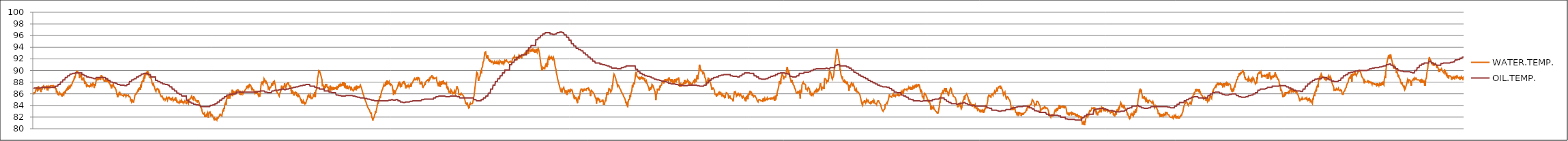
| Category | WATER.TEMP. | OIL.TEMP. |
|---|---|---|
| 2015-01-01_00:25:59 | 85.9 | 86.9 |
| 2015-01-01_00:26:00 | 85.8 | 86.9 |
| 2015-01-01_00:26:01 | 86.2 | 86.9 |
| 2015-01-01_00:26:02 | 86.3 | 87 |
| 2015-01-01_00:26:03 | 86.3 | 87 |
| 2015-01-01_00:26:03 | 86.2 | 87 |
| 2015-01-01_00:26:05 | 86.4 | 87 |
| 2015-01-01_00:26:06 | 86.5 | 87 |
| 2015-01-01_00:26:07 | 86.5 | 87 |
| 2015-01-01_00:26:08 | 86.9 | 87 |
| 2015-01-01_00:26:09 | 87.1 | 87 |
| 2015-01-01_00:26:10 | 86.9 | 87 |
| 2015-01-01_00:26:11 | 86.9 | 87 |
| 2015-01-01_00:26:12 | 86.4 | 87 |
| 2015-01-01_00:26:13 | 86.5 | 87 |
| 2015-01-01_00:26:14 | 87.1 | 87 |
| 2015-01-01_00:26:15 | 87.3 | 87 |
| 2015-01-01_00:26:16 | 86.8 | 87 |
| 2015-01-01_00:26:17 | 86.9 | 87 |
| 2015-01-01_00:26:18 | 87 | 87 |
| 2015-01-01_00:26:19 | 87.1 | 87 |
| 2015-01-01_00:26:20 | 87.1 | 87 |
| 2015-01-01_00:26:21 | 86.7 | 87 |
| 2015-01-01_00:26:22 | 86.7 | 87 |
| 2015-01-01_00:26:23 | 86.7 | 87 |
| 2015-01-01_00:26:24 | 86.3 | 87 |
| 2015-01-01_00:26:25 | 86.8 | 87 |
| 2015-01-01_00:26:26 | 86.9 | 87.1 |
| 2015-01-01_00:26:27 | 86.7 | 87.1 |
| 2015-01-01_00:26:28 | 86.8 | 87.1 |
| 2015-01-01_00:26:29 | 86.8 | 87.1 |
| 2015-01-01_00:26:30 | 87.2 | 87.1 |
| 2015-01-01_00:26:31 | 87.1 | 87.1 |
| 2015-01-01_00:26:32 | 87.2 | 87.1 |
| 2015-01-01_00:26:33 | 87.4 | 87.1 |
| 2015-01-01_00:26:34 | 87.5 | 87.1 |
| 2015-01-01_00:26:35 | 87.5 | 87.1 |
| 2015-01-01_00:26:36 | 87 | 87.1 |
| 2015-01-01_00:26:37 | 87.2 | 87.1 |
| 2015-01-01_00:26:38 | 87.3 | 87.1 |
| 2015-01-01_00:26:39 | 87.2 | 87.1 |
| 2015-01-01_00:26:40 | 87.2 | 87.1 |
| 2015-01-01_00:26:41 | 86.9 | 87.1 |
| 2015-01-01_00:26:42 | 87.2 | 87.1 |
| 2015-01-01_00:26:43 | 87.4 | 87.1 |
| 2015-01-01_00:26:44 | 87.2 | 87.1 |
| 2015-01-01_00:26:45 | 86.6 | 87.1 |
| 2015-01-01_00:26:46 | 87 | 87.1 |
| 2015-01-01_00:26:47 | 86.9 | 87.1 |
| 2015-01-01_00:26:48 | 86.8 | 87.1 |
| 2015-01-01_00:26:49 | 87.3 | 87.1 |
| 2015-01-01_00:26:50 | 86.9 | 87.1 |
| 2015-01-01_00:26:51 | 87.3 | 87.1 |
| 2015-01-01_00:26:52 | 87.4 | 87.1 |
| 2015-01-01_00:26:53 | 87.4 | 87.1 |
| 2015-01-01_00:26:54 | 87.1 | 87.1 |
| 2015-01-01_00:26:55 | 87 | 87.1 |
| 2015-01-01_00:26:56 | 87.4 | 87.1 |
| 2015-01-01_00:26:57 | 87.4 | 87.1 |
| 2015-01-01_00:26:58 | 87.5 | 87.1 |
| 2015-01-01_00:26:59 | 87.4 | 87.1 |
| 2015-01-01_00:27:00 | 87.4 | 87.1 |
| 2015-01-01_00:27:01 | 87.4 | 87.1 |
| 2015-01-01_00:27:02 | 87.4 | 87.1 |
| 2015-01-01_00:27:03 | 87.5 | 87.1 |
| 2015-01-01_00:27:04 | 87.5 | 87.1 |
| 2015-01-01_00:27:05 | 87.2 | 87.1 |
| 2015-01-01_00:27:06 | 87.4 | 87.1 |
| 2015-01-01_00:27:07 | 87.4 | 87.1 |
| 2015-01-01_00:27:08 | 87.4 | 87.1 |
| 2015-01-01_00:27:09 | 87.3 | 87.1 |
| 2015-01-01_00:27:10 | 87.3 | 87.1 |
| 2015-01-01_00:27:11 | 87.2 | 87.1 |
| 2015-01-01_00:27:12 | 87 | 87.1 |
| 2015-01-01_00:27:13 | 86.8 | 87.1 |
| 2015-01-01_00:27:14 | 87 | 87.3 |
| 2015-01-01_00:27:15 | 86.7 | 87.3 |
| 2015-01-01_00:27:16 | 86.2 | 87.3 |
| 2015-01-01_00:27:17 | 86.5 | 87.3 |
| 2015-01-01_00:27:18 | 86.4 | 87.3 |
| 2015-01-01_00:27:19 | 86.3 | 87.3 |
| 2015-01-01_00:27:20 | 86.2 | 87.3 |
| 2015-01-01_00:27:21 | 85.8 | 87.3 |
| 2015-01-01_00:27:22 | 86 | 87.6 |
| 2015-01-01_00:27:23 | 85.9 | 87.6 |
| 2015-01-01_00:27:24 | 85.8 | 87.6 |
| 2015-01-01_00:27:25 | 85.9 | 87.6 |
| 2015-01-01_00:27:26 | 86 | 87.6 |
| 2015-01-01_00:27:27 | 86.2 | 87.6 |
| 2015-01-01_00:27:28 | 86.2 | 87.6 |
| 2015-01-01_00:27:29 | 86 | 87.6 |
| 2015-01-01_00:27:30 | 86 | 88 |
| 2015-01-01_00:27:31 | 86.1 | 88 |
| 2015-01-01_00:27:32 | 85.8 | 88 |
| 2015-01-01_00:27:33 | 86 | 88 |
| 2015-01-01_00:27:34 | 85.8 | 88 |
| 2015-01-01_00:27:35 | 85.5 | 88 |
| 2015-01-01_00:27:36 | 86 | 88 |
| 2015-01-01_00:27:37 | 85.9 | 88 |
| 2015-01-01_00:27:38 | 85.7 | 88.4 |
| 2015-01-01_00:27:39 | 86.1 | 88.4 |
| 2015-01-01_00:27:40 | 86.1 | 88.4 |
| 2015-01-01_00:27:41 | 85.9 | 88.4 |
| 2015-01-01_00:27:42 | 86.2 | 88.4 |
| 2015-01-01_00:27:43 | 86.2 | 88.4 |
| 2015-01-01_00:27:44 | 86.3 | 88.4 |
| 2015-01-01_00:27:45 | 86.4 | 88.4 |
| 2015-01-01_00:27:46 | 86.1 | 88.8 |
| 2015-01-01_00:27:47 | 86.5 | 88.8 |
| 2015-01-01_00:27:48 | 86.5 | 88.8 |
| 2015-01-01_00:27:49 | 86.7 | 88.8 |
| 2015-01-01_00:27:50 | 86.5 | 88.8 |
| 2015-01-01_00:27:51 | 86.7 | 88.8 |
| 2015-01-01_00:27:52 | 86.8 | 88.8 |
| 2015-01-01_00:27:53 | 87 | 88.8 |
| 2015-01-01_00:27:54 | 87.1 | 89.1 |
| 2015-01-01_00:27:55 | 86.7 | 89.1 |
| 2015-01-01_00:27:56 | 87.2 | 89.1 |
| 2015-01-01_00:27:57 | 87.2 | 89.1 |
| 2015-01-01_00:27:58 | 86.8 | 89.1 |
| 2015-01-01_00:27:59 | 87.3 | 89.1 |
| 2015-01-01_00:28:00 | 87.2 | 89.1 |
| 2015-01-01_00:28:01 | 87.4 | 89.1 |
| 2015-01-01_00:28:02 | 87.1 | 89.4 |
| 2015-01-01_00:28:03 | 87.3 | 89.4 |
| 2015-01-01_00:28:04 | 87.3 | 89.4 |
| 2015-01-01_00:28:05 | 87.6 | 89.4 |
| 2015-01-01_00:28:06 | 87.3 | 89.4 |
| 2015-01-01_00:28:07 | 87.5 | 89.4 |
| 2015-01-01_00:28:08 | 87.4 | 89.4 |
| 2015-01-01_00:28:09 | 87.8 | 89.4 |
| 2015-01-01_00:28:10 | 87.9 | 89.5 |
| 2015-01-01_00:28:11 | 88.1 | 89.5 |
| 2015-01-01_00:28:12 | 88 | 89.5 |
| 2015-01-01_00:28:13 | 88.1 | 89.5 |
| 2015-01-01_00:28:14 | 88.3 | 89.5 |
| 2015-01-01_00:28:15 | 88.3 | 89.5 |
| 2015-01-01_00:28:16 | 88.3 | 89.5 |
| 2015-01-01_00:28:17 | 89 | 89.5 |
| 2015-01-01_00:28:18 | 88.8 | 89.6 |
| 2015-01-01_00:28:19 | 88.9 | 89.6 |
| 2015-01-01_00:28:20 | 89.1 | 89.6 |
| 2015-01-01_00:28:21 | 89.4 | 89.6 |
| 2015-01-01_00:28:22 | 89.4 | 89.6 |
| 2015-01-01_00:28:23 | 89.3 | 89.6 |
| 2015-01-01_00:28:24 | 89.9 | 89.6 |
| 2015-01-01_00:28:25 | 89.9 | 89.6 |
| 2015-01-01_00:28:26 | 89.9 | 89.6 |
| 2015-01-01_00:28:27 | 89.8 | 89.6 |
| 2015-01-01_00:28:28 | 89.8 | 89.6 |
| 2015-01-01_00:28:29 | 89.7 | 89.6 |
| 2015-01-01_00:28:30 | 89.7 | 89.6 |
| 2015-01-01_00:28:31 | 89.6 | 89.6 |
| 2015-01-01_00:28:32 | 89.4 | 89.6 |
| 2015-01-01_00:28:33 | 89.2 | 89.6 |
| 2015-01-01_00:28:34 | 88.7 | 89.6 |
| 2015-01-01_00:28:35 | 89.3 | 89.6 |
| 2015-01-01_00:28:36 | 89.2 | 89.6 |
| 2015-01-01_00:28:37 | 89.3 | 89.6 |
| 2015-01-01_00:28:38 | 88.9 | 89.6 |
| 2015-01-01_00:28:39 | 89.4 | 89.6 |
| 2015-01-01_00:28:40 | 89.1 | 89.6 |
| 2015-01-01_00:28:41 | 89 | 89.6 |
| 2015-01-01_00:28:42 | 88.3 | 89.3 |
| 2015-01-01_00:28:43 | 88.6 | 89.3 |
| 2015-01-01_00:28:44 | 88.7 | 89.3 |
| 2015-01-01_00:28:45 | 88.3 | 89.3 |
| 2015-01-01_00:28:46 | 88.6 | 89.3 |
| 2015-01-01_00:28:47 | 88.8 | 89.3 |
| 2015-01-01_00:28:48 | 88.6 | 89.3 |
| 2015-01-01_00:28:49 | 88.6 | 89.3 |
| 2015-01-01_00:28:50 | 88.1 | 89.1 |
| 2015-01-01_00:28:51 | 87.7 | 89.1 |
| 2015-01-01_00:28:52 | 88.1 | 89.1 |
| 2015-01-01_00:28:53 | 88 | 89.1 |
| 2015-01-01_00:28:54 | 88 | 89.1 |
| 2015-01-01_00:28:55 | 87.9 | 89.1 |
| 2015-01-01_00:28:56 | 87.7 | 89.1 |
| 2015-01-01_00:28:57 | 87.3 | 89.1 |
| 2015-01-01_00:28:58 | 87.2 | 88.9 |
| 2015-01-01_00:28:59 | 87.3 | 88.9 |
| 2015-01-01_00:29:00 | 87.5 | 88.9 |
| 2015-01-01_00:29:01 | 87.3 | 88.9 |
| 2015-01-01_00:29:02 | 87.2 | 88.9 |
| 2015-01-01_00:29:03 | 87.2 | 88.9 |
| 2015-01-01_00:29:04 | 87.3 | 88.9 |
| 2015-01-01_00:29:05 | 87.5 | 88.9 |
| 2015-01-01_00:29:06 | 87.2 | 88.8 |
| 2015-01-01_00:29:07 | 87.4 | 88.8 |
| 2015-01-01_00:29:08 | 87.2 | 88.8 |
| 2015-01-01_00:29:09 | 87.2 | 88.8 |
| 2015-01-01_00:29:10 | 87.3 | 88.8 |
| 2015-01-01_00:29:11 | 87.3 | 88.8 |
| 2015-01-01_00:29:12 | 87.7 | 88.8 |
| 2015-01-01_00:29:13 | 87.7 | 88.8 |
| 2015-01-01_00:29:14 | 87.6 | 88.7 |
| 2015-01-01_00:29:15 | 87.6 | 88.7 |
| 2015-01-01_00:29:16 | 87.4 | 88.7 |
| 2015-01-01_00:29:17 | 87.4 | 88.7 |
| 2015-01-01_00:29:18 | 87.7 | 88.7 |
| 2015-01-01_00:29:19 | 87.5 | 88.7 |
| 2015-01-01_00:29:20 | 87.7 | 88.7 |
| 2015-01-01_00:29:21 | 87.7 | 88.7 |
| 2015-01-01_00:29:22 | 87.4 | 88.6 |
| 2015-01-01_00:29:23 | 87 | 88.6 |
| 2015-01-01_00:29:24 | 87.3 | 88.6 |
| 2015-01-01_00:29:25 | 87.7 | 88.6 |
| 2015-01-01_00:29:26 | 87.6 | 88.6 |
| 2015-01-01_00:29:27 | 87.4 | 88.6 |
| 2015-01-01_00:29:28 | 87.8 | 88.6 |
| 2015-01-01_00:29:29 | 87.9 | 88.6 |
| 2015-01-01_00:29:30 | 88.4 | 88.8 |
| 2015-01-01_00:29:31 | 88.6 | 88.8 |
| 2015-01-01_00:29:32 | 88.4 | 88.8 |
| 2015-01-01_00:29:33 | 88.3 | 88.8 |
| 2015-01-01_00:29:34 | 88.4 | 88.8 |
| 2015-01-01_00:29:35 | 88.4 | 88.8 |
| 2015-01-01_00:29:36 | 88.8 | 88.8 |
| 2015-01-01_00:29:37 | 88.7 | 88.8 |
| 2015-01-01_00:29:38 | 88.5 | 88.8 |
| 2015-01-01_00:29:39 | 88.5 | 88.8 |
| 2015-01-01_00:29:40 | 88.4 | 88.8 |
| 2015-01-01_00:29:41 | 88.6 | 88.8 |
| 2015-01-01_00:29:42 | 88.7 | 88.8 |
| 2015-01-01_00:29:43 | 88.9 | 88.8 |
| 2015-01-01_00:29:44 | 88.4 | 88.8 |
| 2015-01-01_00:29:45 | 88.6 | 88.8 |
| 2015-01-01_00:29:46 | 88.8 | 88.8 |
| 2015-01-01_00:29:47 | 89.2 | 88.8 |
| 2015-01-01_00:29:48 | 88.9 | 88.8 |
| 2015-01-01_00:29:49 | 89.1 | 88.8 |
| 2015-01-01_00:29:50 | 88.9 | 88.8 |
| 2015-01-01_00:29:51 | 88.7 | 88.8 |
| 2015-01-01_00:29:52 | 88.9 | 88.8 |
| 2015-01-01_00:29:53 | 88.5 | 88.8 |
| 2015-01-01_00:29:54 | 88.4 | 88.8 |
| 2015-01-01_00:29:55 | 88.6 | 88.8 |
| 2015-01-01_00:29:56 | 88.3 | 88.8 |
| 2015-01-01_00:29:57 | 88.1 | 88.8 |
| 2015-01-01_00:29:58 | 88.4 | 88.8 |
| 2015-01-01_00:29:59 | 88.1 | 88.8 |
| 2015-01-01_00:30:00 | 88.3 | 88.8 |
| 2015-01-01_00:30:01 | 88.2 | 88.8 |
| 2015-01-01_00:30:02 | 88.5 | 88.6 |
| 2015-01-01_00:30:03 | 88.2 | 88.6 |
| 2015-01-01_00:30:04 | 88.4 | 88.6 |
| 2015-01-01_00:30:05 | 88.1 | 88.6 |
| 2015-01-01_00:30:06 | 88.5 | 88.6 |
| 2015-01-01_00:30:07 | 88 | 88.6 |
| 2015-01-01_00:30:08 | 88.3 | 88.6 |
| 2015-01-01_00:30:09 | 88.3 | 88.6 |
| 2015-01-01_00:30:10 | 88.1 | 88.3 |
| 2015-01-01_00:30:11 | 88.1 | 88.3 |
| 2015-01-01_00:30:12 | 88.4 | 88.3 |
| 2015-01-01_00:30:13 | 88.3 | 88.3 |
| 2015-01-01_00:30:14 | 87.8 | 88.3 |
| 2015-01-01_00:30:15 | 87.9 | 88.3 |
| 2015-01-01_00:30:16 | 87.8 | 88.3 |
| 2015-01-01_00:30:17 | 87.6 | 88.3 |
| 2015-01-01_00:30:18 | 87.3 | 88 |
| 2015-01-01_00:30:19 | 87.6 | 88 |
| 2015-01-01_00:30:20 | 87.3 | 88 |
| 2015-01-01_00:30:21 | 86.9 | 88 |
| 2015-01-01_00:30:22 | 87.3 | 88 |
| 2015-01-01_00:30:23 | 87.5 | 88 |
| 2015-01-01_00:30:24 | 87.3 | 88 |
| 2015-01-01_00:30:25 | 87.3 | 88 |
| 2015-01-01_00:30:26 | 87.4 | 87.9 |
| 2015-01-01_00:30:27 | 87.7 | 87.9 |
| 2015-01-01_00:30:28 | 87.7 | 87.9 |
| 2015-01-01_00:30:29 | 87.3 | 87.9 |
| 2015-01-01_00:30:30 | 87.3 | 87.9 |
| 2015-01-01_00:30:31 | 87.1 | 87.9 |
| 2015-01-01_00:30:32 | 87.2 | 87.9 |
| 2015-01-01_00:30:33 | 87.1 | 87.9 |
| 2015-01-01_00:30:34 | 87 | 87.8 |
| 2015-01-01_00:30:35 | 86.9 | 87.8 |
| 2015-01-01_00:30:36 | 86.9 | 87.8 |
| 2015-01-01_00:30:37 | 86.6 | 87.8 |
| 2015-01-01_00:30:38 | 86.3 | 87.8 |
| 2015-01-01_00:30:39 | 86.4 | 87.8 |
| 2015-01-01_00:30:40 | 85.8 | 87.8 |
| 2015-01-01_00:30:41 | 86 | 87.8 |
| 2015-01-01_00:30:42 | 85.4 | 87.6 |
| 2015-01-01_00:30:43 | 85.7 | 87.6 |
| 2015-01-01_00:30:44 | 85.8 | 87.6 |
| 2015-01-01_00:30:45 | 86 | 87.6 |
| 2015-01-01_00:30:46 | 86.1 | 87.6 |
| 2015-01-01_00:30:47 | 86.2 | 87.6 |
| 2015-01-01_00:30:48 | 85.9 | 87.6 |
| 2015-01-01_00:30:49 | 85.9 | 87.6 |
| 2015-01-01_00:30:50 | 86.1 | 87.5 |
| 2015-01-01_00:30:51 | 85.9 | 87.5 |
| 2015-01-01_00:30:52 | 86.1 | 87.5 |
| 2015-01-01_00:30:53 | 85.8 | 87.5 |
| 2015-01-01_00:30:54 | 85.8 | 87.5 |
| 2015-01-01_00:30:55 | 85.7 | 87.5 |
| 2015-01-01_00:30:56 | 85.8 | 87.5 |
| 2015-01-01_00:30:57 | 85.8 | 87.5 |
| 2015-01-01_00:30:58 | 85.8 | 87.5 |
| 2015-01-01_00:30:59 | 85.7 | 87.5 |
| 2015-01-01_00:31:00 | 85.8 | 87.5 |
| 2015-01-01_00:31:01 | 85.7 | 87.5 |
| 2015-01-01_00:31:02 | 85.6 | 87.5 |
| 2015-01-01_00:31:03 | 85.9 | 87.5 |
| 2015-01-01_00:31:04 | 85.7 | 87.5 |
| 2015-01-01_00:31:05 | 85.9 | 87.5 |
| 2015-01-01_00:31:06 | 85.9 | 87.4 |
| 2015-01-01_00:31:07 | 85.8 | 87.4 |
| 2015-01-01_00:31:08 | 85.8 | 87.4 |
| 2015-01-01_00:31:09 | 85.9 | 87.4 |
| 2015-01-01_00:31:10 | 85.5 | 87.4 |
| 2015-01-01_00:31:11 | 85.6 | 87.4 |
| 2015-01-01_00:31:12 | 85.8 | 87.4 |
| 2015-01-01_00:31:13 | 85.8 | 87.4 |
| 2015-01-01_00:31:14 | 85.8 | 87.6 |
| 2015-01-01_00:31:15 | 85.7 | 87.6 |
| 2015-01-01_00:31:16 | 85.8 | 87.6 |
| 2015-01-01_00:31:17 | 85.6 | 87.6 |
| 2015-01-01_00:31:18 | 85.8 | 87.6 |
| 2015-01-01_00:31:19 | 85.7 | 87.6 |
| 2015-01-01_00:31:20 | 85.5 | 87.6 |
| 2015-01-01_00:31:21 | 85.6 | 87.6 |
| 2015-01-01_00:31:22 | 85.6 | 88.1 |
| 2015-01-01_00:31:23 | 85.5 | 88.1 |
| 2015-01-01_00:31:24 | 85.4 | 88.1 |
| 2015-01-01_00:31:25 | 85.2 | 88.1 |
| 2015-01-01_00:31:26 | 84.7 | 88.1 |
| 2015-01-01_00:31:27 | 85.1 | 88.1 |
| 2015-01-01_00:31:28 | 84.9 | 88.1 |
| 2015-01-01_00:31:29 | 84.6 | 88.1 |
| 2015-01-01_00:31:30 | 84.7 | 88.4 |
| 2015-01-01_00:31:31 | 84.6 | 88.4 |
| 2015-01-01_00:31:32 | 84.9 | 88.4 |
| 2015-01-01_00:31:33 | 84.9 | 88.4 |
| 2015-01-01_00:31:34 | 84.7 | 88.4 |
| 2015-01-01_00:31:35 | 84.5 | 88.4 |
| 2015-01-01_00:31:36 | 84.7 | 88.4 |
| 2015-01-01_00:31:37 | 84.7 | 88.4 |
| 2015-01-01_00:31:38 | 85.1 | 88.6 |
| 2015-01-01_00:31:39 | 85.1 | 88.6 |
| 2015-01-01_00:31:40 | 85.7 | 88.6 |
| 2015-01-01_00:31:41 | 85.8 | 88.6 |
| 2015-01-01_00:31:42 | 85.9 | 88.6 |
| 2015-01-01_00:31:43 | 86.1 | 88.6 |
| 2015-01-01_00:31:44 | 85.9 | 88.6 |
| 2015-01-01_00:31:45 | 86.1 | 88.6 |
| 2015-01-01_00:31:46 | 86.2 | 88.9 |
| 2015-01-01_00:31:47 | 86.2 | 88.9 |
| 2015-01-01_00:31:48 | 86.3 | 88.9 |
| 2015-01-01_00:31:49 | 86.3 | 88.9 |
| 2015-01-01_00:31:50 | 86.4 | 88.9 |
| 2015-01-01_00:31:51 | 86.7 | 88.9 |
| 2015-01-01_00:31:52 | 86.4 | 88.9 |
| 2015-01-01_00:31:53 | 86.7 | 88.9 |
| 2015-01-01_00:31:54 | 86.7 | 89.1 |
| 2015-01-01_00:31:55 | 86.9 | 89.1 |
| 2015-01-01_00:31:56 | 86.7 | 89.1 |
| 2015-01-01_00:31:57 | 87.1 | 89.1 |
| 2015-01-01_00:31:58 | 86.9 | 89.1 |
| 2015-01-01_00:31:59 | 86.7 | 89.1 |
| 2015-01-01_00:32:00 | 87.6 | 89.1 |
| 2015-01-01_00:32:01 | 87.1 | 89.1 |
| 2015-01-01_00:32:02 | 87.5 | 89.4 |
| 2015-01-01_00:32:03 | 87.8 | 89.4 |
| 2015-01-01_00:32:04 | 87.9 | 89.4 |
| 2015-01-01_00:32:05 | 88.2 | 89.4 |
| 2015-01-01_00:32:06 | 88 | 89.4 |
| 2015-01-01_00:32:07 | 88.1 | 89.4 |
| 2015-01-01_00:32:08 | 88.4 | 89.4 |
| 2015-01-01_00:32:09 | 88.1 | 89.4 |
| 2015-01-01_00:32:10 | 88.8 | 89.5 |
| 2015-01-01_00:32:11 | 88.6 | 89.5 |
| 2015-01-01_00:32:12 | 89.1 | 89.5 |
| 2015-01-01_00:32:13 | 89.2 | 89.5 |
| 2015-01-01_00:32:14 | 88.9 | 89.5 |
| 2015-01-01_00:32:15 | 89.3 | 89.5 |
| 2015-01-01_00:32:16 | 89.4 | 89.5 |
| 2015-01-01_00:32:17 | 89.5 | 89.5 |
| 2015-01-01_00:32:18 | 89.5 | 89.5 |
| 2015-01-01_00:32:19 | 89.4 | 89.5 |
| 2015-01-01_00:32:20 | 89.7 | 89.5 |
| 2015-01-01_00:32:21 | 89.2 | 89.5 |
| 2015-01-01_00:32:22 | 89.6 | 89.5 |
| 2015-01-01_00:32:23 | 89.6 | 89.5 |
| 2015-01-01_00:32:24 | 89.8 | 89.5 |
| 2015-01-01_00:32:25 | 89.8 | 89.5 |
| 2015-01-01_00:32:26 | 89.6 | 89.3 |
| 2015-01-01_00:32:27 | 89.3 | 89.3 |
| 2015-01-01_00:32:28 | 89.2 | 89.3 |
| 2015-01-01_00:32:29 | 88.8 | 89.3 |
| 2015-01-01_00:32:30 | 88.7 | 89.3 |
| 2015-01-01_00:32:31 | 88.9 | 89.3 |
| 2015-01-01_00:32:32 | 88.8 | 89.3 |
| 2015-01-01_00:32:33 | 88.9 | 89.3 |
| 2015-01-01_00:32:34 | 88.7 | 88.9 |
| 2015-01-01_00:32:35 | 88.6 | 88.9 |
| 2015-01-01_00:32:36 | 88.5 | 88.9 |
| 2015-01-01_00:32:37 | 88.2 | 88.9 |
| 2015-01-01_00:32:38 | 87.8 | 88.9 |
| 2015-01-01_00:32:39 | 87.8 | 88.9 |
| 2015-01-01_00:32:40 | 87.7 | 88.9 |
| 2015-01-01_00:32:41 | 87.5 | 88.9 |
| 2015-01-01_00:32:42 | 87.6 | 88.9 |
| 2015-01-01_00:32:43 | 87.7 | 88.9 |
| 2015-01-01_00:32:44 | 87.4 | 88.9 |
| 2015-01-01_00:32:45 | 87.3 | 88.9 |
| 2015-01-01_00:32:46 | 87.2 | 88.9 |
| 2015-01-01_00:32:47 | 86.9 | 88.9 |
| 2015-01-01_00:32:48 | 86.8 | 88.9 |
| 2015-01-01_00:32:49 | 86.6 | 88.9 |
| 2015-01-01_00:32:50 | 86.7 | 88.3 |
| 2015-01-01_00:32:51 | 86.4 | 88.3 |
| 2015-01-01_00:32:52 | 86.7 | 88.3 |
| 2015-01-01_00:32:53 | 86.6 | 88.3 |
| 2015-01-01_00:32:54 | 86.8 | 88.3 |
| 2015-01-01_00:32:55 | 86.9 | 88.3 |
| 2015-01-01_00:32:56 | 86.9 | 88.3 |
| 2015-01-01_00:32:57 | 86.9 | 88.3 |
| 2015-01-01_00:32:58 | 86.7 | 88.1 |
| 2015-01-01_00:32:59 | 86.9 | 88.1 |
| 2015-01-01_00:33:00 | 87 | 88.1 |
| 2015-01-01_00:33:01 | 86.8 | 88.1 |
| 2015-01-01_00:33:02 | 86.2 | 88.1 |
| 2015-01-01_00:33:03 | 86.5 | 88.1 |
| 2015-01-01_00:33:04 | 86.1 | 88.1 |
| 2015-01-01_00:33:05 | 86.2 | 88.1 |
| 2015-01-01_00:33:06 | 86.2 | 87.9 |
| 2015-01-01_00:33:07 | 85.7 | 87.9 |
| 2015-01-01_00:33:08 | 85.7 | 87.9 |
| 2015-01-01_00:33:09 | 85.5 | 87.9 |
| 2015-01-01_00:33:10 | 85.6 | 87.9 |
| 2015-01-01_00:33:11 | 85.4 | 87.9 |
| 2015-01-01_00:33:12 | 85.6 | 87.9 |
| 2015-01-01_00:33:13 | 85.5 | 87.9 |
| 2015-01-01_00:33:14 | 85.3 | 87.7 |
| 2015-01-01_00:33:15 | 85.4 | 87.7 |
| 2015-01-01_00:33:16 | 85.1 | 87.7 |
| 2015-01-01_00:33:17 | 85.3 | 87.7 |
| 2015-01-01_00:33:18 | 85.1 | 87.7 |
| 2015-01-01_00:33:19 | 85.1 | 87.7 |
| 2015-01-01_00:33:20 | 85 | 87.7 |
| 2015-01-01_00:33:21 | 85.1 | 87.7 |
| 2015-01-01_00:33:22 | 84.9 | 87.6 |
| 2015-01-01_00:33:23 | 85 | 87.6 |
| 2015-01-01_00:33:24 | 85.1 | 87.6 |
| 2015-01-01_00:33:25 | 85.2 | 87.6 |
| 2015-01-01_00:33:26 | 85.2 | 87.6 |
| 2015-01-01_00:33:27 | 85.4 | 87.6 |
| 2015-01-01_00:33:28 | 85.4 | 87.6 |
| 2015-01-01_00:33:29 | 85.4 | 87.6 |
| 2015-01-01_00:33:30 | 84.9 | 87.5 |
| 2015-01-01_00:33:31 | 85.1 | 87.5 |
| 2015-01-01_00:33:32 | 85.1 | 87.5 |
| 2015-01-01_00:33:33 | 85.4 | 87.5 |
| 2015-01-01_00:33:34 | 85.3 | 87.5 |
| 2015-01-01_00:33:35 | 85.3 | 87.5 |
| 2015-01-01_00:33:36 | 85.4 | 87.5 |
| 2015-01-01_00:33:37 | 85.2 | 87.5 |
| 2015-01-01_00:33:38 | 85.1 | 87.2 |
| 2015-01-01_00:33:39 | 85 | 87.2 |
| 2015-01-01_00:33:40 | 85.1 | 87.2 |
| 2015-01-01_00:33:41 | 84.9 | 87.2 |
| 2015-01-01_00:33:42 | 85.2 | 87.2 |
| 2015-01-01_00:33:43 | 85.1 | 87.2 |
| 2015-01-01_00:33:44 | 85 | 87.2 |
| 2015-01-01_00:33:45 | 85 | 87.2 |
| 2015-01-01_00:33:46 | 85 | 86.8 |
| 2015-01-01_00:33:47 | 85.3 | 86.8 |
| 2015-01-01_00:33:48 | 85.1 | 86.8 |
| 2015-01-01_00:33:49 | 84.8 | 86.8 |
| 2015-01-01_00:33:50 | 84.9 | 86.8 |
| 2015-01-01_00:33:51 | 85 | 86.8 |
| 2015-01-01_00:33:52 | 85.1 | 86.8 |
| 2015-01-01_00:33:53 | 85.1 | 86.8 |
| 2015-01-01_00:33:54 | 85 | 86.5 |
| 2015-01-01_00:33:55 | 85.2 | 86.5 |
| 2015-01-01_00:33:56 | 84.8 | 86.5 |
| 2015-01-01_00:33:57 | 85.4 | 86.5 |
| 2015-01-01_00:33:58 | 85 | 86.5 |
| 2015-01-01_00:33:59 | 85 | 86.5 |
| 2015-01-01_00:34:00 | 84.8 | 86.5 |
| 2015-01-01_00:34:01 | 85 | 86.5 |
| 2015-01-01_00:34:02 | 84.6 | 86.1 |
| 2015-01-01_00:34:03 | 84.6 | 86.1 |
| 2015-01-01_00:34:04 | 84.7 | 86.1 |
| 2015-01-01_00:34:05 | 84.6 | 86.1 |
| 2015-01-01_00:34:06 | 84.4 | 86.1 |
| 2015-01-01_00:34:07 | 84.6 | 86.1 |
| 2015-01-01_00:34:08 | 84.4 | 86.1 |
| 2015-01-01_00:34:09 | 84.7 | 86.1 |
| 2015-01-01_00:34:10 | 84.5 | 85.9 |
| 2015-01-01_00:34:11 | 84.5 | 85.9 |
| 2015-01-01_00:34:12 | 84.8 | 85.9 |
| 2015-01-01_00:34:13 | 84.9 | 85.9 |
| 2015-01-01_00:34:14 | 84.6 | 85.9 |
| 2015-01-01_00:34:15 | 84.7 | 85.9 |
| 2015-01-01_00:34:16 | 84.6 | 85.9 |
| 2015-01-01_00:34:17 | 84.9 | 85.9 |
| 2015-01-01_00:34:18 | 84.5 | 85.6 |
| 2015-01-01_00:34:19 | 84.8 | 85.6 |
| 2015-01-01_00:34:20 | 84.7 | 85.6 |
| 2015-01-01_00:34:21 | 84.5 | 85.6 |
| 2015-01-01_00:34:22 | 84.5 | 85.6 |
| 2015-01-01_00:34:23 | 84.6 | 85.6 |
| 2015-01-01_00:34:24 | 84.6 | 85.6 |
| 2015-01-01_00:34:25 | 84.4 | 85.6 |
| 2015-01-01_00:34:26 | 84.3 | 85.6 |
| 2015-01-01_00:34:27 | 84.5 | 85.6 |
| 2015-01-01_00:34:28 | 84.8 | 85.6 |
| 2015-01-01_00:34:29 | 84.7 | 85.6 |
| 2015-01-01_00:34:30 | 84.7 | 85.6 |
| 2015-01-01_00:34:31 | 84.6 | 85.6 |
| 2015-01-01_00:34:32 | 84.5 | 85.6 |
| 2015-01-01_00:34:33 | 84.2 | 85.6 |
| 2015-01-01_00:34:34 | 84.5 | 84.9 |
| 2015-01-01_00:34:35 | 84.5 | 84.9 |
| 2015-01-01_00:34:36 | 84.7 | 84.9 |
| 2015-01-01_00:34:37 | 84.8 | 84.9 |
| 2015-01-01_00:34:38 | 84.5 | 84.9 |
| 2015-01-01_00:34:39 | 84.5 | 84.9 |
| 2015-01-01_00:34:40 | 84.3 | 84.9 |
| 2015-01-01_00:34:41 | 84.9 | 84.9 |
| 2015-01-01_00:34:42 | 84.7 | 84.6 |
| 2015-01-01_00:34:43 | 85.1 | 84.6 |
| 2015-01-01_00:34:44 | 85 | 84.6 |
| 2015-01-01_00:34:45 | 85.1 | 84.6 |
| 2015-01-01_00:34:46 | 85.1 | 84.6 |
| 2015-01-01_00:34:47 | 85.1 | 84.6 |
| 2015-01-01_00:34:48 | 85.3 | 84.6 |
| 2015-01-01_00:34:49 | 85.2 | 84.6 |
| 2015-01-01_00:34:50 | 85.3 | 84.4 |
| 2015-01-01_00:34:51 | 85.6 | 84.4 |
| 2015-01-01_00:34:52 | 85.4 | 84.4 |
| 2015-01-01_00:34:53 | 85.2 | 84.4 |
| 2015-01-01_00:34:54 | 85.1 | 84.4 |
| 2015-01-01_00:34:55 | 85.1 | 84.4 |
| 2015-01-01_00:34:56 | 85 | 84.4 |
| 2015-01-01_00:34:57 | 85.4 | 84.4 |
| 2015-01-01_00:34:58 | 85.6 | 84.2 |
| 2015-01-01_00:34:59 | 85.4 | 84.2 |
| 2015-01-01_00:35:00 | 85.4 | 84.2 |
| 2015-01-01_00:35:01 | 85.4 | 84.2 |
| 2015-01-01_00:35:02 | 85.2 | 84.2 |
| 2015-01-01_00:35:03 | 84.8 | 84.2 |
| 2015-01-01_00:35:04 | 85 | 84.2 |
| 2015-01-01_00:35:05 | 84.8 | 84.2 |
| 2015-01-01_00:35:06 | 84.9 | 84.1 |
| 2015-01-01_00:35:07 | 84.8 | 84.1 |
| 2015-01-01_00:35:08 | 84.8 | 84.1 |
| 2015-01-01_00:35:09 | 84.8 | 84.1 |
| 2015-01-01_00:35:10 | 84.5 | 84.1 |
| 2015-01-01_00:35:11 | 84.8 | 84.1 |
| 2015-01-01_00:35:12 | 84.9 | 84.1 |
| 2015-01-01_00:35:13 | 84.8 | 84.1 |
| 2015-01-01_00:35:14 | 84.8 | 84 |
| 2015-01-01_00:35:15 | 84.7 | 84 |
| 2015-01-01_00:35:16 | 84.5 | 84 |
| 2015-01-01_00:35:17 | 84.3 | 84 |
| 2015-01-01_00:35:18 | 84.2 | 84 |
| 2015-01-01_00:35:19 | 84.2 | 84 |
| 2015-01-01_00:35:20 | 83.9 | 84 |
| 2015-01-01_00:35:21 | 83.8 | 84 |
| 2015-01-01_00:35:22 | 83.8 | 83.8 |
| 2015-01-01_00:35:23 | 83.6 | 83.8 |
| 2015-01-01_00:35:24 | 83.5 | 83.8 |
| 2015-01-01_00:35:25 | 83.4 | 83.8 |
| 2015-01-01_00:35:26 | 83.1 | 83.8 |
| 2015-01-01_00:35:27 | 82.9 | 83.8 |
| 2015-01-01_00:35:28 | 82.7 | 83.8 |
| 2015-01-01_00:35:29 | 82.8 | 83.8 |
| 2015-01-01_00:35:30 | 82.6 | 83.8 |
| 2015-01-01_00:35:31 | 82.5 | 83.8 |
| 2015-01-01_00:35:32 | 82.5 | 83.8 |
| 2015-01-01_00:35:33 | 82.6 | 83.8 |
| 2015-01-01_00:35:34 | 82.7 | 83.8 |
| 2015-01-01_00:35:35 | 82.7 | 83.8 |
| 2015-01-01_00:35:36 | 82 | 83.8 |
| 2015-01-01_00:35:37 | 82.4 | 83.8 |
| 2015-01-01_00:35:38 | 82.3 | 83.8 |
| 2015-01-01_00:35:39 | 82.4 | 83.8 |
| 2015-01-01_00:35:40 | 82 | 83.8 |
| 2015-01-01_00:35:41 | 82.4 | 83.8 |
| 2015-01-01_00:35:42 | 82.4 | 83.8 |
| 2015-01-01_00:35:43 | 82.6 | 83.8 |
| 2015-01-01_00:35:44 | 82.5 | 83.8 |
| 2015-01-01_00:35:45 | 82.8 | 83.8 |
| 2015-01-01_00:35:46 | 82.4 | 83.8 |
| 2015-01-01_00:35:47 | 81.9 | 83.8 |
| 2015-01-01_00:35:48 | 82.4 | 83.8 |
| 2015-01-01_00:35:49 | 82.5 | 83.8 |
| 2015-01-01_00:35:50 | 82.8 | 83.8 |
| 2015-01-01_00:35:51 | 82.8 | 83.8 |
| 2015-01-01_00:35:52 | 82.9 | 83.8 |
| 2015-01-01_00:35:53 | 82.9 | 83.8 |
| 2015-01-01_00:35:54 | 82.7 | 84 |
| 2015-01-01_00:35:55 | 82.7 | 84 |
| 2015-01-01_00:35:56 | 82.1 | 84 |
| 2015-01-01_00:35:57 | 82.5 | 84 |
| 2015-01-01_00:35:58 | 82.6 | 84 |
| 2015-01-01_00:35:59 | 82.5 | 84 |
| 2015-01-01_00:36:00 | 82.4 | 84 |
| 2015-01-01_00:36:01 | 82.5 | 84 |
| 2015-01-01_00:36:02 | 82.2 | 84.1 |
| 2015-01-01_00:36:03 | 82.3 | 84.1 |
| 2015-01-01_00:36:04 | 82.1 | 84.1 |
| 2015-01-01_00:36:05 | 81.8 | 84.1 |
| 2015-01-01_00:36:06 | 81.7 | 84.1 |
| 2015-01-01_00:36:07 | 81.8 | 84.1 |
| 2015-01-01_00:36:08 | 81.4 | 84.1 |
| 2015-01-01_00:36:09 | 81.8 | 84.1 |
| 2015-01-01_00:36:10 | 81.8 | 84.3 |
| 2015-01-01_00:36:11 | 81.6 | 84.3 |
| 2015-01-01_00:36:12 | 81.7 | 84.3 |
| 2015-01-01_00:36:13 | 81.7 | 84.3 |
| 2015-01-01_00:36:14 | 81.7 | 84.3 |
| 2015-01-01_00:36:15 | 81.8 | 84.3 |
| 2015-01-01_00:36:16 | 81.5 | 84.3 |
| 2015-01-01_00:36:17 | 81.6 | 84.3 |
| 2015-01-01_00:36:18 | 82 | 84.6 |
| 2015-01-01_00:36:19 | 81.7 | 84.6 |
| 2015-01-01_00:36:20 | 81.7 | 84.6 |
| 2015-01-01_00:36:21 | 82 | 84.6 |
| 2015-01-01_00:36:22 | 81.9 | 84.6 |
| 2015-01-01_00:36:23 | 82 | 84.6 |
| 2015-01-01_00:36:24 | 82.1 | 84.6 |
| 2015-01-01_00:36:25 | 82.3 | 84.6 |
| 2015-01-01_00:36:26 | 82.3 | 84.9 |
| 2015-01-01_00:36:27 | 82.5 | 84.9 |
| 2015-01-01_00:36:28 | 82.6 | 84.9 |
| 2015-01-01_00:36:29 | 82.5 | 84.9 |
| 2015-01-01_00:36:30 | 82.3 | 84.9 |
| 2015-01-01_00:36:31 | 82.3 | 84.9 |
| 2015-01-01_00:36:32 | 82.4 | 84.9 |
| 2015-01-01_00:36:33 | 82.2 | 84.9 |
| 2015-01-01_00:36:34 | 82.6 | 85.2 |
| 2015-01-01_00:36:35 | 82.8 | 85.2 |
| 2015-01-01_00:36:36 | 83.1 | 85.2 |
| 2015-01-01_00:36:37 | 83.3 | 85.2 |
| 2015-01-01_00:36:38 | 83 | 85.2 |
| 2015-01-01_00:36:39 | 83.4 | 85.2 |
| 2015-01-01_00:36:40 | 83.6 | 85.2 |
| 2015-01-01_00:36:41 | 83.4 | 85.2 |
| 2015-01-01_00:36:42 | 83.9 | 85.5 |
| 2015-01-01_00:36:43 | 84.2 | 85.5 |
| 2015-01-01_00:36:44 | 84.1 | 85.5 |
| 2015-01-01_00:36:45 | 84.2 | 85.5 |
| 2015-01-01_00:36:46 | 84.6 | 85.5 |
| 2015-01-01_00:36:47 | 84.1 | 85.5 |
| 2015-01-01_00:36:48 | 84.9 | 85.5 |
| 2015-01-01_00:36:49 | 85 | 85.5 |
| 2015-01-01_00:36:50 | 85.2 | 85.8 |
| 2015-01-01_00:36:51 | 85.2 | 85.8 |
| 2015-01-01_00:36:52 | 85.4 | 85.8 |
| 2015-01-01_00:36:53 | 85.2 | 85.8 |
| 2015-01-01_00:36:54 | 85.5 | 85.8 |
| 2015-01-01_00:36:55 | 85.2 | 85.8 |
| 2015-01-01_00:36:56 | 85.6 | 85.8 |
| 2015-01-01_00:36:57 | 85.6 | 85.8 |
| 2015-01-01_00:36:58 | 85.6 | 85.9 |
| 2015-01-01_00:36:59 | 85.7 | 85.9 |
| 2015-01-01_00:37:00 | 85.2 | 85.9 |
| 2015-01-01_00:37:01 | 86 | 85.9 |
| 2015-01-01_00:37:02 | 86 | 85.9 |
| 2015-01-01_00:37:03 | 86 | 85.9 |
| 2015-01-01_00:37:04 | 85.8 | 85.9 |
| 2015-01-01_00:37:05 | 85.9 | 85.9 |
| 2015-01-01_00:37:06 | 86 | 86 |
| 2015-01-01_00:37:07 | 86.5 | 86 |
| 2015-01-01_00:37:08 | 86.7 | 86 |
| 2015-01-01_00:37:09 | 85.6 | 86 |
| 2015-01-01_00:37:10 | 86.2 | 86 |
| 2015-01-01_00:37:11 | 86.5 | 86 |
| 2015-01-01_00:37:12 | 86 | 86 |
| 2015-01-01_00:37:13 | 85.8 | 86 |
| 2015-01-01_00:37:14 | 86.1 | 86 |
| 2015-01-01_00:37:15 | 86.3 | 86 |
| 2015-01-01_00:37:16 | 86.3 | 86 |
| 2015-01-01_00:37:17 | 86.2 | 86 |
| 2015-01-01_00:37:18 | 86.2 | 86 |
| 2015-01-01_00:37:19 | 86.3 | 86 |
| 2015-01-01_00:37:20 | 86.3 | 86 |
| 2015-01-01_00:37:21 | 86.5 | 86 |
| 2015-01-01_00:37:22 | 86.5 | 86.3 |
| 2015-01-01_00:37:23 | 86.3 | 86.3 |
| 2015-01-01_00:37:24 | 86.6 | 86.3 |
| 2015-01-01_00:37:25 | 86.7 | 86.3 |
| 2015-01-01_00:37:26 | 86.7 | 86.3 |
| 2015-01-01_00:37:27 | 86.7 | 86.3 |
| 2015-01-01_00:37:28 | 86.6 | 86.3 |
| 2015-01-01_00:37:29 | 86.6 | 86.3 |
| 2015-01-01_00:37:30 | 86.5 | 86.3 |
| 2015-01-01_00:37:31 | 86.5 | 86.3 |
| 2015-01-01_00:37:32 | 86.3 | 86.3 |
| 2015-01-01_00:37:33 | 85.9 | 86.3 |
| 2015-01-01_00:37:34 | 86.5 | 86.3 |
| 2015-01-01_00:37:35 | 86.1 | 86.3 |
| 2015-01-01_00:37:36 | 85.8 | 86.3 |
| 2015-01-01_00:37:37 | 86.1 | 86.3 |
| 2015-01-01_00:37:38 | 85.8 | 86.3 |
| 2015-01-01_00:37:39 | 86.1 | 86.3 |
| 2015-01-01_00:37:40 | 86 | 86.3 |
| 2015-01-01_00:37:41 | 86.3 | 86.3 |
| 2015-01-01_00:37:42 | 86 | 86.3 |
| 2015-01-01_00:37:43 | 86.3 | 86.3 |
| 2015-01-01_00:37:44 | 86 | 86.3 |
| 2015-01-01_00:37:45 | 86.1 | 86.3 |
| 2015-01-01_00:37:46 | 86 | 86.3 |
| 2015-01-01_00:37:47 | 86.3 | 86.3 |
| 2015-01-01_00:37:48 | 86.2 | 86.3 |
| 2015-01-01_00:37:49 | 86.5 | 86.3 |
| 2015-01-01_00:37:50 | 86.4 | 86.3 |
| 2015-01-01_00:37:51 | 86.6 | 86.3 |
| 2015-01-01_00:37:52 | 86.7 | 86.3 |
| 2015-01-01_00:37:53 | 86.8 | 86.3 |
| 2015-01-01_00:37:54 | 86.7 | 86.3 |
| 2015-01-01_00:37:55 | 86.9 | 86.3 |
| 2015-01-01_00:37:56 | 87 | 86.3 |
| 2015-01-01_00:37:57 | 87.3 | 86.3 |
| 2015-01-01_00:37:58 | 87.1 | 86.3 |
| 2015-01-01_00:37:59 | 87.4 | 86.3 |
| 2015-01-01_00:38:00 | 87.4 | 86.3 |
| 2015-01-01_00:38:01 | 87 | 86.3 |
| 2015-01-01_00:38:02 | 87 | 86.3 |
| 2015-01-01_00:38:03 | 87.3 | 86.3 |
| 2015-01-01_00:38:04 | 87.1 | 86.3 |
| 2015-01-01_00:38:05 | 87.1 | 86.3 |
| 2015-01-01_00:38:06 | 87.6 | 86.3 |
| 2015-01-01_00:38:07 | 87.5 | 86.3 |
| 2015-01-01_00:38:08 | 87.7 | 86.3 |
| 2015-01-01_00:38:09 | 87.5 | 86.3 |
| 2015-01-01_00:38:10 | 87.4 | 86.3 |
| 2015-01-01_00:38:11 | 87.3 | 86.3 |
| 2015-01-01_00:38:12 | 87 | 86.3 |
| 2015-01-01_00:38:13 | 87 | 86.3 |
| 2015-01-01_00:38:14 | 86.7 | 86.3 |
| 2015-01-01_00:38:15 | 86.8 | 86.3 |
| 2015-01-01_00:38:16 | 86.9 | 86.3 |
| 2015-01-01_00:38:17 | 86.7 | 86.3 |
| 2015-01-01_00:38:18 | 86.7 | 86.3 |
| 2015-01-01_00:38:19 | 86.8 | 86.3 |
| 2015-01-01_00:38:20 | 86.7 | 86.3 |
| 2015-01-01_00:38:21 | 86.5 | 86.3 |
| 2015-01-01_00:38:22 | 86.6 | 86.3 |
| 2015-01-01_00:38:23 | 86.5 | 86.3 |
| 2015-01-01_00:38:24 | 86.1 | 86.3 |
| 2015-01-01_00:38:25 | 86 | 86.3 |
| 2015-01-01_00:38:26 | 86.5 | 86.3 |
| 2015-01-01_00:38:27 | 86.3 | 86.3 |
| 2015-01-01_00:38:28 | 86 | 86.3 |
| 2015-01-01_00:38:29 | 86.2 | 86.3 |
| 2015-01-01_00:38:30 | 86.4 | 86.3 |
| 2015-01-01_00:38:31 | 86.3 | 86.3 |
| 2015-01-01_00:38:32 | 86.3 | 86.3 |
| 2015-01-01_00:38:33 | 86.3 | 86.3 |
| 2015-01-01_00:38:34 | 86 | 86.4 |
| 2015-01-01_00:38:35 | 85.8 | 86.4 |
| 2015-01-01_00:38:36 | 85.7 | 86.4 |
| 2015-01-01_00:38:37 | 85.6 | 86.4 |
| 2015-01-01_00:38:38 | 85.8 | 86.4 |
| 2015-01-01_00:38:39 | 85.7 | 86.4 |
| 2015-01-01_00:38:40 | 85.5 | 86.4 |
| 2015-01-01_00:38:41 | 85.6 | 86.4 |
| 2015-01-01_00:38:42 | 86.1 | 86.5 |
| 2015-01-01_00:38:43 | 86.5 | 86.5 |
| 2015-01-01_00:38:44 | 87.2 | 86.5 |
| 2015-01-01_00:38:45 | 87.6 | 86.5 |
| 2015-01-01_00:38:46 | 87.8 | 86.5 |
| 2015-01-01_00:38:47 | 87.9 | 86.5 |
| 2015-01-01_00:38:48 | 88.1 | 86.5 |
| 2015-01-01_00:38:49 | 87.8 | 86.5 |
| 2015-01-01_00:38:50 | 87.7 | 86.5 |
| 2015-01-01_00:38:51 | 87.6 | 86.5 |
| 2015-01-01_00:38:52 | 88.2 | 86.5 |
| 2015-01-01_00:38:53 | 87.9 | 86.5 |
| 2015-01-01_00:38:54 | 88.1 | 86.5 |
| 2015-01-01_00:38:55 | 88.6 | 86.5 |
| 2015-01-01_00:38:56 | 88.7 | 86.5 |
| 2015-01-01_00:38:57 | 88.6 | 86.5 |
| 2015-01-01_00:38:58 | 88.3 | 86.3 |
| 2015-01-01_00:38:59 | 88.1 | 86.3 |
| 2015-01-01_00:39:00 | 88 | 86.3 |
| 2015-01-01_00:39:01 | 87.9 | 86.3 |
| 2015-01-01_00:39:02 | 88.1 | 86.3 |
| 2015-01-01_00:39:03 | 88.1 | 86.3 |
| 2015-01-01_00:39:04 | 88.1 | 86.3 |
| 2015-01-01_00:39:05 | 87.8 | 86.3 |
| 2015-01-01_00:39:06 | 87.7 | 86.2 |
| 2015-01-01_00:39:07 | 87.7 | 86.2 |
| 2015-01-01_00:39:08 | 87.3 | 86.2 |
| 2015-01-01_00:39:09 | 86.9 | 86.2 |
| 2015-01-01_00:39:10 | 87 | 86.2 |
| 2015-01-01_00:39:11 | 87.1 | 86.2 |
| 2015-01-01_00:39:12 | 86.9 | 86.2 |
| 2015-01-01_00:39:13 | 86.6 | 86.2 |
| 2015-01-01_00:39:14 | 87 | 86.2 |
| 2015-01-01_00:39:15 | 86.9 | 86.2 |
| 2015-01-01_00:39:16 | 87.1 | 86.2 |
| 2015-01-01_00:39:17 | 87.1 | 86.2 |
| 2015-01-01_00:39:18 | 87.2 | 86.2 |
| 2015-01-01_00:39:19 | 87.3 | 86.2 |
| 2015-01-01_00:39:20 | 87.5 | 86.2 |
| 2015-01-01_00:39:21 | 87.8 | 86.2 |
| 2015-01-01_00:39:22 | 87.8 | 86.5 |
| 2015-01-01_00:39:23 | 87.4 | 86.5 |
| 2015-01-01_00:39:24 | 87.4 | 86.5 |
| 2015-01-01_00:39:25 | 87.8 | 86.5 |
| 2015-01-01_00:39:26 | 88 | 86.5 |
| 2015-01-01_00:39:27 | 88.2 | 86.5 |
| 2015-01-01_00:39:28 | 87.9 | 86.5 |
| 2015-01-01_00:39:29 | 88 | 86.5 |
| 2015-01-01_00:39:30 | 88.1 | 86.6 |
| 2015-01-01_00:39:31 | 87.8 | 86.6 |
| 2015-01-01_00:39:32 | 87.8 | 86.6 |
| 2015-01-01_00:39:33 | 87.5 | 86.6 |
| 2015-01-01_00:39:34 | 87.1 | 86.6 |
| 2015-01-01_00:39:35 | 86.7 | 86.6 |
| 2015-01-01_00:39:36 | 86.4 | 86.6 |
| 2015-01-01_00:39:37 | 86.4 | 86.6 |
| 2015-01-01_00:39:38 | 86.5 | 86.6 |
| 2015-01-01_00:39:39 | 86.3 | 86.6 |
| 2015-01-01_00:39:40 | 86.1 | 86.6 |
| 2015-01-01_00:39:41 | 86 | 86.6 |
| 2015-01-01_00:39:42 | 86.1 | 86.6 |
| 2015-01-01_00:39:43 | 86 | 86.6 |
| 2015-01-01_00:39:44 | 85.8 | 86.6 |
| 2015-01-01_00:39:45 | 85.7 | 86.6 |
| 2015-01-01_00:39:46 | 85.6 | 86.7 |
| 2015-01-01_00:39:47 | 86 | 86.7 |
| 2015-01-01_00:39:48 | 85.9 | 86.7 |
| 2015-01-01_00:39:49 | 86 | 86.7 |
| 2015-01-01_00:39:50 | 86.3 | 86.7 |
| 2015-01-01_00:39:51 | 86.3 | 86.7 |
| 2015-01-01_00:39:52 | 86.7 | 86.7 |
| 2015-01-01_00:39:53 | 86.8 | 86.7 |
| 2015-01-01_00:39:54 | 87.4 | 86.8 |
| 2015-01-01_00:39:55 | 87.1 | 86.8 |
| 2015-01-01_00:39:56 | 87.2 | 86.8 |
| 2015-01-01_00:39:57 | 87.2 | 86.8 |
| 2015-01-01_00:39:58 | 87.1 | 86.8 |
| 2015-01-01_00:39:59 | 86.9 | 86.8 |
| 2015-01-01_00:40:00 | 87.2 | 86.8 |
| 2015-01-01_00:40:01 | 87.2 | 86.8 |
| 2015-01-01_00:40:02 | 87.3 | 86.7 |
| 2015-01-01_00:40:03 | 87.4 | 86.7 |
| 2015-01-01_00:40:04 | 87.8 | 86.7 |
| 2015-01-01_00:40:05 | 87.8 | 86.7 |
| 2015-01-01_00:40:06 | 87.8 | 86.7 |
| 2015-01-01_00:40:07 | 86.9 | 86.7 |
| 2015-01-01_00:40:08 | 87.4 | 86.7 |
| 2015-01-01_00:40:09 | 87.2 | 86.7 |
| 2015-01-01_00:40:10 | 87.1 | 86.8 |
| 2015-01-01_00:40:11 | 87.7 | 86.8 |
| 2015-01-01_00:40:12 | 87.6 | 86.8 |
| 2015-01-01_00:40:13 | 87.6 | 86.8 |
| 2015-01-01_00:40:14 | 87.7 | 86.8 |
| 2015-01-01_00:40:15 | 87.7 | 86.8 |
| 2015-01-01_00:40:16 | 88 | 86.8 |
| 2015-01-01_00:40:17 | 87.7 | 86.8 |
| 2015-01-01_00:40:18 | 87.6 | 86.9 |
| 2015-01-01_00:40:19 | 87.8 | 86.9 |
| 2015-01-01_00:40:20 | 87.4 | 86.9 |
| 2015-01-01_00:40:21 | 87.3 | 86.9 |
| 2015-01-01_00:40:22 | 87.2 | 86.9 |
| 2015-01-01_00:40:23 | 86.8 | 86.9 |
| 2015-01-01_00:40:24 | 87.4 | 86.9 |
| 2015-01-01_00:40:25 | 87 | 86.9 |
| 2015-01-01_00:40:26 | 86.5 | 87 |
| 2015-01-01_00:40:27 | 86.7 | 87 |
| 2015-01-01_00:40:28 | 86 | 87 |
| 2015-01-01_00:40:29 | 86 | 87 |
| 2015-01-01_00:40:30 | 86.5 | 87 |
| 2015-01-01_00:40:31 | 86.6 | 87 |
| 2015-01-01_00:40:32 | 86.4 | 87 |
| 2015-01-01_00:40:33 | 86.3 | 87 |
| 2015-01-01_00:40:34 | 86.1 | 87.1 |
| 2015-01-01_00:40:35 | 85.7 | 87.1 |
| 2015-01-01_00:40:36 | 85.8 | 87.1 |
| 2015-01-01_00:40:37 | 86 | 87.1 |
| 2015-01-01_00:40:38 | 85.8 | 87.1 |
| 2015-01-01_00:40:39 | 86.1 | 87.1 |
| 2015-01-01_00:40:40 | 86.2 | 87.1 |
| 2015-01-01_00:40:41 | 86.3 | 87.1 |
| 2015-01-01_00:40:42 | 86.4 | 87.2 |
| 2015-01-01_00:40:43 | 86.4 | 87.2 |
| 2015-01-01_00:40:44 | 86.2 | 87.2 |
| 2015-01-01_00:40:45 | 85.7 | 87.2 |
| 2015-01-01_00:40:46 | 85.8 | 87.2 |
| 2015-01-01_00:40:47 | 85.6 | 87.2 |
| 2015-01-01_00:40:48 | 85.7 | 87.2 |
| 2015-01-01_00:40:49 | 85.4 | 87.2 |
| 2015-01-01_00:40:50 | 85.9 | 87.3 |
| 2015-01-01_00:40:51 | 85.9 | 87.3 |
| 2015-01-01_00:40:52 | 85.9 | 87.3 |
| 2015-01-01_00:40:53 | 85.7 | 87.3 |
| 2015-01-01_00:40:54 | 85.7 | 87.3 |
| 2015-01-01_00:40:55 | 85.5 | 87.3 |
| 2015-01-01_00:40:56 | 85.3 | 87.3 |
| 2015-01-01_00:40:57 | 85.3 | 87.3 |
| 2015-01-01_00:40:58 | 85.3 | 87.4 |
| 2015-01-01_00:40:59 | 84.9 | 87.4 |
| 2015-01-01_00:41:00 | 85.1 | 87.4 |
| 2015-01-01_00:41:01 | 85.1 | 87.4 |
| 2015-01-01_00:41:02 | 84.4 | 87.4 |
| 2015-01-01_00:41:03 | 84.7 | 87.4 |
| 2015-01-01_00:41:04 | 84.7 | 87.4 |
| 2015-01-01_00:41:05 | 84.5 | 87.4 |
| 2015-01-01_00:41:06 | 84.6 | 87.5 |
| 2015-01-01_00:41:07 | 84.8 | 87.5 |
| 2015-01-01_00:41:08 | 84.6 | 87.5 |
| 2015-01-01_00:41:09 | 84.3 | 87.5 |
| 2015-01-01_00:41:10 | 84.6 | 87.5 |
| 2015-01-01_00:41:11 | 84.5 | 87.5 |
| 2015-01-01_00:41:12 | 84.3 | 87.5 |
| 2015-01-01_00:41:13 | 84.5 | 87.5 |
| 2015-01-01_00:41:14 | 84.2 | 87.6 |
| 2015-01-01_00:41:15 | 84.3 | 87.6 |
| 2015-01-01_00:41:16 | 84.5 | 87.6 |
| 2015-01-01_00:41:17 | 84.6 | 87.6 |
| 2015-01-01_00:41:18 | 84.9 | 87.6 |
| 2015-01-01_00:41:19 | 84.9 | 87.6 |
| 2015-01-01_00:41:20 | 85 | 87.6 |
| 2015-01-01_00:41:21 | 85.2 | 87.6 |
| 2015-01-01_00:41:22 | 85.6 | 87.6 |
| 2015-01-01_00:41:23 | 85.5 | 87.6 |
| 2015-01-01_00:41:24 | 85.8 | 87.6 |
| 2015-01-01_00:41:25 | 85.5 | 87.6 |
| 2015-01-01_00:41:26 | 85.6 | 87.6 |
| 2015-01-01_00:41:27 | 85.6 | 87.6 |
| 2015-01-01_00:41:28 | 85.4 | 87.6 |
| 2015-01-01_00:41:29 | 85.3 | 87.6 |
| 2015-01-01_00:41:30 | 85.9 | 87.3 |
| 2015-01-01_00:41:31 | 85.9 | 87.3 |
| 2015-01-01_00:41:32 | 85.6 | 87.3 |
| 2015-01-01_00:41:33 | 85.1 | 87.3 |
| 2015-01-01_00:41:34 | 85.3 | 87.3 |
| 2015-01-01_00:41:35 | 85.3 | 87.3 |
| 2015-01-01_00:41:36 | 85.3 | 87.3 |
| 2015-01-01_00:41:37 | 85.2 | 87.3 |
| 2015-01-01_00:41:38 | 85.2 | 87.3 |
| 2015-01-01_00:41:39 | 85.3 | 87.3 |
| 2015-01-01_00:41:40 | 85.5 | 87.3 |
| 2015-01-01_00:41:41 | 85.9 | 87.3 |
| 2015-01-01_00:41:42 | 85.5 | 87.3 |
| 2015-01-01_00:41:43 | 85.9 | 87.3 |
| 2015-01-01_00:41:44 | 85.8 | 87.3 |
| 2015-01-01_00:41:45 | 85.5 | 87.3 |
| 2015-01-01_00:41:46 | 86.3 | 87.1 |
| 2015-01-01_00:41:47 | 85.4 | 87.1 |
| 2015-01-01_00:41:48 | 85.7 | 87.1 |
| 2015-01-01_00:41:49 | 86.5 | 87.1 |
| 2015-01-01_00:41:50 | 86.4 | 87.1 |
| 2015-01-01_00:41:51 | 86.7 | 87.1 |
| 2015-01-01_00:41:52 | 86.7 | 87.1 |
| 2015-01-01_00:41:53 | 86.7 | 87.1 |
| 2015-01-01_00:41:54 | 87.8 | 87 |
| 2015-01-01_00:41:55 | 88.7 | 87 |
| 2015-01-01_00:41:56 | 88.7 | 87 |
| 2015-01-01_00:41:57 | 89.1 | 87 |
| 2015-01-01_00:41:58 | 89 | 87 |
| 2015-01-01_00:41:59 | 90 | 87 |
| 2015-01-01_00:42:00 | 89.9 | 87 |
| 2015-01-01_00:42:01 | 90 | 87 |
| 2015-01-01_00:42:02 | 89.9 | 86.8 |
| 2015-01-01_00:42:03 | 89.7 | 86.8 |
| 2015-01-01_00:42:04 | 89.6 | 86.8 |
| 2015-01-01_00:42:05 | 89.4 | 86.8 |
| 2015-01-01_00:42:06 | 89.2 | 86.8 |
| 2015-01-01_00:42:07 | 89.1 | 86.8 |
| 2015-01-01_00:42:08 | 88.8 | 86.8 |
| 2015-01-01_00:42:09 | 88.6 | 86.8 |
| 2015-01-01_00:42:10 | 88.4 | 86.8 |
| 2015-01-01_00:42:11 | 87.4 | 86.8 |
| 2015-01-01_00:42:12 | 87.5 | 86.8 |
| 2015-01-01_00:42:13 | 87.4 | 86.8 |
| 2015-01-01_00:42:14 | 87.5 | 86.8 |
| 2015-01-01_00:42:15 | 87.4 | 86.8 |
| 2015-01-01_00:42:16 | 86.8 | 86.8 |
| 2015-01-01_00:42:17 | 86.9 | 86.8 |
| 2015-01-01_00:42:18 | 87.1 | 86.5 |
| 2015-01-01_00:42:19 | 86.9 | 86.5 |
| 2015-01-01_00:42:20 | 87.3 | 86.5 |
| 2015-01-01_00:42:21 | 87 | 86.5 |
| 2015-01-01_00:42:22 | 87.7 | 86.5 |
| 2015-01-01_00:42:23 | 87.2 | 86.5 |
| 2015-01-01_00:42:24 | 87.3 | 86.5 |
| 2015-01-01_00:42:25 | 87.7 | 86.5 |
| 2015-01-01_00:42:26 | 87.5 | 86.5 |
| 2015-01-01_00:42:27 | 87.4 | 86.5 |
| 2015-01-01_00:42:28 | 87.1 | 86.5 |
| 2015-01-01_00:42:29 | 87 | 86.5 |
| 2015-01-01_00:42:30 | 87 | 86.5 |
| 2015-01-01_00:42:31 | 87.1 | 86.5 |
| 2015-01-01_00:42:32 | 86.4 | 86.5 |
| 2015-01-01_00:42:33 | 86.9 | 86.5 |
| 2015-01-01_00:42:34 | 86.9 | 86.3 |
| 2015-01-01_00:42:35 | 86.7 | 86.3 |
| 2015-01-01_00:42:36 | 86.9 | 86.3 |
| 2015-01-01_00:42:37 | 87.4 | 86.3 |
| 2015-01-01_00:42:38 | 87.2 | 86.3 |
| 2015-01-01_00:42:39 | 87 | 86.3 |
| 2015-01-01_00:42:40 | 86.7 | 86.3 |
| 2015-01-01_00:42:41 | 86.6 | 86.3 |
| 2015-01-01_00:42:42 | 86.7 | 86.2 |
| 2015-01-01_00:42:43 | 87.1 | 86.2 |
| 2015-01-01_00:42:44 | 87.1 | 86.2 |
| 2015-01-01_00:42:45 | 86.8 | 86.2 |
| 2015-01-01_00:42:46 | 86.8 | 86.2 |
| 2015-01-01_00:42:47 | 87 | 86.2 |
| 2015-01-01_00:42:48 | 86.9 | 86.2 |
| 2015-01-01_00:42:49 | 86.7 | 86.2 |
| 2015-01-01_00:42:50 | 87.1 | 86.2 |
| 2015-01-01_00:42:51 | 86.8 | 86.2 |
| 2015-01-01_00:42:52 | 86.8 | 86.2 |
| 2015-01-01_00:42:53 | 86.9 | 86.2 |
| 2015-01-01_00:42:54 | 86.9 | 86.2 |
| 2015-01-01_00:42:55 | 87.1 | 86.2 |
| 2015-01-01_00:42:56 | 86.8 | 86.2 |
| 2015-01-01_00:42:57 | 86.9 | 86.2 |
| 2015-01-01_00:42:58 | 87.1 | 85.8 |
| 2015-01-01_00:42:59 | 87 | 85.8 |
| 2015-01-01_00:43:00 | 86.7 | 85.8 |
| 2015-01-01_00:43:01 | 87 | 85.8 |
| 2015-01-01_00:43:02 | 87.2 | 85.8 |
| 2015-01-01_00:43:03 | 87.2 | 85.8 |
| 2015-01-01_00:43:04 | 87.1 | 85.8 |
| 2015-01-01_00:43:05 | 87.1 | 85.8 |
| 2015-01-01_00:43:06 | 87.6 | 85.7 |
| 2015-01-01_00:43:07 | 87.3 | 85.7 |
| 2015-01-01_00:43:08 | 87.3 | 85.7 |
| 2015-01-01_00:43:09 | 87.5 | 85.7 |
| 2015-01-01_00:43:10 | 87.2 | 85.7 |
| 2015-01-01_00:43:11 | 87.3 | 85.7 |
| 2015-01-01_00:43:12 | 87.6 | 85.7 |
| 2015-01-01_00:43:13 | 87.6 | 85.7 |
| 2015-01-01_00:43:14 | 87.3 | 85.6 |
| 2015-01-01_00:43:15 | 87.7 | 85.6 |
| 2015-01-01_00:43:16 | 87.4 | 85.6 |
| 2015-01-01_00:43:17 | 87.6 | 85.6 |
| 2015-01-01_00:43:18 | 87.5 | 85.6 |
| 2015-01-01_00:43:19 | 87.8 | 85.6 |
| 2015-01-01_00:43:20 | 88 | 85.6 |
| 2015-01-01_00:43:21 | 87.7 | 85.6 |
| 2015-01-01_00:43:22 | 87.4 | 85.6 |
| 2015-01-01_00:43:23 | 87.8 | 85.6 |
| 2015-01-01_00:43:24 | 88 | 85.6 |
| 2015-01-01_00:43:25 | 88 | 85.6 |
| 2015-01-01_00:43:26 | 87.1 | 85.6 |
| 2015-01-01_00:43:27 | 87.8 | 85.6 |
| 2015-01-01_00:43:28 | 87.6 | 85.6 |
| 2015-01-01_00:43:29 | 87.6 | 85.6 |
| 2015-01-01_00:43:30 | 86.9 | 85.7 |
| 2015-01-01_00:43:31 | 87.2 | 85.7 |
| 2015-01-01_00:43:32 | 87.2 | 85.7 |
| 2015-01-01_00:43:33 | 87 | 85.7 |
| 2015-01-01_00:43:34 | 87 | 85.7 |
| 2015-01-01_00:43:35 | 87.4 | 85.7 |
| 2015-01-01_00:43:36 | 87.3 | 85.7 |
| 2015-01-01_00:43:37 | 86.8 | 85.7 |
| 2015-01-01_00:43:38 | 86.8 | 85.7 |
| 2015-01-01_00:43:39 | 87.2 | 85.7 |
| 2015-01-01_00:43:40 | 87 | 85.7 |
| 2015-01-01_00:43:41 | 86.9 | 85.7 |
| 2015-01-01_00:43:42 | 87.3 | 85.7 |
| 2015-01-01_00:43:43 | 87.2 | 85.7 |
| 2015-01-01_00:43:44 | 87.3 | 85.7 |
| 2015-01-01_00:43:45 | 87.1 | 85.7 |
| 2015-01-01_00:43:46 | 87.1 | 85.7 |
| 2015-01-01_00:43:47 | 86.6 | 85.7 |
| 2015-01-01_00:43:48 | 87.2 | 85.7 |
| 2015-01-01_00:43:49 | 86.8 | 85.7 |
| 2015-01-01_00:43:50 | 86.7 | 85.7 |
| 2015-01-01_00:43:51 | 86.7 | 85.7 |
| 2015-01-01_00:43:52 | 86.8 | 85.7 |
| 2015-01-01_00:43:53 | 86.7 | 85.7 |
| 2015-01-01_00:43:54 | 86.9 | 85.6 |
| 2015-01-01_00:43:55 | 86.5 | 85.6 |
| 2015-01-01_00:43:56 | 86.5 | 85.6 |
| 2015-01-01_00:43:57 | 86.6 | 85.6 |
| 2015-01-01_00:43:58 | 86.7 | 85.6 |
| 2015-01-01_00:43:59 | 87.1 | 85.6 |
| 2015-01-01_00:44:00 | 86.7 | 85.6 |
| 2015-01-01_00:44:01 | 87.2 | 85.6 |
| 2015-01-01_00:44:02 | 87.1 | 85.5 |
| 2015-01-01_00:44:03 | 86.8 | 85.5 |
| 2015-01-01_00:44:04 | 87.2 | 85.5 |
| 2015-01-01_00:44:05 | 86.6 | 85.5 |
| 2015-01-01_00:44:06 | 87.4 | 85.5 |
| 2015-01-01_00:44:07 | 87 | 85.5 |
| 2015-01-01_00:44:08 | 87 | 85.5 |
| 2015-01-01_00:44:09 | 86.9 | 85.5 |
| 2015-01-01_00:44:10 | 86.9 | 85.4 |
| 2015-01-01_00:44:11 | 86.9 | 85.4 |
| 2015-01-01_00:44:12 | 87.3 | 85.4 |
| 2015-01-01_00:44:13 | 87 | 85.4 |
| 2015-01-01_00:44:14 | 87.2 | 85.4 |
| 2015-01-01_00:44:15 | 87 | 85.4 |
| 2015-01-01_00:44:16 | 87.2 | 85.4 |
| 2015-01-01_00:44:17 | 87.2 | 85.4 |
| 2015-01-01_00:44:18 | 87.2 | 85.3 |
| 2015-01-01_00:44:19 | 87.5 | 85.3 |
| 2015-01-01_00:44:20 | 87.4 | 85.3 |
| 2015-01-01_00:44:21 | 87.2 | 85.3 |
| 2015-01-01_00:44:22 | 87.1 | 85.3 |
| 2015-01-01_00:44:23 | 87 | 85.3 |
| 2015-01-01_00:44:24 | 86.8 | 85.3 |
| 2015-01-01_00:44:25 | 86.6 | 85.3 |
| 2015-01-01_00:44:26 | 86.4 | 85.3 |
| 2015-01-01_00:44:27 | 86.2 | 85.3 |
| 2015-01-01_00:44:28 | 86 | 85.3 |
| 2015-01-01_00:44:29 | 86 | 85.3 |
| 2015-01-01_00:44:30 | 85.8 | 85.3 |
| 2015-01-01_00:44:31 | 85.6 | 85.3 |
| 2015-01-01_00:44:32 | 85.3 | 85.3 |
| 2015-01-01_00:44:33 | 85.2 | 85.3 |
| 2015-01-01_00:44:34 | 85.1 | 85.2 |
| 2015-01-01_00:44:35 | 85 | 85.2 |
| 2015-01-01_00:44:36 | 84.8 | 85.2 |
| 2015-01-01_00:44:37 | 84.7 | 85.2 |
| 2015-01-01_00:44:38 | 84.6 | 85.2 |
| 2015-01-01_00:44:39 | 84.4 | 85.2 |
| 2015-01-01_00:44:40 | 84.3 | 85.2 |
| 2015-01-01_00:44:41 | 84.1 | 85.2 |
| 2015-01-01_00:44:42 | 84.1 | 85.1 |
| 2015-01-01_00:44:43 | 84 | 85.1 |
| 2015-01-01_00:44:44 | 83.7 | 85.1 |
| 2015-01-01_00:44:45 | 83.6 | 85.1 |
| 2015-01-01_00:44:46 | 83.7 | 85.1 |
| 2015-01-01_00:44:47 | 83.4 | 85.1 |
| 2015-01-01_00:44:48 | 83.3 | 85.1 |
| 2015-01-01_00:44:49 | 83.3 | 85.1 |
| 2015-01-01_00:44:50 | 83.2 | 85 |
| 2015-01-01_00:44:51 | 83 | 85 |
| 2015-01-01_00:44:52 | 83.1 | 85 |
| 2015-01-01_00:44:53 | 82.7 | 85 |
| 2015-01-01_00:44:54 | 82.7 | 85 |
| 2015-01-01_00:44:55 | 82.7 | 85 |
| 2015-01-01_00:44:56 | 82.7 | 85 |
| 2015-01-01_00:44:57 | 82.2 | 85 |
| 2015-01-01_00:44:58 | 81.9 | 84.9 |
| 2015-01-01_00:44:59 | 81.9 | 84.9 |
| 2015-01-01_00:45:00 | 81.7 | 84.9 |
| 2015-01-01_00:45:01 | 81.4 | 84.9 |
| 2015-01-01_00:45:02 | 81.8 | 84.9 |
| 2015-01-01_00:45:03 | 81.7 | 84.9 |
| 2015-01-01_00:45:04 | 81.8 | 84.9 |
| 2015-01-01_00:45:05 | 81.9 | 84.9 |
| 2015-01-01_00:45:06 | 82.1 | 84.8 |
| 2015-01-01_00:45:07 | 82.4 | 84.8 |
| 2015-01-01_00:45:08 | 82.4 | 84.8 |
| 2015-01-01_00:45:09 | 82.6 | 84.8 |
| 2015-01-01_00:45:10 | 83 | 84.8 |
| 2015-01-01_00:45:11 | 82.7 | 84.8 |
| 2015-01-01_00:45:12 | 82.9 | 84.8 |
| 2015-01-01_00:45:13 | 83.2 | 84.8 |
| 2015-01-01_00:45:14 | 83.3 | 84.8 |
| 2015-01-01_00:45:15 | 83.7 | 84.8 |
| 2015-01-01_00:45:16 | 84 | 84.8 |
| 2015-01-01_00:45:17 | 84.2 | 84.8 |
| 2015-01-01_00:45:18 | 84.5 | 84.8 |
| 2015-01-01_00:45:19 | 84.3 | 84.8 |
| 2015-01-01_00:45:20 | 84.9 | 84.8 |
| 2015-01-01_00:45:21 | 84.9 | 84.8 |
| 2015-01-01_00:45:22 | 84.8 | 84.8 |
| 2015-01-01_00:45:23 | 85 | 84.8 |
| 2015-01-01_00:45:24 | 85.2 | 84.8 |
| 2015-01-01_00:45:25 | 85.6 | 84.8 |
| 2015-01-01_00:45:26 | 85.3 | 84.8 |
| 2015-01-01_00:45:27 | 85.6 | 84.8 |
| 2015-01-01_00:45:28 | 85.8 | 84.8 |
| 2015-01-01_00:45:29 | 86 | 84.8 |
| 2015-01-01_00:45:30 | 86.3 | 84.8 |
| 2015-01-01_00:45:31 | 86.2 | 84.8 |
| 2015-01-01_00:45:32 | 86.6 | 84.8 |
| 2015-01-01_00:45:33 | 86.6 | 84.8 |
| 2015-01-01_00:45:34 | 86.8 | 84.8 |
| 2015-01-01_00:45:35 | 87 | 84.8 |
| 2015-01-01_00:45:36 | 86.9 | 84.8 |
| 2015-01-01_00:45:37 | 87 | 84.8 |
| 2015-01-01_00:45:38 | 87.5 | 84.8 |
| 2015-01-01_00:45:39 | 87.3 | 84.8 |
| 2015-01-01_00:45:40 | 87.4 | 84.8 |
| 2015-01-01_00:45:41 | 87.4 | 84.8 |
| 2015-01-01_00:45:42 | 87.4 | 84.8 |
| 2015-01-01_00:45:43 | 87.8 | 84.8 |
| 2015-01-01_00:45:44 | 87.8 | 84.8 |
| 2015-01-01_00:45:45 | 87.6 | 84.8 |
| 2015-01-01_00:45:46 | 87.8 | 84.8 |
| 2015-01-01_00:45:47 | 87.8 | 84.8 |
| 2015-01-01_00:45:48 | 87.5 | 84.8 |
| 2015-01-01_00:45:49 | 88.3 | 84.8 |
| 2015-01-01_00:45:50 | 87.9 | 84.8 |
| 2015-01-01_00:45:51 | 88.1 | 84.8 |
| 2015-01-01_00:45:52 | 88 | 84.8 |
| 2015-01-01_00:45:53 | 87.7 | 84.8 |
| 2015-01-01_00:45:54 | 87.9 | 84.9 |
| 2015-01-01_00:45:55 | 88 | 84.9 |
| 2015-01-01_00:45:56 | 88.1 | 84.9 |
| 2015-01-01_00:45:57 | 87.7 | 84.9 |
| 2015-01-01_00:45:58 | 87.6 | 84.9 |
| 2015-01-01_00:45:59 | 87.6 | 84.9 |
| 2015-01-01_00:46:00 | 87.5 | 84.9 |
| 2015-01-01_00:46:01 | 87.7 | 84.9 |
| 2015-01-01_00:46:02 | 87.7 | 85 |
| 2015-01-01_00:46:03 | 87.6 | 85 |
| 2015-01-01_00:46:04 | 87.6 | 85 |
| 2015-01-01_00:46:05 | 87.6 | 85 |
| 2015-01-01_00:46:06 | 87.4 | 85 |
| 2015-01-01_00:46:07 | 87.1 | 85 |
| 2015-01-01_00:46:08 | 86.8 | 85 |
| 2015-01-01_00:46:09 | 86.5 | 85 |
| 2015-01-01_00:46:10 | 86.7 | 84.9 |
| 2015-01-01_00:46:11 | 85.8 | 84.9 |
| 2015-01-01_00:46:12 | 86.3 | 84.9 |
| 2015-01-01_00:46:13 | 86 | 84.9 |
| 2015-01-01_00:46:14 | 86 | 84.9 |
| 2015-01-01_00:46:15 | 86.4 | 84.9 |
| 2015-01-01_00:46:16 | 86.3 | 84.9 |
| 2015-01-01_00:46:17 | 86.2 | 84.9 |
| 2015-01-01_00:46:18 | 86.5 | 85 |
| 2015-01-01_00:46:19 | 86.6 | 85 |
| 2015-01-01_00:46:20 | 86.7 | 85 |
| 2015-01-01_00:46:21 | 86.8 | 85 |
| 2015-01-01_00:46:22 | 86.9 | 85 |
| 2015-01-01_00:46:23 | 87 | 85 |
| 2015-01-01_00:46:24 | 87.1 | 85 |
| 2015-01-01_00:46:25 | 87.1 | 85 |
| 2015-01-01_00:46:26 | 87.1 | 84.8 |
| 2015-01-01_00:46:27 | 87.7 | 84.8 |
| 2015-01-01_00:46:28 | 87.6 | 84.8 |
| 2015-01-01_00:46:29 | 87.5 | 84.8 |
| 2015-01-01_00:46:30 | 87.6 | 84.8 |
| 2015-01-01_00:46:31 | 88.1 | 84.8 |
| 2015-01-01_00:46:32 | 87.6 | 84.8 |
| 2015-01-01_00:46:33 | 87.8 | 84.8 |
| 2015-01-01_00:46:34 | 87.3 | 84.6 |
| 2015-01-01_00:46:35 | 87.4 | 84.6 |
| 2015-01-01_00:46:36 | 87.5 | 84.6 |
| 2015-01-01_00:46:37 | 87.2 | 84.6 |
| 2015-01-01_00:46:38 | 87.4 | 84.6 |
| 2015-01-01_00:46:39 | 87.5 | 84.6 |
| 2015-01-01_00:46:40 | 87.7 | 84.6 |
| 2015-01-01_00:46:41 | 87.9 | 84.6 |
| 2015-01-01_00:46:42 | 87.9 | 84.5 |
| 2015-01-01_00:46:43 | 88 | 84.5 |
| 2015-01-01_00:46:44 | 88 | 84.5 |
| 2015-01-01_00:46:45 | 88.2 | 84.5 |
| 2015-01-01_00:46:46 | 87.8 | 84.5 |
| 2015-01-01_00:46:47 | 88.1 | 84.5 |
| 2015-01-01_00:46:48 | 87.6 | 84.5 |
| 2015-01-01_00:46:49 | 87.8 | 84.5 |
| 2015-01-01_00:46:50 | 87.5 | 84.6 |
| 2015-01-01_00:46:51 | 87.3 | 84.6 |
| 2015-01-01_00:46:52 | 86.9 | 84.6 |
| 2015-01-01_00:46:53 | 87.2 | 84.6 |
| 2015-01-01_00:46:54 | 87.5 | 84.6 |
| 2015-01-01_00:46:55 | 87.2 | 84.6 |
| 2015-01-01_00:46:56 | 87.3 | 84.6 |
| 2015-01-01_00:46:57 | 87.1 | 84.6 |
| 2015-01-01_00:46:58 | 87.2 | 84.6 |
| 2015-01-01_00:46:59 | 87.2 | 84.6 |
| 2015-01-01_00:47:00 | 87.5 | 84.6 |
| 2015-01-01_00:47:01 | 87.4 | 84.6 |
| 2015-01-01_00:47:02 | 87.4 | 84.6 |
| 2015-01-01_00:47:03 | 87.1 | 84.6 |
| 2015-01-01_00:47:04 | 87.4 | 84.6 |
| 2015-01-01_00:47:05 | 87.2 | 84.6 |
| 2015-01-01_00:47:06 | 87.4 | 84.7 |
| 2015-01-01_00:47:07 | 87.2 | 84.7 |
| 2015-01-01_00:47:08 | 87.6 | 84.7 |
| 2015-01-01_00:47:09 | 87.7 | 84.7 |
| 2015-01-01_00:47:10 | 87.7 | 84.7 |
| 2015-01-01_00:47:11 | 87.4 | 84.7 |
| 2015-01-01_00:47:12 | 87.8 | 84.7 |
| 2015-01-01_00:47:13 | 87.7 | 84.7 |
| 2015-01-01_00:47:14 | 87.8 | 84.8 |
| 2015-01-01_00:47:15 | 87.9 | 84.8 |
| 2015-01-01_00:47:16 | 88.1 | 84.8 |
| 2015-01-01_00:47:17 | 88.2 | 84.8 |
| 2015-01-01_00:47:18 | 88.1 | 84.8 |
| 2015-01-01_00:47:19 | 88.4 | 84.8 |
| 2015-01-01_00:47:20 | 88.4 | 84.8 |
| 2015-01-01_00:47:21 | 88.6 | 84.8 |
| 2015-01-01_00:47:22 | 88.4 | 84.8 |
| 2015-01-01_00:47:23 | 88.5 | 84.8 |
| 2015-01-01_00:47:24 | 88.4 | 84.8 |
| 2015-01-01_00:47:25 | 88.4 | 84.8 |
| 2015-01-01_00:47:26 | 88.4 | 84.8 |
| 2015-01-01_00:47:27 | 88.6 | 84.8 |
| 2015-01-01_00:47:28 | 88.4 | 84.8 |
| 2015-01-01_00:47:29 | 88.8 | 84.8 |
| 2015-01-01_00:47:30 | 88.6 | 84.8 |
| 2015-01-01_00:47:31 | 88.6 | 84.8 |
| 2015-01-01_00:47:32 | 88.4 | 84.8 |
| 2015-01-01_00:47:33 | 88.6 | 84.8 |
| 2015-01-01_00:47:34 | 88.8 | 84.8 |
| 2015-01-01_00:47:35 | 88.8 | 84.8 |
| 2015-01-01_00:47:36 | 88.8 | 84.8 |
| 2015-01-01_00:47:37 | 88.7 | 84.8 |
| 2015-01-01_00:47:38 | 88.4 | 84.8 |
| 2015-01-01_00:47:39 | 88.2 | 84.8 |
| 2015-01-01_00:47:40 | 87.7 | 84.8 |
| 2015-01-01_00:47:41 | 87.6 | 84.8 |
| 2015-01-01_00:47:42 | 87.6 | 84.8 |
| 2015-01-01_00:47:43 | 87.7 | 84.8 |
| 2015-01-01_00:47:44 | 87.6 | 84.8 |
| 2015-01-01_00:47:45 | 87.7 | 84.8 |
| 2015-01-01_00:47:46 | 88.1 | 85 |
| 2015-01-01_00:47:47 | 87.6 | 85 |
| 2015-01-01_00:47:48 | 87.4 | 85 |
| 2015-01-01_00:47:49 | 87.3 | 85 |
| 2015-01-01_00:47:50 | 87 | 85 |
| 2015-01-01_00:47:51 | 87.3 | 85 |
| 2015-01-01_00:47:52 | 87.2 | 85 |
| 2015-01-01_00:47:53 | 87.4 | 85 |
| 2015-01-01_00:47:54 | 87.4 | 85.1 |
| 2015-01-01_00:47:55 | 87.5 | 85.1 |
| 2015-01-01_00:47:56 | 87.7 | 85.1 |
| 2015-01-01_00:47:57 | 87.5 | 85.1 |
| 2015-01-01_00:47:58 | 87.9 | 85.1 |
| 2015-01-01_00:47:59 | 88 | 85.1 |
| 2015-01-01_00:48:00 | 88.1 | 85.1 |
| 2015-01-01_00:48:01 | 88.1 | 85.1 |
| 2015-01-01_00:48:02 | 88 | 85.1 |
| 2015-01-01_00:48:03 | 88.3 | 85.1 |
| 2015-01-01_00:48:04 | 88.4 | 85.1 |
| 2015-01-01_00:48:05 | 88.4 | 85.1 |
| 2015-01-01_00:48:06 | 88.3 | 85.1 |
| 2015-01-01_00:48:07 | 88.5 | 85.1 |
| 2015-01-01_00:48:08 | 88.2 | 85.1 |
| 2015-01-01_00:48:09 | 88.3 | 85.1 |
| 2015-01-01_00:48:10 | 88.3 | 85.1 |
| 2015-01-01_00:48:11 | 88.6 | 85.1 |
| 2015-01-01_00:48:12 | 88.4 | 85.1 |
| 2015-01-01_00:48:13 | 88.4 | 85.1 |
| 2015-01-01_00:48:14 | 88.6 | 85.1 |
| 2015-01-01_00:48:15 | 88.6 | 85.1 |
| 2015-01-01_00:48:16 | 88.9 | 85.1 |
| 2015-01-01_00:48:17 | 88.8 | 85.1 |
| 2015-01-01_00:48:18 | 88.8 | 85.1 |
| 2015-01-01_00:48:19 | 88.9 | 85.1 |
| 2015-01-01_00:48:20 | 89.2 | 85.1 |
| 2015-01-01_00:48:21 | 89 | 85.1 |
| 2015-01-01_00:48:22 | 88.8 | 85.1 |
| 2015-01-01_00:48:23 | 88.9 | 85.1 |
| 2015-01-01_00:48:24 | 88.6 | 85.1 |
| 2015-01-01_00:48:25 | 88.6 | 85.1 |
| 2015-01-01_00:48:26 | 88.8 | 85.3 |
| 2015-01-01_00:48:27 | 88.8 | 85.3 |
| 2015-01-01_00:48:28 | 88.9 | 85.3 |
| 2015-01-01_00:48:29 | 88.6 | 85.3 |
| 2015-01-01_00:48:30 | 88.6 | 85.3 |
| 2015-01-01_00:48:31 | 88.5 | 85.3 |
| 2015-01-01_00:48:32 | 88.7 | 85.3 |
| 2015-01-01_00:48:33 | 88.6 | 85.3 |
| 2015-01-01_00:48:34 | 88.8 | 85.5 |
| 2015-01-01_00:48:35 | 88.8 | 85.5 |
| 2015-01-01_00:48:36 | 88.3 | 85.5 |
| 2015-01-01_00:48:37 | 88.2 | 85.5 |
| 2015-01-01_00:48:38 | 87.9 | 85.5 |
| 2015-01-01_00:48:39 | 87.9 | 85.5 |
| 2015-01-01_00:48:40 | 87.8 | 85.5 |
| 2015-01-01_00:48:41 | 87.5 | 85.5 |
| 2015-01-01_00:48:42 | 87.3 | 85.6 |
| 2015-01-01_00:48:43 | 87.8 | 85.6 |
| 2015-01-01_00:48:44 | 87.8 | 85.6 |
| 2015-01-01_00:48:45 | 88 | 85.6 |
| 2015-01-01_00:48:46 | 87.9 | 85.6 |
| 2015-01-01_00:48:47 | 88.1 | 85.6 |
| 2015-01-01_00:48:48 | 87.2 | 85.6 |
| 2015-01-01_00:48:49 | 88.1 | 85.6 |
| 2015-01-01_00:48:50 | 88.1 | 85.6 |
| 2015-01-01_00:48:51 | 87.8 | 85.6 |
| 2015-01-01_00:48:52 | 87.5 | 85.6 |
| 2015-01-01_00:48:53 | 87.9 | 85.6 |
| 2015-01-01_00:48:54 | 87.8 | 85.6 |
| 2015-01-01_00:48:55 | 88.2 | 85.6 |
| 2015-01-01_00:48:56 | 87.9 | 85.6 |
| 2015-01-01_00:48:57 | 88 | 85.6 |
| 2015-01-01_00:48:58 | 88.1 | 85.6 |
| 2015-01-01_00:48:59 | 88.3 | 85.6 |
| 2015-01-01_00:49:00 | 87.6 | 85.6 |
| 2015-01-01_00:49:01 | 87.9 | 85.6 |
| 2015-01-01_00:49:02 | 87.9 | 85.6 |
| 2015-01-01_00:49:03 | 87.8 | 85.6 |
| 2015-01-01_00:49:04 | 87.8 | 85.6 |
| 2015-01-01_00:49:05 | 87.8 | 85.6 |
| 2015-01-01_00:49:06 | 87.9 | 85.5 |
| 2015-01-01_00:49:07 | 87.6 | 85.5 |
| 2015-01-01_00:49:08 | 87.6 | 85.5 |
| 2015-01-01_00:49:09 | 87.8 | 85.5 |
| 2015-01-01_00:49:10 | 87.1 | 85.5 |
| 2015-01-01_00:49:11 | 87.1 | 85.5 |
| 2015-01-01_00:49:12 | 86.9 | 85.5 |
| 2015-01-01_00:49:13 | 87 | 85.5 |
| 2015-01-01_00:49:14 | 87.1 | 85.5 |
| 2015-01-01_00:49:15 | 86.9 | 85.5 |
| 2015-01-01_00:49:16 | 86.8 | 85.5 |
| 2015-01-01_00:49:17 | 86.3 | 85.5 |
| 2015-01-01_00:49:18 | 86.2 | 85.5 |
| 2015-01-01_00:49:19 | 86.2 | 85.5 |
| 2015-01-01_00:49:20 | 86.4 | 85.5 |
| 2015-01-01_00:49:21 | 86.3 | 85.5 |
| 2015-01-01_00:49:22 | 86 | 85.6 |
| 2015-01-01_00:49:23 | 86.2 | 85.6 |
| 2015-01-01_00:49:24 | 86.7 | 85.6 |
| 2015-01-01_00:49:25 | 86.8 | 85.6 |
| 2015-01-01_00:49:26 | 86.6 | 85.6 |
| 2015-01-01_00:49:27 | 86.5 | 85.6 |
| 2015-01-01_00:49:28 | 86.4 | 85.6 |
| 2015-01-01_00:49:29 | 86.2 | 85.6 |
| 2015-01-01_00:49:30 | 86 | 85.6 |
| 2015-01-01_00:49:31 | 86 | 85.6 |
| 2015-01-01_00:49:32 | 85.9 | 85.6 |
| 2015-01-01_00:49:33 | 86.1 | 85.6 |
| 2015-01-01_00:49:34 | 86 | 85.6 |
| 2015-01-01_00:49:35 | 86 | 85.6 |
| 2015-01-01_00:49:36 | 86.5 | 85.6 |
| 2015-01-01_00:49:37 | 86.2 | 85.6 |
| 2015-01-01_00:49:38 | 86.1 | 85.6 |
| 2015-01-01_00:49:39 | 86 | 85.6 |
| 2015-01-01_00:49:40 | 86.3 | 85.6 |
| 2015-01-01_00:49:41 | 86.6 | 85.6 |
| 2015-01-01_00:49:42 | 86.7 | 85.6 |
| 2015-01-01_00:49:43 | 86.9 | 85.6 |
| 2015-01-01_00:49:44 | 87.3 | 85.6 |
| 2015-01-01_00:49:45 | 87.2 | 85.6 |
| 2015-01-01_00:49:46 | 87 | 85.5 |
| 2015-01-01_00:49:47 | 87 | 85.5 |
| 2015-01-01_00:49:48 | 86.9 | 85.5 |
| 2015-01-01_00:49:49 | 86.7 | 85.5 |
| 2015-01-01_00:49:50 | 86.1 | 85.5 |
| 2015-01-01_00:49:51 | 85.8 | 85.5 |
| 2015-01-01_00:49:52 | 85.9 | 85.5 |
| 2015-01-01_00:49:53 | 85.7 | 85.5 |
| 2015-01-01_00:49:54 | 85.9 | 85.3 |
| 2015-01-01_00:49:55 | 85.8 | 85.3 |
| 2015-01-01_00:49:56 | 85.9 | 85.3 |
| 2015-01-01_00:49:57 | 85.8 | 85.3 |
| 2015-01-01_00:49:58 | 86.2 | 85.3 |
| 2015-01-01_00:49:59 | 86 | 85.3 |
| 2015-01-01_00:50:00 | 86 | 85.3 |
| 2015-01-01_00:50:01 | 85.9 | 85.3 |
| 2015-01-01_00:50:02 | 85.9 | 85.3 |
| 2015-01-01_00:50:03 | 85.9 | 85.3 |
| 2015-01-01_00:50:04 | 85.9 | 85.3 |
| 2015-01-01_00:50:05 | 85.7 | 85.3 |
| 2015-01-01_00:50:06 | 85.8 | 85.3 |
| 2015-01-01_00:50:07 | 85.6 | 85.3 |
| 2015-01-01_00:50:08 | 85.4 | 85.3 |
| 2015-01-01_00:50:09 | 85.3 | 85.3 |
| 2015-01-01_00:50:10 | 85.2 | 85.3 |
| 2015-01-01_00:50:11 | 85.1 | 85.3 |
| 2015-01-01_00:50:12 | 84.7 | 85.3 |
| 2015-01-01_00:50:13 | 84.6 | 85.3 |
| 2015-01-01_00:50:14 | 84.3 | 85.3 |
| 2015-01-01_00:50:15 | 84.2 | 85.3 |
| 2015-01-01_00:50:16 | 84.3 | 85.3 |
| 2015-01-01_00:50:17 | 84.2 | 85.3 |
| 2015-01-01_00:50:18 | 84.5 | 85.3 |
| 2015-01-01_00:50:19 | 84.5 | 85.3 |
| 2015-01-01_00:50:20 | 84.2 | 85.3 |
| 2015-01-01_00:50:21 | 84 | 85.3 |
| 2015-01-01_00:50:22 | 84 | 85.3 |
| 2015-01-01_00:50:23 | 83.7 | 85.3 |
| 2015-01-01_00:50:24 | 83.9 | 85.3 |
| 2015-01-01_00:50:25 | 83.5 | 85.3 |
| 2015-01-01_00:50:26 | 84.1 | 85.3 |
| 2015-01-01_00:50:27 | 84.2 | 85.3 |
| 2015-01-01_00:50:28 | 84.2 | 85.3 |
| 2015-01-01_00:50:29 | 84.4 | 85.3 |
| 2015-01-01_00:50:30 | 84.2 | 85.3 |
| 2015-01-01_00:50:31 | 84.3 | 85.3 |
| 2015-01-01_00:50:32 | 84.2 | 85.3 |
| 2015-01-01_00:50:33 | 84.3 | 85.3 |
| 2015-01-01_00:50:34 | 84.4 | 85.3 |
| 2015-01-01_00:50:35 | 84.3 | 85.3 |
| 2015-01-01_00:50:36 | 84.3 | 85.3 |
| 2015-01-01_00:50:37 | 84.4 | 85.3 |
| 2015-01-01_00:50:38 | 84.6 | 85.3 |
| 2015-01-01_00:50:39 | 84.7 | 85.3 |
| 2015-01-01_00:50:40 | 85.2 | 85.3 |
| 2015-01-01_00:50:41 | 85.5 | 85.3 |
| 2015-01-01_00:50:42 | 85.7 | 85 |
| 2015-01-01_00:50:43 | 85.8 | 85 |
| 2015-01-01_00:50:44 | 86.6 | 85 |
| 2015-01-01_00:50:45 | 87.1 | 85 |
| 2015-01-01_00:50:46 | 87.5 | 85 |
| 2015-01-01_00:50:47 | 87.6 | 85 |
| 2015-01-01_00:50:48 | 88.4 | 85 |
| 2015-01-01_00:50:49 | 88.9 | 85 |
| 2015-01-01_00:50:50 | 89.4 | 84.8 |
| 2015-01-01_00:50:51 | 89.7 | 84.8 |
| 2015-01-01_00:50:52 | 89.8 | 84.8 |
| 2015-01-01_00:50:53 | 89.6 | 84.8 |
| 2015-01-01_00:50:54 | 89.5 | 84.8 |
| 2015-01-01_00:50:55 | 89 | 84.8 |
| 2015-01-01_00:50:56 | 88.5 | 84.8 |
| 2015-01-01_00:50:57 | 88.2 | 84.8 |
| 2015-01-01_00:50:58 | 88.5 | 84.8 |
| 2015-01-01_00:50:59 | 88.6 | 84.8 |
| 2015-01-01_00:51:00 | 88.8 | 84.8 |
| 2015-01-01_00:51:01 | 88.8 | 84.8 |
| 2015-01-01_00:51:02 | 89 | 84.8 |
| 2015-01-01_00:51:03 | 89.4 | 84.8 |
| 2015-01-01_00:51:04 | 89.8 | 84.8 |
| 2015-01-01_00:51:05 | 89.9 | 84.8 |
| 2015-01-01_00:51:06 | 90.1 | 85 |
| 2015-01-01_00:51:07 | 89.5 | 85 |
| 2015-01-01_00:51:08 | 90.4 | 85 |
| 2015-01-01_00:51:09 | 90.5 | 85 |
| 2015-01-01_00:51:10 | 90.6 | 85 |
| 2015-01-01_00:51:11 | 90.9 | 85 |
| 2015-01-01_00:51:12 | 91.4 | 85 |
| 2015-01-01_00:51:13 | 91.3 | 85 |
| 2015-01-01_00:51:14 | 91.5 | 85.3 |
| 2015-01-01_00:51:15 | 91.7 | 85.3 |
| 2015-01-01_00:51:16 | 92.3 | 85.3 |
| 2015-01-01_00:51:17 | 92.4 | 85.3 |
| 2015-01-01_00:51:18 | 93.1 | 85.3 |
| 2015-01-01_00:51:19 | 93.2 | 85.3 |
| 2015-01-01_00:51:20 | 93 | 85.3 |
| 2015-01-01_00:51:21 | 93.2 | 85.3 |
| 2015-01-01_00:51:22 | 92.8 | 85.6 |
| 2015-01-01_00:51:23 | 92.7 | 85.6 |
| 2015-01-01_00:51:24 | 92.2 | 85.6 |
| 2015-01-01_00:51:25 | 92.4 | 85.6 |
| 2015-01-01_00:51:26 | 92.1 | 85.6 |
| 2015-01-01_00:51:27 | 92 | 85.6 |
| 2015-01-01_00:51:28 | 92.6 | 85.6 |
| 2015-01-01_00:51:29 | 92.3 | 85.6 |
| 2015-01-01_00:51:30 | 92.2 | 86.1 |
| 2015-01-01_00:51:31 | 92.2 | 86.1 |
| 2015-01-01_00:51:32 | 91.7 | 86.1 |
| 2015-01-01_00:51:33 | 92 | 86.1 |
| 2015-01-01_00:51:34 | 92 | 86.1 |
| 2015-01-01_00:51:35 | 92 | 86.1 |
| 2015-01-01_00:51:36 | 91.5 | 86.1 |
| 2015-01-01_00:51:37 | 91.8 | 86.1 |
| 2015-01-01_00:51:38 | 91.7 | 86.8 |
| 2015-01-01_00:51:39 | 91.5 | 86.8 |
| 2015-01-01_00:51:40 | 91.3 | 86.8 |
| 2015-01-01_00:51:41 | 91.3 | 86.8 |
| 2015-01-01_00:51:42 | 91.7 | 86.8 |
| 2015-01-01_00:51:43 | 91.5 | 86.8 |
| 2015-01-01_00:51:44 | 91.4 | 86.8 |
| 2015-01-01_00:51:45 | 91.6 | 86.8 |
| 2015-01-01_00:51:46 | 91.4 | 87.5 |
| 2015-01-01_00:51:47 | 91.2 | 87.5 |
| 2015-01-01_00:51:48 | 91.3 | 87.5 |
| 2015-01-01_00:51:49 | 91.2 | 87.5 |
| 2015-01-01_00:51:50 | 91.5 | 87.5 |
| 2015-01-01_00:51:51 | 91.1 | 87.5 |
| 2015-01-01_00:51:52 | 91.2 | 87.5 |
| 2015-01-01_00:51:53 | 91.5 | 87.5 |
| 2015-01-01_00:51:54 | 91.3 | 88.1 |
| 2015-01-01_00:51:55 | 91.4 | 88.1 |
| 2015-01-01_00:51:56 | 91.4 | 88.1 |
| 2015-01-01_00:51:57 | 91.5 | 88.1 |
| 2015-01-01_00:51:58 | 91.1 | 88.1 |
| 2015-01-01_00:51:59 | 91 | 88.1 |
| 2015-01-01_00:52:00 | 91.4 | 88.1 |
| 2015-01-01_00:52:01 | 91.1 | 88.1 |
| 2015-01-01_00:52:02 | 91.2 | 88.6 |
| 2015-01-01_00:52:03 | 91.5 | 88.6 |
| 2015-01-01_00:52:04 | 91.4 | 88.6 |
| 2015-01-01_00:52:05 | 91.5 | 88.6 |
| 2015-01-01_00:52:06 | 91.1 | 88.6 |
| 2015-01-01_00:52:07 | 91.2 | 88.6 |
| 2015-01-01_00:52:08 | 91.3 | 88.6 |
| 2015-01-01_00:52:09 | 91.7 | 88.6 |
| 2015-01-01_00:52:10 | 91.6 | 89.1 |
| 2015-01-01_00:52:11 | 91.6 | 89.1 |
| 2015-01-01_00:52:12 | 91.5 | 89.1 |
| 2015-01-01_00:52:13 | 91.4 | 89.1 |
| 2015-01-01_00:52:14 | 91.3 | 89.1 |
| 2015-01-01_00:52:15 | 91.6 | 89.1 |
| 2015-01-01_00:52:16 | 91.5 | 89.1 |
| 2015-01-01_00:52:17 | 91.3 | 89.1 |
| 2015-01-01_00:52:18 | 91.2 | 89.6 |
| 2015-01-01_00:52:19 | 91.6 | 89.6 |
| 2015-01-01_00:52:20 | 91.3 | 89.6 |
| 2015-01-01_00:52:21 | 91.3 | 89.6 |
| 2015-01-01_00:52:22 | 91.1 | 89.6 |
| 2015-01-01_00:52:23 | 91.4 | 89.6 |
| 2015-01-01_00:52:24 | 91.4 | 89.6 |
| 2015-01-01_00:52:25 | 91.7 | 89.6 |
| 2015-01-01_00:52:26 | 91.5 | 90.1 |
| 2015-01-01_00:52:27 | 91.5 | 90.1 |
| 2015-01-01_00:52:28 | 91.7 | 90.1 |
| 2015-01-01_00:52:29 | 91.8 | 90.1 |
| 2015-01-01_00:52:30 | 91.7 | 90.1 |
| 2015-01-01_00:52:31 | 91.8 | 90.1 |
| 2015-01-01_00:52:32 | 91.6 | 90.1 |
| 2015-01-01_00:52:33 | 91.6 | 90.1 |
| 2015-01-01_00:52:34 | 91.5 | 90.1 |
| 2015-01-01_00:52:35 | 91.5 | 90.1 |
| 2015-01-01_00:52:36 | 91.6 | 90.1 |
| 2015-01-01_00:52:37 | 91.4 | 90.1 |
| 2015-01-01_00:52:38 | 91.3 | 90.1 |
| 2015-01-01_00:52:39 | 91.3 | 90.1 |
| 2015-01-01_00:52:40 | 91.4 | 90.1 |
| 2015-01-01_00:52:41 | 91.5 | 90.1 |
| 2015-01-01_00:52:42 | 91.6 | 91 |
| 2015-01-01_00:52:43 | 91.5 | 91 |
| 2015-01-01_00:52:44 | 91.6 | 91 |
| 2015-01-01_00:52:45 | 91.7 | 91 |
| 2015-01-01_00:52:46 | 91.4 | 91 |
| 2015-01-01_00:52:47 | 91.3 | 91 |
| 2015-01-01_00:52:48 | 91.5 | 91 |
| 2015-01-01_00:52:49 | 91.5 | 91 |
| 2015-01-01_00:52:50 | 91.7 | 91.4 |
| 2015-01-01_00:52:51 | 91.7 | 91.4 |
| 2015-01-01_00:52:52 | 92.1 | 91.4 |
| 2015-01-01_00:52:53 | 92.1 | 91.4 |
| 2015-01-01_00:52:54 | 92.2 | 91.4 |
| 2015-01-01_00:52:55 | 92.2 | 91.4 |
| 2015-01-01_00:52:56 | 92.3 | 91.4 |
| 2015-01-01_00:52:57 | 92.3 | 91.4 |
| 2015-01-01_00:52:58 | 92.5 | 91.8 |
| 2015-01-01_00:52:59 | 92.2 | 91.8 |
| 2015-01-01_00:53:00 | 92.3 | 91.8 |
| 2015-01-01_00:53:01 | 92.1 | 91.8 |
| 2015-01-01_00:53:02 | 92.2 | 91.8 |
| 2015-01-01_00:53:03 | 92.1 | 91.8 |
| 2015-01-01_00:53:04 | 92.3 | 91.8 |
| 2015-01-01_00:53:05 | 92.3 | 91.8 |
| 2015-01-01_00:53:06 | 92.2 | 92.2 |
| 2015-01-01_00:53:07 | 92.2 | 92.2 |
| 2015-01-01_00:53:08 | 92 | 92.2 |
| 2015-01-01_00:53:09 | 92.2 | 92.2 |
| 2015-01-01_00:53:10 | 92.4 | 92.2 |
| 2015-01-01_00:53:11 | 92.2 | 92.2 |
| 2015-01-01_00:53:12 | 92.4 | 92.2 |
| 2015-01-01_00:53:13 | 92.6 | 92.2 |
| 2015-01-01_00:53:14 | 92.5 | 92.5 |
| 2015-01-01_00:53:15 | 92.3 | 92.5 |
| 2015-01-01_00:53:16 | 92.5 | 92.5 |
| 2015-01-01_00:53:17 | 92.5 | 92.5 |
| 2015-01-01_00:53:18 | 92.5 | 92.5 |
| 2015-01-01_00:53:19 | 92.3 | 92.5 |
| 2015-01-01_00:53:20 | 92.3 | 92.5 |
| 2015-01-01_00:53:21 | 92.5 | 92.5 |
| 2015-01-01_00:53:22 | 92.1 | 92.7 |
| 2015-01-01_00:53:23 | 92.6 | 92.7 |
| 2015-01-01_00:53:24 | 92.7 | 92.7 |
| 2015-01-01_00:53:25 | 92.5 | 92.7 |
| 2015-01-01_00:53:26 | 92.7 | 92.7 |
| 2015-01-01_00:53:27 | 92.6 | 92.7 |
| 2015-01-01_00:53:28 | 92.6 | 92.7 |
| 2015-01-01_00:53:29 | 92.6 | 92.7 |
| 2015-01-01_00:53:30 | 92.8 | 92.7 |
| 2015-01-01_00:53:31 | 92.8 | 92.7 |
| 2015-01-01_00:53:32 | 92.7 | 92.7 |
| 2015-01-01_00:53:33 | 93 | 92.7 |
| 2015-01-01_00:53:34 | 92.9 | 92.7 |
| 2015-01-01_00:53:35 | 93 | 92.7 |
| 2015-01-01_00:53:36 | 92.9 | 92.7 |
| 2015-01-01_00:53:37 | 93.1 | 92.7 |
| 2015-01-01_00:53:38 | 93.1 | 93.4 |
| 2015-01-01_00:53:39 | 93.2 | 93.4 |
| 2015-01-01_00:53:40 | 92.9 | 93.4 |
| 2015-01-01_00:53:41 | 93.2 | 93.4 |
| 2015-01-01_00:53:42 | 93.4 | 93.4 |
| 2015-01-01_00:53:43 | 93.4 | 93.4 |
| 2015-01-01_00:53:44 | 93.2 | 93.4 |
| 2015-01-01_00:53:45 | 92.9 | 93.4 |
| 2015-01-01_00:53:46 | 93.3 | 93.9 |
| 2015-01-01_00:53:47 | 93.4 | 93.9 |
| 2015-01-01_00:53:48 | 93.6 | 93.9 |
| 2015-01-01_00:53:49 | 93.4 | 93.9 |
| 2015-01-01_00:53:50 | 93.4 | 93.9 |
| 2015-01-01_00:53:51 | 93.4 | 93.9 |
| 2015-01-01_00:53:52 | 93.3 | 93.9 |
| 2015-01-01_00:53:53 | 93.6 | 93.9 |
| 2015-01-01_00:53:54 | 93.3 | 94.3 |
| 2015-01-01_00:53:55 | 93.3 | 94.3 |
| 2015-01-01_00:53:56 | 93.6 | 94.3 |
| 2015-01-01_00:53:57 | 93.3 | 94.3 |
| 2015-01-01_00:53:58 | 93.4 | 94.3 |
| 2015-01-01_00:53:59 | 93.8 | 94.3 |
| 2015-01-01_00:54:00 | 93.6 | 94.3 |
| 2015-01-01_00:54:01 | 93.7 | 94.3 |
| 2015-01-01_00:54:02 | 93.6 | 94.3 |
| 2015-01-01_00:54:03 | 93.2 | 94.3 |
| 2015-01-01_00:54:04 | 93.6 | 94.3 |
| 2015-01-01_00:54:05 | 93.7 | 94.3 |
| 2015-01-01_00:54:06 | 93.5 | 94.3 |
| 2015-01-01_00:54:07 | 93 | 94.3 |
| 2015-01-01_00:54:08 | 93.3 | 94.3 |
| 2015-01-01_00:54:09 | 93.5 | 94.3 |
| 2015-01-01_00:54:10 | 93.2 | 95.3 |
| 2015-01-01_00:54:11 | 93.7 | 95.3 |
| 2015-01-01_00:54:12 | 93.3 | 95.3 |
| 2015-01-01_00:54:13 | 93.2 | 95.3 |
| 2015-01-01_00:54:14 | 93.1 | 95.3 |
| 2015-01-01_00:54:15 | 93.7 | 95.3 |
| 2015-01-01_00:54:16 | 93.4 | 95.3 |
| 2015-01-01_00:54:17 | 93.3 | 95.3 |
| 2015-01-01_00:54:18 | 93.8 | 95.6 |
| 2015-01-01_00:54:19 | 93.7 | 95.6 |
| 2015-01-01_00:54:20 | 93.5 | 95.6 |
| 2015-01-01_00:54:21 | 93.2 | 95.6 |
| 2015-01-01_00:54:22 | 93 | 95.6 |
| 2015-01-01_00:54:23 | 92.6 | 95.6 |
| 2015-01-01_00:54:24 | 92.2 | 95.6 |
| 2015-01-01_00:54:25 | 91.8 | 95.6 |
| 2015-01-01_00:54:26 | 91.4 | 96 |
| 2015-01-01_00:54:27 | 91.1 | 96 |
| 2015-01-01_00:54:28 | 90.7 | 96 |
| 2015-01-01_00:54:29 | 90.5 | 96 |
| 2015-01-01_00:54:30 | 90 | 96 |
| 2015-01-01_00:54:31 | 90.2 | 96 |
| 2015-01-01_00:54:32 | 90.3 | 96 |
| 2015-01-01_00:54:33 | 90.5 | 96 |
| 2015-01-01_00:54:34 | 90.3 | 96.3 |
| 2015-01-01_00:54:35 | 90.3 | 96.3 |
| 2015-01-01_00:54:36 | 90.4 | 96.3 |
| 2015-01-01_00:54:37 | 90.5 | 96.3 |
| 2015-01-01_00:54:38 | 90.5 | 96.3 |
| 2015-01-01_00:54:39 | 90.6 | 96.3 |
| 2015-01-01_00:54:40 | 90.3 | 96.3 |
| 2015-01-01_00:54:41 | 90.6 | 96.3 |
| 2015-01-01_00:54:42 | 90.9 | 96.5 |
| 2015-01-01_00:54:43 | 90.7 | 96.5 |
| 2015-01-01_00:54:44 | 90.8 | 96.5 |
| 2015-01-01_00:54:45 | 91.2 | 96.5 |
| 2015-01-01_00:54:46 | 90.9 | 96.5 |
| 2015-01-01_00:54:47 | 90.6 | 96.5 |
| 2015-01-01_00:54:48 | 91.4 | 96.5 |
| 2015-01-01_00:54:49 | 90.9 | 96.5 |
| 2015-01-01_00:54:50 | 91.7 | 96.5 |
| 2015-01-01_00:54:51 | 92 | 96.5 |
| 2015-01-01_00:54:52 | 92.2 | 96.5 |
| 2015-01-01_00:54:53 | 92.1 | 96.5 |
| 2015-01-01_00:54:54 | 92.4 | 96.5 |
| 2015-01-01_00:54:55 | 91.8 | 96.5 |
| 2015-01-01_00:54:56 | 91.9 | 96.5 |
| 2015-01-01_00:54:57 | 91.7 | 96.5 |
| 2015-01-01_00:54:58 | 92.4 | 96.3 |
| 2015-01-01_00:54:59 | 92 | 96.3 |
| 2015-01-01_00:55:00 | 92.3 | 96.3 |
| 2015-01-01_00:55:01 | 92.1 | 96.3 |
| 2015-01-01_00:55:02 | 92.1 | 96.3 |
| 2015-01-01_00:55:03 | 92.3 | 96.3 |
| 2015-01-01_00:55:04 | 92.1 | 96.3 |
| 2015-01-01_00:55:05 | 92.1 | 96.3 |
| 2015-01-01_00:55:06 | 91.9 | 96.2 |
| 2015-01-01_00:55:07 | 92.1 | 96.2 |
| 2015-01-01_00:55:08 | 92.1 | 96.2 |
| 2015-01-01_00:55:09 | 92.3 | 96.2 |
| 2015-01-01_00:55:10 | 92.1 | 96.2 |
| 2015-01-01_00:55:11 | 91.9 | 96.2 |
| 2015-01-01_00:55:12 | 91.7 | 96.2 |
| 2015-01-01_00:55:13 | 91.4 | 96.2 |
| 2015-01-01_00:55:14 | 91 | 96.3 |
| 2015-01-01_00:55:15 | 90.7 | 96.3 |
| 2015-01-01_00:55:16 | 90.6 | 96.3 |
| 2015-01-01_00:55:17 | 90.3 | 96.3 |
| 2015-01-01_00:55:18 | 90.1 | 96.3 |
| 2015-01-01_00:55:19 | 89.6 | 96.3 |
| 2015-01-01_00:55:20 | 89.4 | 96.3 |
| 2015-01-01_00:55:21 | 89.2 | 96.3 |
| 2015-01-01_00:55:22 | 88.9 | 96.5 |
| 2015-01-01_00:55:23 | 88.6 | 96.5 |
| 2015-01-01_00:55:24 | 88.4 | 96.5 |
| 2015-01-01_00:55:25 | 88.2 | 96.5 |
| 2015-01-01_00:55:26 | 88.1 | 96.5 |
| 2015-01-01_00:55:27 | 87.8 | 96.5 |
| 2015-01-01_00:55:28 | 87.6 | 96.5 |
| 2015-01-01_00:55:29 | 87.6 | 96.5 |
| 2015-01-01_00:55:30 | 87.5 | 96.6 |
| 2015-01-01_00:55:31 | 87 | 96.6 |
| 2015-01-01_00:55:32 | 86.8 | 96.6 |
| 2015-01-01_00:55:33 | 86.7 | 96.6 |
| 2015-01-01_00:55:34 | 86.5 | 96.6 |
| 2015-01-01_00:55:35 | 86.4 | 96.6 |
| 2015-01-01_00:55:36 | 86.6 | 96.6 |
| 2015-01-01_00:55:37 | 86.8 | 96.6 |
| 2015-01-01_00:55:38 | 86.2 | 96.5 |
| 2015-01-01_00:55:39 | 86.7 | 96.5 |
| 2015-01-01_00:55:40 | 86.8 | 96.5 |
| 2015-01-01_00:55:41 | 86.7 | 96.5 |
| 2015-01-01_00:55:42 | 86.9 | 96.5 |
| 2015-01-01_00:55:43 | 86.9 | 96.5 |
| 2015-01-01_00:55:44 | 87.1 | 96.5 |
| 2015-01-01_00:55:45 | 86.8 | 96.5 |
| 2015-01-01_00:55:46 | 86.7 | 96.1 |
| 2015-01-01_00:55:47 | 86.7 | 96.1 |
| 2015-01-01_00:55:48 | 86.3 | 96.1 |
| 2015-01-01_00:55:49 | 86.5 | 96.1 |
| 2015-01-01_00:55:50 | 86.2 | 96.1 |
| 2015-01-01_00:55:51 | 86.6 | 96.1 |
| 2015-01-01_00:55:52 | 86.4 | 96.1 |
| 2015-01-01_00:55:53 | 86.2 | 96.1 |
| 2015-01-01_00:55:54 | 86.3 | 95.7 |
| 2015-01-01_00:55:55 | 85.8 | 95.7 |
| 2015-01-01_00:55:56 | 86.4 | 95.7 |
| 2015-01-01_00:55:57 | 86.2 | 95.7 |
| 2015-01-01_00:55:58 | 86.2 | 95.7 |
| 2015-01-01_00:55:59 | 86.7 | 95.7 |
| 2015-01-01_00:56:00 | 86.5 | 95.7 |
| 2015-01-01_00:56:01 | 86.3 | 95.7 |
| 2015-01-01_00:56:02 | 86.5 | 95.2 |
| 2015-01-01_00:56:03 | 86.7 | 95.2 |
| 2015-01-01_00:56:04 | 86.2 | 95.2 |
| 2015-01-01_00:56:05 | 86.3 | 95.2 |
| 2015-01-01_00:56:06 | 86.7 | 95.2 |
| 2015-01-01_00:56:07 | 86.7 | 95.2 |
| 2015-01-01_00:56:08 | 86.5 | 95.2 |
| 2015-01-01_00:56:09 | 86.6 | 95.2 |
| 2015-01-01_00:56:10 | 86.6 | 94.6 |
| 2015-01-01_00:56:11 | 86.7 | 94.6 |
| 2015-01-01_00:56:12 | 86.6 | 94.6 |
| 2015-01-01_00:56:13 | 86.5 | 94.6 |
| 2015-01-01_00:56:14 | 86.1 | 94.6 |
| 2015-01-01_00:56:15 | 86.2 | 94.6 |
| 2015-01-01_00:56:16 | 85.9 | 94.6 |
| 2015-01-01_00:56:17 | 85.6 | 94.6 |
| 2015-01-01_00:56:18 | 85.4 | 94.2 |
| 2015-01-01_00:56:19 | 85.4 | 94.2 |
| 2015-01-01_00:56:20 | 85.7 | 94.2 |
| 2015-01-01_00:56:21 | 85.1 | 94.2 |
| 2015-01-01_00:56:22 | 85.2 | 94.2 |
| 2015-01-01_00:56:23 | 85.5 | 94.2 |
| 2015-01-01_00:56:24 | 85.2 | 94.2 |
| 2015-01-01_00:56:25 | 85.4 | 94.2 |
| 2015-01-01_00:56:26 | 85.3 | 93.8 |
| 2015-01-01_00:56:27 | 84.9 | 93.8 |
| 2015-01-01_00:56:28 | 85 | 93.8 |
| 2015-01-01_00:56:29 | 84.9 | 93.8 |
| 2015-01-01_00:56:30 | 84.4 | 93.8 |
| 2015-01-01_00:56:31 | 84.9 | 93.8 |
| 2015-01-01_00:56:32 | 84.9 | 93.8 |
| 2015-01-01_00:56:33 | 85.4 | 93.8 |
| 2015-01-01_00:56:34 | 85.3 | 93.6 |
| 2015-01-01_00:56:35 | 85.4 | 93.6 |
| 2015-01-01_00:56:36 | 85.2 | 93.6 |
| 2015-01-01_00:56:37 | 85.6 | 93.6 |
| 2015-01-01_00:56:38 | 85.7 | 93.6 |
| 2015-01-01_00:56:39 | 86.1 | 93.6 |
| 2015-01-01_00:56:40 | 86.5 | 93.6 |
| 2015-01-01_00:56:41 | 86.4 | 93.6 |
| 2015-01-01_00:56:42 | 86.8 | 93.4 |
| 2015-01-01_00:56:43 | 86.9 | 93.4 |
| 2015-01-01_00:56:44 | 86.9 | 93.4 |
| 2015-01-01_00:56:45 | 86.8 | 93.4 |
| 2015-01-01_00:56:46 | 86.7 | 93.4 |
| 2015-01-01_00:56:47 | 86.5 | 93.4 |
| 2015-01-01_00:56:48 | 86.3 | 93.4 |
| 2015-01-01_00:56:49 | 86.6 | 93.4 |
| 2015-01-01_00:56:50 | 86.5 | 93 |
| 2015-01-01_00:56:51 | 86.7 | 93 |
| 2015-01-01_00:56:52 | 86.8 | 93 |
| 2015-01-01_00:56:53 | 86.6 | 93 |
| 2015-01-01_00:56:54 | 86.5 | 93 |
| 2015-01-01_00:56:55 | 86.5 | 93 |
| 2015-01-01_00:56:56 | 86.7 | 93 |
| 2015-01-01_00:56:57 | 86.8 | 93 |
| 2015-01-01_00:56:58 | 86.6 | 92.7 |
| 2015-01-01_00:56:59 | 86.6 | 92.7 |
| 2015-01-01_00:57:00 | 86.9 | 92.7 |
| 2015-01-01_00:57:01 | 86.8 | 92.7 |
| 2015-01-01_00:57:02 | 86.8 | 92.7 |
| 2015-01-01_00:57:03 | 86.9 | 92.7 |
| 2015-01-01_00:57:04 | 86.8 | 92.7 |
| 2015-01-01_00:57:05 | 87 | 92.7 |
| 2015-01-01_00:57:06 | 87 | 92.3 |
| 2015-01-01_00:57:07 | 86.9 | 92.3 |
| 2015-01-01_00:57:08 | 86.6 | 92.3 |
| 2015-01-01_00:57:09 | 86.8 | 92.3 |
| 2015-01-01_00:57:10 | 86.9 | 92.3 |
| 2015-01-01_00:57:11 | 86.8 | 92.3 |
| 2015-01-01_00:57:12 | 86.5 | 92.3 |
| 2015-01-01_00:57:13 | 86.6 | 92.3 |
| 2015-01-01_00:57:14 | 85.6 | 92 |
| 2015-01-01_00:57:15 | 86.4 | 92 |
| 2015-01-01_00:57:16 | 86.5 | 92 |
| 2015-01-01_00:57:17 | 86.6 | 92 |
| 2015-01-01_00:57:18 | 86.5 | 92 |
| 2015-01-01_00:57:19 | 86.6 | 92 |
| 2015-01-01_00:57:20 | 86.4 | 92 |
| 2015-01-01_00:57:21 | 86.5 | 92 |
| 2015-01-01_00:57:22 | 86.3 | 91.6 |
| 2015-01-01_00:57:23 | 86.2 | 91.6 |
| 2015-01-01_00:57:24 | 86.2 | 91.6 |
| 2015-01-01_00:57:25 | 86.1 | 91.6 |
| 2015-01-01_00:57:26 | 86 | 91.6 |
| 2015-01-01_00:57:27 | 85.9 | 91.6 |
| 2015-01-01_00:57:28 | 85.9 | 91.6 |
| 2015-01-01_00:57:29 | 85.5 | 91.6 |
| 2015-01-01_00:57:30 | 85.5 | 91.3 |
| 2015-01-01_00:57:31 | 85.3 | 91.3 |
| 2015-01-01_00:57:32 | 85.3 | 91.3 |
| 2015-01-01_00:57:33 | 85 | 91.3 |
| 2015-01-01_00:57:34 | 84.3 | 91.3 |
| 2015-01-01_00:57:35 | 85.1 | 91.3 |
| 2015-01-01_00:57:36 | 85.3 | 91.3 |
| 2015-01-01_00:57:37 | 85 | 91.3 |
| 2015-01-01_00:57:38 | 85.1 | 91.3 |
| 2015-01-01_00:57:39 | 85.2 | 91.3 |
| 2015-01-01_00:57:40 | 84.9 | 91.3 |
| 2015-01-01_00:57:41 | 85.2 | 91.3 |
| 2015-01-01_00:57:42 | 85 | 91.3 |
| 2015-01-01_00:57:43 | 84.8 | 91.3 |
| 2015-01-01_00:57:44 | 85.1 | 91.3 |
| 2015-01-01_00:57:45 | 85 | 91.3 |
| 2015-01-01_00:57:46 | 84.6 | 91.1 |
| 2015-01-01_00:57:47 | 84.7 | 91.1 |
| 2015-01-01_00:57:48 | 84.7 | 91.1 |
| 2015-01-01_00:57:49 | 84.7 | 91.1 |
| 2015-01-01_00:57:50 | 84.8 | 91.1 |
| 2015-01-01_00:57:51 | 84.8 | 91.1 |
| 2015-01-01_00:57:52 | 84.7 | 91.1 |
| 2015-01-01_00:57:53 | 84.9 | 91.1 |
| 2015-01-01_00:57:54 | 84.8 | 91 |
| 2015-01-01_00:57:55 | 84.8 | 91 |
| 2015-01-01_00:57:56 | 84.9 | 91 |
| 2015-01-01_00:57:57 | 84.6 | 91 |
| 2015-01-01_00:57:58 | 84.1 | 91 |
| 2015-01-01_00:57:59 | 84.3 | 91 |
| 2015-01-01_00:58:00 | 84.1 | 91 |
| 2015-01-01_00:58:01 | 84.3 | 91 |
| 2015-01-01_00:58:02 | 84.4 | 90.9 |
| 2015-01-01_00:58:03 | 84.2 | 90.9 |
| 2015-01-01_00:58:04 | 84.9 | 90.9 |
| 2015-01-01_00:58:05 | 84.7 | 90.9 |
| 2015-01-01_00:58:06 | 84.7 | 90.9 |
| 2015-01-01_00:58:07 | 85.4 | 90.9 |
| 2015-01-01_00:58:08 | 85.9 | 90.9 |
| 2015-01-01_00:58:09 | 85.8 | 90.9 |
| 2015-01-01_00:58:10 | 86.3 | 90.8 |
| 2015-01-01_00:58:11 | 86 | 90.8 |
| 2015-01-01_00:58:12 | 85.8 | 90.8 |
| 2015-01-01_00:58:13 | 85.8 | 90.8 |
| 2015-01-01_00:58:14 | 86.3 | 90.8 |
| 2015-01-01_00:58:15 | 86.6 | 90.8 |
| 2015-01-01_00:58:16 | 86.9 | 90.8 |
| 2015-01-01_00:58:17 | 86.8 | 90.8 |
| 2015-01-01_00:58:18 | 87 | 90.6 |
| 2015-01-01_00:58:19 | 86.8 | 90.6 |
| 2015-01-01_00:58:20 | 86.7 | 90.6 |
| 2015-01-01_00:58:21 | 86.7 | 90.6 |
| 2015-01-01_00:58:22 | 86.3 | 90.6 |
| 2015-01-01_00:58:23 | 86.2 | 90.6 |
| 2015-01-01_00:58:24 | 86.3 | 90.6 |
| 2015-01-01_00:58:25 | 86.6 | 90.6 |
| 2015-01-01_00:58:26 | 86.8 | 90.4 |
| 2015-01-01_00:58:27 | 87.5 | 90.4 |
| 2015-01-01_00:58:28 | 87.3 | 90.4 |
| 2015-01-01_00:58:29 | 87.8 | 90.4 |
| 2015-01-01_00:58:30 | 88.4 | 90.4 |
| 2015-01-01_00:58:31 | 88.9 | 90.4 |
| 2015-01-01_00:58:32 | 89.2 | 90.4 |
| 2015-01-01_00:58:33 | 89.4 | 90.4 |
| 2015-01-01_00:58:34 | 89.4 | 90.4 |
| 2015-01-01_00:58:35 | 89.2 | 90.4 |
| 2015-01-01_00:58:36 | 89.2 | 90.4 |
| 2015-01-01_00:58:37 | 88.9 | 90.4 |
| 2015-01-01_00:58:38 | 88.8 | 90.4 |
| 2015-01-01_00:58:39 | 88.6 | 90.4 |
| 2015-01-01_00:58:40 | 88.3 | 90.4 |
| 2015-01-01_00:58:41 | 88.3 | 90.4 |
| 2015-01-01_00:58:42 | 88.1 | 90.3 |
| 2015-01-01_00:58:43 | 87.8 | 90.3 |
| 2015-01-01_00:58:44 | 87.6 | 90.3 |
| 2015-01-01_00:58:45 | 87.3 | 90.3 |
| 2015-01-01_00:58:46 | 87.3 | 90.3 |
| 2015-01-01_00:58:47 | 87.5 | 90.3 |
| 2015-01-01_00:58:48 | 87.4 | 90.3 |
| 2015-01-01_00:58:49 | 87.4 | 90.3 |
| 2015-01-01_00:58:50 | 87.3 | 90.3 |
| 2015-01-01_00:58:51 | 87.1 | 90.3 |
| 2015-01-01_00:58:52 | 87.2 | 90.3 |
| 2015-01-01_00:58:53 | 86.9 | 90.3 |
| 2015-01-01_00:58:54 | 86.9 | 90.3 |
| 2015-01-01_00:58:55 | 86.8 | 90.3 |
| 2015-01-01_00:58:56 | 86.6 | 90.3 |
| 2015-01-01_00:58:57 | 86.7 | 90.3 |
| 2015-01-01_00:58:58 | 86.3 | 90.5 |
| 2015-01-01_00:58:59 | 86.4 | 90.5 |
| 2015-01-01_00:59:00 | 86.2 | 90.5 |
| 2015-01-01_00:59:01 | 86.1 | 90.5 |
| 2015-01-01_00:59:02 | 86 | 90.5 |
| 2015-01-01_00:59:03 | 85.9 | 90.5 |
| 2015-01-01_00:59:04 | 85.8 | 90.5 |
| 2015-01-01_00:59:05 | 85.6 | 90.5 |
| 2015-01-01_00:59:06 | 85.6 | 90.6 |
| 2015-01-01_00:59:07 | 85.6 | 90.6 |
| 2015-01-01_00:59:08 | 85.3 | 90.6 |
| 2015-01-01_00:59:09 | 85.3 | 90.6 |
| 2015-01-01_00:59:10 | 85.1 | 90.6 |
| 2015-01-01_00:59:11 | 85 | 90.6 |
| 2015-01-01_00:59:12 | 84.7 | 90.6 |
| 2015-01-01_00:59:13 | 84.4 | 90.6 |
| 2015-01-01_00:59:14 | 84.6 | 90.8 |
| 2015-01-01_00:59:15 | 84.2 | 90.8 |
| 2015-01-01_00:59:16 | 84.3 | 90.8 |
| 2015-01-01_00:59:17 | 84.4 | 90.8 |
| 2015-01-01_00:59:18 | 84.3 | 90.8 |
| 2015-01-01_00:59:19 | 83.7 | 90.8 |
| 2015-01-01_00:59:20 | 84.3 | 90.8 |
| 2015-01-01_00:59:21 | 84.4 | 90.8 |
| 2015-01-01_00:59:22 | 85 | 90.8 |
| 2015-01-01_00:59:23 | 85 | 90.8 |
| 2015-01-01_00:59:24 | 84.9 | 90.8 |
| 2015-01-01_00:59:25 | 85 | 90.8 |
| 2015-01-01_00:59:26 | 85.2 | 90.8 |
| 2015-01-01_00:59:27 | 85.8 | 90.8 |
| 2015-01-01_00:59:28 | 85.4 | 90.8 |
| 2015-01-01_00:59:29 | 85.6 | 90.8 |
| 2015-01-01_00:59:30 | 86.1 | 90.8 |
| 2015-01-01_00:59:31 | 86 | 90.8 |
| 2015-01-01_00:59:32 | 86.2 | 90.8 |
| 2015-01-01_00:59:33 | 86.5 | 90.8 |
| 2015-01-01_00:59:34 | 87.1 | 90.8 |
| 2015-01-01_00:59:35 | 87.5 | 90.8 |
| 2015-01-01_00:59:36 | 87.1 | 90.8 |
| 2015-01-01_00:59:37 | 87.5 | 90.8 |
| 2015-01-01_00:59:38 | 87.6 | 90.8 |
| 2015-01-01_00:59:39 | 87.8 | 90.8 |
| 2015-01-01_00:59:40 | 87.9 | 90.8 |
| 2015-01-01_00:59:41 | 87.8 | 90.8 |
| 2015-01-01_00:59:42 | 87.7 | 90.8 |
| 2015-01-01_00:59:43 | 88.3 | 90.8 |
| 2015-01-01_00:59:44 | 88.6 | 90.8 |
| 2015-01-01_00:59:45 | 89.3 | 90.8 |
| 2015-01-01_00:59:46 | 89.5 | 90.2 |
| 2015-01-01_00:59:47 | 89.8 | 90.2 |
| 2015-01-01_00:59:48 | 89.6 | 90.2 |
| 2015-01-01_00:59:49 | 89.3 | 90.2 |
| 2015-01-01_00:59:50 | 89 | 90.2 |
| 2015-01-01_00:59:51 | 89 | 90.2 |
| 2015-01-01_00:59:52 | 88.9 | 90.2 |
| 2015-01-01_00:59:53 | 88.9 | 90.2 |
| 2015-01-01_00:59:54 | 88.8 | 89.8 |
| 2015-01-01_00:59:55 | 88.7 | 89.8 |
| 2015-01-01_00:59:56 | 88.6 | 89.8 |
| 2015-01-01_00:59:57 | 88.6 | 89.8 |
| 2015-01-01_00:59:58 | 88.8 | 89.8 |
| 2015-01-01_00:59:59 | 88.4 | 89.8 |
| 2015-01-01_01:00:01 | 88.8 | 89.8 |
| 2015-01-01_01:00:02 | 88.5 | 89.5 |
| 2015-01-01_01:00:03 | 88.7 | 89.5 |
| 2015-01-01_01:00:04 | 88.7 | 89.5 |
| 2015-01-01_01:00:05 | 88.8 | 89.5 |
| 2015-01-01_01:00:06 | 88.9 | 89.5 |
| 2015-01-01_01:00:07 | 88.9 | 89.5 |
| 2015-01-01_01:00:08 | 88.6 | 89.5 |
| 2015-01-01_01:00:09 | 88.9 | 89.5 |
| 2015-01-01_01:00:10 | 88.6 | 89.3 |
| 2015-01-01_01:00:11 | 88.6 | 89.3 |
| 2015-01-01_01:00:12 | 88.7 | 89.3 |
| 2015-01-01_01:00:13 | 88.7 | 89.3 |
| 2015-01-01_01:00:14 | 88.6 | 89.3 |
| 2015-01-01_01:00:15 | 88.8 | 89.3 |
| 2015-01-01_01:00:16 | 88.4 | 89.3 |
| 2015-01-01_01:00:17 | 88.7 | 89.3 |
| 2015-01-01_01:00:18 | 88.4 | 89.1 |
| 2015-01-01_01:00:19 | 88.4 | 89.1 |
| 2015-01-01_01:00:20 | 88.4 | 89.1 |
| 2015-01-01_01:00:21 | 88 | 89.1 |
| 2015-01-01_01:00:22 | 88 | 89.1 |
| 2015-01-01_01:00:23 | 88.2 | 89.1 |
| 2015-01-01_01:00:24 | 87.9 | 89.1 |
| 2015-01-01_01:00:25 | 87.9 | 89.1 |
| 2015-01-01_01:00:26 | 87.8 | 89 |
| 2015-01-01_01:00:27 | 87.6 | 89 |
| 2015-01-01_01:00:28 | 87.4 | 89 |
| 2015-01-01_01:00:29 | 87.5 | 89 |
| 2015-01-01_01:00:30 | 87.2 | 89 |
| 2015-01-01_01:00:31 | 87.2 | 89 |
| 2015-01-01_01:00:32 | 86.8 | 89 |
| 2015-01-01_01:00:33 | 86.5 | 89 |
| 2015-01-01_01:00:34 | 86.7 | 88.9 |
| 2015-01-01_01:00:35 | 86.8 | 88.9 |
| 2015-01-01_01:00:36 | 87.1 | 88.9 |
| 2015-01-01_01:00:37 | 86.7 | 88.9 |
| 2015-01-01_01:00:38 | 87.1 | 88.9 |
| 2015-01-01_01:00:39 | 86.9 | 88.9 |
| 2015-01-01_01:00:40 | 87.2 | 88.9 |
| 2015-01-01_01:00:41 | 87 | 88.9 |
| 2015-01-01_01:00:42 | 87.6 | 88.7 |
| 2015-01-01_01:00:43 | 87.6 | 88.7 |
| 2015-01-01_01:00:44 | 87.7 | 88.7 |
| 2015-01-01_01:00:45 | 87.4 | 88.7 |
| 2015-01-01_01:00:46 | 87.3 | 88.7 |
| 2015-01-01_01:00:47 | 87.3 | 88.7 |
| 2015-01-01_01:00:48 | 87 | 88.7 |
| 2015-01-01_01:00:49 | 87 | 88.7 |
| 2015-01-01_01:00:50 | 86.6 | 88.5 |
| 2015-01-01_01:00:51 | 86.7 | 88.5 |
| 2015-01-01_01:00:52 | 86.4 | 88.5 |
| 2015-01-01_01:00:53 | 86 | 88.5 |
| 2015-01-01_01:00:54 | 85.6 | 88.5 |
| 2015-01-01_01:00:55 | 84.9 | 88.5 |
| 2015-01-01_01:00:56 | 85.6 | 88.5 |
| 2015-01-01_01:00:57 | 85.9 | 88.5 |
| 2015-01-01_01:00:58 | 85.8 | 88.4 |
| 2015-01-01_01:00:59 | 86.2 | 88.4 |
| 2015-01-01_01:01:00 | 86.9 | 88.4 |
| 2015-01-01_01:01:01 | 86.7 | 88.4 |
| 2015-01-01_01:01:02 | 86.6 | 88.4 |
| 2015-01-01_01:01:03 | 86.8 | 88.4 |
| 2015-01-01_01:01:04 | 86.7 | 88.4 |
| 2015-01-01_01:01:05 | 86.9 | 88.4 |
| 2015-01-01_01:01:06 | 86.6 | 88.3 |
| 2015-01-01_01:01:07 | 86.9 | 88.3 |
| 2015-01-01_01:01:08 | 86.9 | 88.3 |
| 2015-01-01_01:01:09 | 87.4 | 88.3 |
| 2015-01-01_01:01:10 | 87.1 | 88.3 |
| 2015-01-01_01:01:11 | 87.4 | 88.3 |
| 2015-01-01_01:01:12 | 87.3 | 88.3 |
| 2015-01-01_01:01:13 | 87.4 | 88.3 |
| 2015-01-01_01:01:14 | 87.5 | 88.2 |
| 2015-01-01_01:01:15 | 87.5 | 88.2 |
| 2015-01-01_01:01:16 | 87.9 | 88.2 |
| 2015-01-01_01:01:17 | 87.9 | 88.2 |
| 2015-01-01_01:01:18 | 87.8 | 88.2 |
| 2015-01-01_01:01:19 | 88 | 88.2 |
| 2015-01-01_01:01:20 | 88.2 | 88.2 |
| 2015-01-01_01:01:21 | 88.3 | 88.2 |
| 2015-01-01_01:01:22 | 87.8 | 88.1 |
| 2015-01-01_01:01:23 | 88.1 | 88.1 |
| 2015-01-01_01:01:24 | 88.4 | 88.1 |
| 2015-01-01_01:01:25 | 88.2 | 88.1 |
| 2015-01-01_01:01:26 | 88.5 | 88.1 |
| 2015-01-01_01:01:27 | 88.4 | 88.1 |
| 2015-01-01_01:01:28 | 88.2 | 88.1 |
| 2015-01-01_01:01:29 | 88.3 | 88.1 |
| 2015-01-01_01:01:30 | 88.3 | 88 |
| 2015-01-01_01:01:31 | 88.4 | 88 |
| 2015-01-01_01:01:32 | 88.2 | 88 |
| 2015-01-01_01:01:33 | 88.4 | 88 |
| 2015-01-01_01:01:34 | 88.4 | 88 |
| 2015-01-01_01:01:35 | 88.5 | 88 |
| 2015-01-01_01:01:36 | 88.3 | 88 |
| 2015-01-01_01:01:37 | 88.6 | 88 |
| 2015-01-01_01:01:38 | 88.1 | 87.8 |
| 2015-01-01_01:01:39 | 88.8 | 87.8 |
| 2015-01-01_01:01:40 | 88.5 | 87.8 |
| 2015-01-01_01:01:41 | 88.4 | 87.8 |
| 2015-01-01_01:01:42 | 88.6 | 87.8 |
| 2015-01-01_01:01:43 | 88.4 | 87.8 |
| 2015-01-01_01:01:44 | 88.4 | 87.8 |
| 2015-01-01_01:01:45 | 88.2 | 87.8 |
| 2015-01-01_01:01:46 | 88.5 | 87.7 |
| 2015-01-01_01:01:47 | 88.1 | 87.7 |
| 2015-01-01_01:01:48 | 88.3 | 87.7 |
| 2015-01-01_01:01:49 | 88.5 | 87.7 |
| 2015-01-01_01:01:50 | 88.3 | 87.7 |
| 2015-01-01_01:01:51 | 87.9 | 87.7 |
| 2015-01-01_01:01:52 | 88.3 | 87.7 |
| 2015-01-01_01:01:53 | 87.7 | 87.7 |
| 2015-01-01_01:01:54 | 88.3 | 87.7 |
| 2015-01-01_01:01:55 | 88.2 | 87.7 |
| 2015-01-01_01:01:56 | 88.4 | 87.7 |
| 2015-01-01_01:01:57 | 87.7 | 87.7 |
| 2015-01-01_01:01:58 | 88.5 | 87.7 |
| 2015-01-01_01:01:59 | 88.4 | 87.7 |
| 2015-01-01_01:02:00 | 88.1 | 87.7 |
| 2015-01-01_01:02:01 | 88.3 | 87.7 |
| 2015-01-01_01:02:02 | 88.3 | 87.6 |
| 2015-01-01_01:02:03 | 88.1 | 87.6 |
| 2015-01-01_01:02:04 | 88.2 | 87.6 |
| 2015-01-01_01:02:05 | 88.6 | 87.6 |
| 2015-01-01_01:02:06 | 88.4 | 87.6 |
| 2015-01-01_01:02:07 | 88.4 | 87.6 |
| 2015-01-01_01:02:08 | 88.4 | 87.6 |
| 2015-01-01_01:02:09 | 88.4 | 87.6 |
| 2015-01-01_01:02:10 | 88.4 | 87.5 |
| 2015-01-01_01:02:11 | 88.8 | 87.5 |
| 2015-01-01_01:02:12 | 88.6 | 87.5 |
| 2015-01-01_01:02:13 | 88.4 | 87.5 |
| 2015-01-01_01:02:14 | 87.6 | 87.5 |
| 2015-01-01_01:02:15 | 87.8 | 87.5 |
| 2015-01-01_01:02:16 | 87.2 | 87.5 |
| 2015-01-01_01:02:17 | 87.5 | 87.5 |
| 2015-01-01_01:02:18 | 87.4 | 87.5 |
| 2015-01-01_01:02:19 | 87.7 | 87.5 |
| 2015-01-01_01:02:20 | 87.8 | 87.5 |
| 2015-01-01_01:02:21 | 87.4 | 87.5 |
| 2015-01-01_01:02:22 | 87.5 | 87.5 |
| 2015-01-01_01:02:23 | 87.6 | 87.5 |
| 2015-01-01_01:02:24 | 87.5 | 87.5 |
| 2015-01-01_01:02:25 | 87.5 | 87.5 |
| 2015-01-01_01:02:26 | 87.7 | 87.4 |
| 2015-01-01_01:02:27 | 87.5 | 87.4 |
| 2015-01-01_01:02:28 | 87.7 | 87.4 |
| 2015-01-01_01:02:29 | 88 | 87.4 |
| 2015-01-01_01:02:30 | 88.1 | 87.4 |
| 2015-01-01_01:02:31 | 87.7 | 87.4 |
| 2015-01-01_01:02:32 | 88.4 | 87.4 |
| 2015-01-01_01:02:33 | 88.1 | 87.4 |
| 2015-01-01_01:02:34 | 88 | 87.4 |
| 2015-01-01_01:02:35 | 87.7 | 87.4 |
| 2015-01-01_01:02:36 | 87.9 | 87.4 |
| 2015-01-01_01:02:37 | 88.2 | 87.4 |
| 2015-01-01_01:02:38 | 88 | 87.4 |
| 2015-01-01_01:02:39 | 88.1 | 87.4 |
| 2015-01-01_01:02:40 | 87.9 | 87.4 |
| 2015-01-01_01:02:41 | 88.3 | 87.4 |
| 2015-01-01_01:02:42 | 88 | 87.5 |
| 2015-01-01_01:02:43 | 88.4 | 87.5 |
| 2015-01-01_01:02:44 | 87.9 | 87.5 |
| 2015-01-01_01:02:45 | 88 | 87.5 |
| 2015-01-01_01:02:46 | 88 | 87.5 |
| 2015-01-01_01:02:47 | 87.7 | 87.5 |
| 2015-01-01_01:02:48 | 87.7 | 87.5 |
| 2015-01-01_01:02:49 | 88 | 87.5 |
| 2015-01-01_01:02:50 | 88 | 87.5 |
| 2015-01-01_01:02:51 | 87.9 | 87.5 |
| 2015-01-01_01:02:52 | 87.8 | 87.5 |
| 2015-01-01_01:02:53 | 87.4 | 87.5 |
| 2015-01-01_01:02:54 | 87.7 | 87.5 |
| 2015-01-01_01:02:55 | 87.6 | 87.5 |
| 2015-01-01_01:02:56 | 87.6 | 87.5 |
| 2015-01-01_01:02:57 | 87.6 | 87.5 |
| 2015-01-01_01:02:58 | 87.6 | 87.5 |
| 2015-01-01_01:02:59 | 87.6 | 87.5 |
| 2015-01-01_01:03:00 | 88 | 87.5 |
| 2015-01-01_01:03:01 | 88.1 | 87.5 |
| 2015-01-01_01:03:02 | 88.2 | 87.5 |
| 2015-01-01_01:03:03 | 88.1 | 87.5 |
| 2015-01-01_01:03:04 | 88 | 87.5 |
| 2015-01-01_01:03:05 | 88.3 | 87.5 |
| 2015-01-01_01:03:06 | 88.4 | 87.5 |
| 2015-01-01_01:03:07 | 88.1 | 87.5 |
| 2015-01-01_01:03:08 | 88.4 | 87.5 |
| 2015-01-01_01:03:09 | 88.3 | 87.5 |
| 2015-01-01_01:03:10 | 88.5 | 87.5 |
| 2015-01-01_01:03:11 | 88.2 | 87.5 |
| 2015-01-01_01:03:12 | 88.8 | 87.5 |
| 2015-01-01_01:03:13 | 88.6 | 87.5 |
| 2015-01-01_01:03:14 | 89.2 | 87.4 |
| 2015-01-01_01:03:15 | 88.8 | 87.4 |
| 2015-01-01_01:03:16 | 88.5 | 87.4 |
| 2015-01-01_01:03:17 | 89.1 | 87.4 |
| 2015-01-01_01:03:18 | 89.3 | 87.4 |
| 2015-01-01_01:03:19 | 89.5 | 87.4 |
| 2015-01-01_01:03:20 | 89.8 | 87.4 |
| 2015-01-01_01:03:21 | 90.8 | 87.4 |
| 2015-01-01_01:03:22 | 91 | 87.3 |
| 2015-01-01_01:03:23 | 90.8 | 87.3 |
| 2015-01-01_01:03:24 | 90.6 | 87.3 |
| 2015-01-01_01:03:25 | 90.2 | 87.3 |
| 2015-01-01_01:03:26 | 89.9 | 87.3 |
| 2015-01-01_01:03:27 | 90.1 | 87.3 |
| 2015-01-01_01:03:28 | 90 | 87.3 |
| 2015-01-01_01:03:29 | 90 | 87.3 |
| 2015-01-01_01:03:30 | 89.9 | 87.3 |
| 2015-01-01_01:03:31 | 89.8 | 87.3 |
| 2015-01-01_01:03:32 | 89.7 | 87.3 |
| 2015-01-01_01:03:33 | 89.5 | 87.3 |
| 2015-01-01_01:03:34 | 89.6 | 87.3 |
| 2015-01-01_01:03:35 | 89.4 | 87.3 |
| 2015-01-01_01:03:36 | 89.7 | 87.3 |
| 2015-01-01_01:03:37 | 89.5 | 87.3 |
| 2015-01-01_01:03:38 | 89.3 | 87.5 |
| 2015-01-01_01:03:39 | 89.2 | 87.5 |
| 2015-01-01_01:03:40 | 88.8 | 87.5 |
| 2015-01-01_01:03:41 | 88.7 | 87.5 |
| 2015-01-01_01:03:42 | 88.6 | 87.5 |
| 2015-01-01_01:03:43 | 88.4 | 87.5 |
| 2015-01-01_01:03:44 | 87.7 | 87.5 |
| 2015-01-01_01:03:45 | 88.2 | 87.5 |
| 2015-01-01_01:03:46 | 87.6 | 87.9 |
| 2015-01-01_01:03:47 | 87.9 | 87.9 |
| 2015-01-01_01:03:48 | 88 | 87.9 |
| 2015-01-01_01:03:49 | 88.3 | 87.9 |
| 2015-01-01_01:03:50 | 88.5 | 87.9 |
| 2015-01-01_01:03:51 | 88.7 | 87.9 |
| 2015-01-01_01:03:52 | 88.6 | 87.9 |
| 2015-01-01_01:03:53 | 88.6 | 87.9 |
| 2015-01-01_01:03:54 | 88.6 | 88.3 |
| 2015-01-01_01:03:55 | 88.4 | 88.3 |
| 2015-01-01_01:03:56 | 88.2 | 88.3 |
| 2015-01-01_01:03:57 | 88.3 | 88.3 |
| 2015-01-01_01:03:58 | 88 | 88.3 |
| 2015-01-01_01:03:59 | 87.8 | 88.3 |
| 2015-01-01_01:04:00 | 87.9 | 88.3 |
| 2015-01-01_01:04:01 | 87.4 | 88.3 |
| 2015-01-01_01:04:02 | 87.4 | 88.6 |
| 2015-01-01_01:04:03 | 86.9 | 88.6 |
| 2015-01-01_01:04:04 | 86.7 | 88.6 |
| 2015-01-01_01:04:05 | 87 | 88.6 |
| 2015-01-01_01:04:06 | 87.1 | 88.6 |
| 2015-01-01_01:04:07 | 87.1 | 88.6 |
| 2015-01-01_01:04:08 | 87 | 88.6 |
| 2015-01-01_01:04:09 | 86.9 | 88.6 |
| 2015-01-01_01:04:10 | 87 | 88.8 |
| 2015-01-01_01:04:11 | 86.7 | 88.8 |
| 2015-01-01_01:04:12 | 86.5 | 88.8 |
| 2015-01-01_01:04:13 | 86.4 | 88.8 |
| 2015-01-01_01:04:14 | 85.9 | 88.8 |
| 2015-01-01_01:04:15 | 86 | 88.8 |
| 2015-01-01_01:04:16 | 86 | 88.8 |
| 2015-01-01_01:04:17 | 85.9 | 88.8 |
| 2015-01-01_01:04:18 | 85.8 | 88.9 |
| 2015-01-01_01:04:19 | 85.5 | 88.9 |
| 2015-01-01_01:04:20 | 85.8 | 88.9 |
| 2015-01-01_01:04:21 | 86 | 88.9 |
| 2015-01-01_01:04:22 | 85.7 | 88.9 |
| 2015-01-01_01:04:23 | 86 | 88.9 |
| 2015-01-01_01:04:24 | 85.8 | 88.9 |
| 2015-01-01_01:04:25 | 86.1 | 88.9 |
| 2015-01-01_01:04:26 | 86 | 89.1 |
| 2015-01-01_01:04:27 | 86.2 | 89.1 |
| 2015-01-01_01:04:28 | 86.3 | 89.1 |
| 2015-01-01_01:04:29 | 86.2 | 89.1 |
| 2015-01-01_01:04:30 | 86 | 89.1 |
| 2015-01-01_01:04:31 | 86.1 | 89.1 |
| 2015-01-01_01:04:32 | 85.9 | 89.1 |
| 2015-01-01_01:04:33 | 86.2 | 89.1 |
| 2015-01-01_01:04:34 | 85.8 | 89.2 |
| 2015-01-01_01:04:35 | 86 | 89.2 |
| 2015-01-01_01:04:36 | 86 | 89.2 |
| 2015-01-01_01:04:37 | 85.7 | 89.2 |
| 2015-01-01_01:04:38 | 85.7 | 89.2 |
| 2015-01-01_01:04:39 | 85.9 | 89.2 |
| 2015-01-01_01:04:40 | 85.6 | 89.2 |
| 2015-01-01_01:04:41 | 85.8 | 89.2 |
| 2015-01-01_01:04:42 | 85.7 | 89.3 |
| 2015-01-01_01:04:43 | 85.4 | 89.3 |
| 2015-01-01_01:04:44 | 85.6 | 89.3 |
| 2015-01-01_01:04:45 | 85.6 | 89.3 |
| 2015-01-01_01:04:46 | 85.4 | 89.3 |
| 2015-01-01_01:04:47 | 85.7 | 89.3 |
| 2015-01-01_01:04:48 | 85.3 | 89.3 |
| 2015-01-01_01:04:49 | 85.7 | 89.3 |
| 2015-01-01_01:04:50 | 85.9 | 89.3 |
| 2015-01-01_01:04:51 | 85.8 | 89.3 |
| 2015-01-01_01:04:52 | 86.2 | 89.3 |
| 2015-01-01_01:04:53 | 86.3 | 89.3 |
| 2015-01-01_01:04:54 | 86.1 | 89.3 |
| 2015-01-01_01:04:55 | 86.1 | 89.3 |
| 2015-01-01_01:04:56 | 86.1 | 89.3 |
| 2015-01-01_01:04:57 | 86 | 89.3 |
| 2015-01-01_01:04:58 | 85.9 | 89.3 |
| 2015-01-01_01:04:59 | 85.8 | 89.3 |
| 2015-01-01_01:05:00 | 85.2 | 89.3 |
| 2015-01-01_01:05:01 | 85.6 | 89.3 |
| 2015-01-01_01:05:02 | 85.3 | 89.3 |
| 2015-01-01_01:05:03 | 85.2 | 89.3 |
| 2015-01-01_01:05:04 | 85.7 | 89.3 |
| 2015-01-01_01:05:05 | 85.5 | 89.3 |
| 2015-01-01_01:05:06 | 85.4 | 89.1 |
| 2015-01-01_01:05:07 | 85.2 | 89.1 |
| 2015-01-01_01:05:08 | 85.3 | 89.1 |
| 2015-01-01_01:05:09 | 85.1 | 89.1 |
| 2015-01-01_01:05:10 | 85.1 | 89.1 |
| 2015-01-01_01:05:11 | 85.2 | 89.1 |
| 2015-01-01_01:05:12 | 85.1 | 89.1 |
| 2015-01-01_01:05:13 | 85.1 | 89.1 |
| 2015-01-01_01:05:14 | 85 | 89 |
| 2015-01-01_01:05:15 | 84.7 | 89 |
| 2015-01-01_01:05:16 | 85.1 | 89 |
| 2015-01-01_01:05:17 | 85.4 | 89 |
| 2015-01-01_01:05:18 | 86 | 89 |
| 2015-01-01_01:05:19 | 86.2 | 89 |
| 2015-01-01_01:05:20 | 86.4 | 89 |
| 2015-01-01_01:05:21 | 86.1 | 89 |
| 2015-01-01_01:05:22 | 86.2 | 89 |
| 2015-01-01_01:05:23 | 86.3 | 89 |
| 2015-01-01_01:05:24 | 86.1 | 89 |
| 2015-01-01_01:05:25 | 85.9 | 89 |
| 2015-01-01_01:05:26 | 85.6 | 89 |
| 2015-01-01_01:05:27 | 85.6 | 89 |
| 2015-01-01_01:05:28 | 85.8 | 89 |
| 2015-01-01_01:05:29 | 85.6 | 89 |
| 2015-01-01_01:05:30 | 86 | 88.9 |
| 2015-01-01_01:05:31 | 85.8 | 88.9 |
| 2015-01-01_01:05:32 | 86.2 | 88.9 |
| 2015-01-01_01:05:33 | 86.2 | 88.9 |
| 2015-01-01_01:05:34 | 85.9 | 88.9 |
| 2015-01-01_01:05:35 | 85.8 | 88.9 |
| 2015-01-01_01:05:36 | 85.7 | 88.9 |
| 2015-01-01_01:05:37 | 85.9 | 88.9 |
| 2015-01-01_01:05:38 | 85.9 | 89.1 |
| 2015-01-01_01:05:39 | 86 | 89.1 |
| 2015-01-01_01:05:40 | 86 | 89.1 |
| 2015-01-01_01:05:41 | 85.8 | 89.1 |
| 2015-01-01_01:05:42 | 85.8 | 89.1 |
| 2015-01-01_01:05:43 | 85.6 | 89.1 |
| 2015-01-01_01:05:44 | 85.6 | 89.1 |
| 2015-01-01_01:05:45 | 85.4 | 89.1 |
| 2015-01-01_01:05:46 | 85.2 | 89.4 |
| 2015-01-01_01:05:47 | 85.4 | 89.4 |
| 2015-01-01_01:05:48 | 85.3 | 89.4 |
| 2015-01-01_01:05:49 | 85.6 | 89.4 |
| 2015-01-01_01:05:50 | 85.5 | 89.4 |
| 2015-01-01_01:05:51 | 85.4 | 89.4 |
| 2015-01-01_01:05:52 | 85.3 | 89.4 |
| 2015-01-01_01:05:53 | 85.2 | 89.4 |
| 2015-01-01_01:05:54 | 85 | 89.6 |
| 2015-01-01_01:05:55 | 85 | 89.6 |
| 2015-01-01_01:05:56 | 85.2 | 89.6 |
| 2015-01-01_01:05:57 | 85.3 | 89.6 |
| 2015-01-01_01:05:58 | 84.7 | 89.6 |
| 2015-01-01_01:05:59 | 85.4 | 89.6 |
| 2015-01-01_01:06:00 | 85.2 | 89.6 |
| 2015-01-01_01:06:01 | 85.6 | 89.6 |
| 2015-01-01_01:06:02 | 85.3 | 89.6 |
| 2015-01-01_01:06:03 | 85.1 | 89.6 |
| 2015-01-01_01:06:04 | 85.8 | 89.6 |
| 2015-01-01_01:06:05 | 85.1 | 89.6 |
| 2015-01-01_01:06:06 | 85.9 | 89.6 |
| 2015-01-01_01:06:07 | 85.9 | 89.6 |
| 2015-01-01_01:06:08 | 85.8 | 89.6 |
| 2015-01-01_01:06:09 | 86.1 | 89.6 |
| 2015-01-01_01:06:10 | 86.1 | 89.5 |
| 2015-01-01_01:06:11 | 85.8 | 89.5 |
| 2015-01-01_01:06:12 | 86.5 | 89.5 |
| 2015-01-01_01:06:13 | 86.3 | 89.5 |
| 2015-01-01_01:06:14 | 86.3 | 89.5 |
| 2015-01-01_01:06:15 | 86.2 | 89.5 |
| 2015-01-01_01:06:16 | 86.3 | 89.5 |
| 2015-01-01_01:06:17 | 86.2 | 89.5 |
| 2015-01-01_01:06:18 | 86 | 89.5 |
| 2015-01-01_01:06:19 | 86 | 89.5 |
| 2015-01-01_01:06:20 | 85.6 | 89.5 |
| 2015-01-01_01:06:21 | 85.9 | 89.5 |
| 2015-01-01_01:06:22 | 86 | 89.5 |
| 2015-01-01_01:06:23 | 85.7 | 89.5 |
| 2015-01-01_01:06:24 | 85.5 | 89.5 |
| 2015-01-01_01:06:25 | 85.5 | 89.5 |
| 2015-01-01_01:06:26 | 85.6 | 89.1 |
| 2015-01-01_01:06:27 | 85.7 | 89.1 |
| 2015-01-01_01:06:28 | 85.6 | 89.1 |
| 2015-01-01_01:06:29 | 85.6 | 89.1 |
| 2015-01-01_01:06:30 | 85.6 | 89.1 |
| 2015-01-01_01:06:31 | 85.4 | 89.1 |
| 2015-01-01_01:06:32 | 85.4 | 89.1 |
| 2015-01-01_01:06:33 | 85.4 | 89.1 |
| 2015-01-01_01:06:34 | 85.2 | 88.9 |
| 2015-01-01_01:06:35 | 85.2 | 88.9 |
| 2015-01-01_01:06:36 | 84.8 | 88.9 |
| 2015-01-01_01:06:37 | 84.7 | 88.9 |
| 2015-01-01_01:06:38 | 84.8 | 88.9 |
| 2015-01-01_01:06:39 | 84.6 | 88.9 |
| 2015-01-01_01:06:40 | 84.8 | 88.9 |
| 2015-01-01_01:06:41 | 84.8 | 88.9 |
| 2015-01-01_01:06:42 | 85 | 88.6 |
| 2015-01-01_01:06:43 | 85 | 88.6 |
| 2015-01-01_01:06:44 | 85 | 88.6 |
| 2015-01-01_01:06:45 | 85 | 88.6 |
| 2015-01-01_01:06:46 | 85.1 | 88.6 |
| 2015-01-01_01:06:47 | 85 | 88.6 |
| 2015-01-01_01:06:48 | 84.8 | 88.6 |
| 2015-01-01_01:06:49 | 84.9 | 88.6 |
| 2015-01-01_01:06:50 | 84.8 | 88.5 |
| 2015-01-01_01:06:51 | 84.8 | 88.5 |
| 2015-01-01_01:06:52 | 84.9 | 88.5 |
| 2015-01-01_01:06:53 | 84.9 | 88.5 |
| 2015-01-01_01:06:54 | 84.7 | 88.5 |
| 2015-01-01_01:06:55 | 85 | 88.5 |
| 2015-01-01_01:06:56 | 85.2 | 88.5 |
| 2015-01-01_01:06:57 | 84.9 | 88.5 |
| 2015-01-01_01:06:58 | 85 | 88.5 |
| 2015-01-01_01:06:59 | 85.1 | 88.5 |
| 2015-01-01_01:07:00 | 84.7 | 88.5 |
| 2015-01-01_01:07:01 | 84.8 | 88.5 |
| 2015-01-01_01:07:02 | 85.2 | 88.5 |
| 2015-01-01_01:07:03 | 85.1 | 88.5 |
| 2015-01-01_01:07:04 | 84.9 | 88.5 |
| 2015-01-01_01:07:05 | 85 | 88.5 |
| 2015-01-01_01:07:06 | 85 | 88.6 |
| 2015-01-01_01:07:07 | 85 | 88.6 |
| 2015-01-01_01:07:08 | 85.1 | 88.6 |
| 2015-01-01_01:07:09 | 85 | 88.6 |
| 2015-01-01_01:07:10 | 85.3 | 88.6 |
| 2015-01-01_01:07:11 | 85 | 88.6 |
| 2015-01-01_01:07:12 | 85.1 | 88.6 |
| 2015-01-01_01:07:13 | 85.1 | 88.6 |
| 2015-01-01_01:07:14 | 85.1 | 88.8 |
| 2015-01-01_01:07:15 | 85.1 | 88.8 |
| 2015-01-01_01:07:16 | 85.2 | 88.8 |
| 2015-01-01_01:07:17 | 85.2 | 88.8 |
| 2015-01-01_01:07:18 | 85.3 | 88.8 |
| 2015-01-01_01:07:19 | 85.2 | 88.8 |
| 2015-01-01_01:07:20 | 85.1 | 88.8 |
| 2015-01-01_01:07:21 | 85.3 | 88.8 |
| 2015-01-01_01:07:22 | 85 | 89 |
| 2015-01-01_01:07:23 | 85.3 | 89 |
| 2015-01-01_01:07:24 | 85.2 | 89 |
| 2015-01-01_01:07:25 | 85.4 | 89 |
| 2015-01-01_01:07:26 | 85.3 | 89 |
| 2015-01-01_01:07:27 | 85.2 | 89 |
| 2015-01-01_01:07:28 | 85.4 | 89 |
| 2015-01-01_01:07:29 | 85.1 | 89 |
| 2015-01-01_01:07:30 | 85.3 | 89.1 |
| 2015-01-01_01:07:31 | 85.3 | 89.1 |
| 2015-01-01_01:07:32 | 85.4 | 89.1 |
| 2015-01-01_01:07:33 | 85.5 | 89.1 |
| 2015-01-01_01:07:34 | 85.2 | 89.1 |
| 2015-01-01_01:07:35 | 84.8 | 89.1 |
| 2015-01-01_01:07:36 | 85.3 | 89.1 |
| 2015-01-01_01:07:37 | 85.3 | 89.1 |
| 2015-01-01_01:07:38 | 85.5 | 89.3 |
| 2015-01-01_01:07:39 | 85 | 89.3 |
| 2015-01-01_01:07:40 | 85.6 | 89.3 |
| 2015-01-01_01:07:41 | 85.8 | 89.3 |
| 2015-01-01_01:07:42 | 85.6 | 89.3 |
| 2015-01-01_01:07:43 | 86.1 | 89.3 |
| 2015-01-01_01:07:44 | 86.4 | 89.3 |
| 2015-01-01_01:07:45 | 86.5 | 89.3 |
| 2015-01-01_01:07:46 | 86.7 | 89.5 |
| 2015-01-01_01:07:47 | 86.6 | 89.5 |
| 2015-01-01_01:07:48 | 86.6 | 89.5 |
| 2015-01-01_01:07:49 | 87.4 | 89.5 |
| 2015-01-01_01:07:50 | 87.9 | 89.5 |
| 2015-01-01_01:07:51 | 88.2 | 89.5 |
| 2015-01-01_01:07:52 | 88.2 | 89.5 |
| 2015-01-01_01:07:53 | 87.9 | 89.5 |
| 2015-01-01_01:07:54 | 87.9 | 89.6 |
| 2015-01-01_01:07:55 | 87.6 | 89.6 |
| 2015-01-01_01:07:56 | 88.6 | 89.6 |
| 2015-01-01_01:07:57 | 88.5 | 89.6 |
| 2015-01-01_01:07:58 | 88.7 | 89.6 |
| 2015-01-01_01:07:59 | 89.2 | 89.6 |
| 2015-01-01_01:08:00 | 89.4 | 89.6 |
| 2015-01-01_01:08:01 | 89.5 | 89.6 |
| 2015-01-01_01:08:02 | 89.4 | 89.6 |
| 2015-01-01_01:08:03 | 89.1 | 89.6 |
| 2015-01-01_01:08:04 | 88.9 | 89.6 |
| 2015-01-01_01:08:05 | 88.5 | 89.6 |
| 2015-01-01_01:08:06 | 88.9 | 89.6 |
| 2015-01-01_01:08:07 | 88.8 | 89.6 |
| 2015-01-01_01:08:08 | 88.8 | 89.6 |
| 2015-01-01_01:08:09 | 88.9 | 89.6 |
| 2015-01-01_01:08:10 | 88.9 | 89.5 |
| 2015-01-01_01:08:11 | 89 | 89.5 |
| 2015-01-01_01:08:12 | 88.9 | 89.5 |
| 2015-01-01_01:08:13 | 89.4 | 89.5 |
| 2015-01-01_01:08:14 | 89.8 | 89.5 |
| 2015-01-01_01:08:15 | 90 | 89.5 |
| 2015-01-01_01:08:16 | 90.4 | 89.5 |
| 2015-01-01_01:08:17 | 90.6 | 89.5 |
| 2015-01-01_01:08:18 | 90.4 | 89.4 |
| 2015-01-01_01:08:19 | 90.2 | 89.4 |
| 2015-01-01_01:08:20 | 90.2 | 89.4 |
| 2015-01-01_01:08:21 | 89.5 | 89.4 |
| 2015-01-01_01:08:22 | 90 | 89.4 |
| 2015-01-01_01:08:23 | 89.8 | 89.4 |
| 2015-01-01_01:08:24 | 89.8 | 89.4 |
| 2015-01-01_01:08:25 | 89.2 | 89.4 |
| 2015-01-01_01:08:26 | 88.9 | 89 |
| 2015-01-01_01:08:27 | 88.7 | 89 |
| 2015-01-01_01:08:28 | 88.8 | 89 |
| 2015-01-01_01:08:29 | 88.4 | 89 |
| 2015-01-01_01:08:30 | 88.5 | 89 |
| 2015-01-01_01:08:31 | 87.9 | 89 |
| 2015-01-01_01:08:32 | 88.2 | 89 |
| 2015-01-01_01:08:33 | 88.4 | 89 |
| 2015-01-01_01:08:34 | 88.1 | 88.9 |
| 2015-01-01_01:08:35 | 88 | 88.9 |
| 2015-01-01_01:08:36 | 87.9 | 88.9 |
| 2015-01-01_01:08:37 | 87.6 | 88.9 |
| 2015-01-01_01:08:38 | 87.6 | 88.9 |
| 2015-01-01_01:08:39 | 87.5 | 88.9 |
| 2015-01-01_01:08:40 | 87.4 | 88.9 |
| 2015-01-01_01:08:41 | 87.3 | 88.9 |
| 2015-01-01_01:08:42 | 87 | 88.9 |
| 2015-01-01_01:08:43 | 87 | 88.9 |
| 2015-01-01_01:08:44 | 86.9 | 88.9 |
| 2015-01-01_01:08:45 | 86.7 | 88.9 |
| 2015-01-01_01:08:46 | 86.5 | 88.9 |
| 2015-01-01_01:08:47 | 86.2 | 88.9 |
| 2015-01-01_01:08:48 | 86.2 | 88.9 |
| 2015-01-01_01:08:49 | 86.3 | 88.9 |
| 2015-01-01_01:08:50 | 86.1 | 89.1 |
| 2015-01-01_01:08:51 | 86 | 89.1 |
| 2015-01-01_01:08:52 | 86.2 | 89.1 |
| 2015-01-01_01:08:53 | 86.4 | 89.1 |
| 2015-01-01_01:08:54 | 86.3 | 89.1 |
| 2015-01-01_01:08:55 | 86.3 | 89.1 |
| 2015-01-01_01:08:56 | 86.2 | 89.1 |
| 2015-01-01_01:08:57 | 86.1 | 89.1 |
| 2015-01-01_01:08:58 | 86.4 | 89.5 |
| 2015-01-01_01:08:59 | 86.4 | 89.5 |
| 2015-01-01_01:09:00 | 86.3 | 89.5 |
| 2015-01-01_01:09:01 | 85.2 | 89.5 |
| 2015-01-01_01:09:02 | 86.3 | 89.5 |
| 2015-01-01_01:09:03 | 86.2 | 89.5 |
| 2015-01-01_01:09:04 | 86.7 | 89.5 |
| 2015-01-01_01:09:05 | 86.2 | 89.5 |
| 2015-01-01_01:09:06 | 86.8 | 89.5 |
| 2015-01-01_01:09:07 | 87.6 | 89.5 |
| 2015-01-01_01:09:08 | 87.7 | 89.5 |
| 2015-01-01_01:09:09 | 87.8 | 89.5 |
| 2015-01-01_01:09:10 | 87.9 | 89.5 |
| 2015-01-01_01:09:11 | 88 | 89.5 |
| 2015-01-01_01:09:12 | 87.9 | 89.5 |
| 2015-01-01_01:09:13 | 87.7 | 89.5 |
| 2015-01-01_01:09:14 | 87.6 | 89.7 |
| 2015-01-01_01:09:15 | 87.6 | 89.7 |
| 2015-01-01_01:09:16 | 87.7 | 89.7 |
| 2015-01-01_01:09:17 | 87.6 | 89.7 |
| 2015-01-01_01:09:18 | 87.7 | 89.7 |
| 2015-01-01_01:09:19 | 87.5 | 89.7 |
| 2015-01-01_01:09:20 | 86.8 | 89.7 |
| 2015-01-01_01:09:21 | 86.9 | 89.7 |
| 2015-01-01_01:09:22 | 86.9 | 89.7 |
| 2015-01-01_01:09:23 | 86.8 | 89.7 |
| 2015-01-01_01:09:24 | 86.8 | 89.7 |
| 2015-01-01_01:09:25 | 86.6 | 89.7 |
| 2015-01-01_01:09:26 | 86.8 | 89.7 |
| 2015-01-01_01:09:27 | 86.8 | 89.7 |
| 2015-01-01_01:09:28 | 87.1 | 89.7 |
| 2015-01-01_01:09:29 | 87 | 89.7 |
| 2015-01-01_01:09:30 | 87.1 | 89.8 |
| 2015-01-01_01:09:31 | 86.9 | 89.8 |
| 2015-01-01_01:09:32 | 86.9 | 89.8 |
| 2015-01-01_01:09:33 | 86.6 | 89.8 |
| 2015-01-01_01:09:34 | 85.9 | 89.8 |
| 2015-01-01_01:09:35 | 86.4 | 89.8 |
| 2015-01-01_01:09:36 | 86 | 89.8 |
| 2015-01-01_01:09:37 | 85.9 | 89.8 |
| 2015-01-01_01:09:38 | 85.6 | 90 |
| 2015-01-01_01:09:39 | 86 | 90 |
| 2015-01-01_01:09:40 | 86.2 | 90 |
| 2015-01-01_01:09:41 | 86 | 90 |
| 2015-01-01_01:09:42 | 86.1 | 90 |
| 2015-01-01_01:09:43 | 86.1 | 90 |
| 2015-01-01_01:09:44 | 85.7 | 90 |
| 2015-01-01_01:09:45 | 85.9 | 90 |
| 2015-01-01_01:09:46 | 86 | 90.2 |
| 2015-01-01_01:09:47 | 86 | 90.2 |
| 2015-01-01_01:09:48 | 86.2 | 90.2 |
| 2015-01-01_01:09:49 | 86.4 | 90.2 |
| 2015-01-01_01:09:50 | 86.5 | 90.2 |
| 2015-01-01_01:09:51 | 86.5 | 90.2 |
| 2015-01-01_01:09:52 | 86.4 | 90.2 |
| 2015-01-01_01:09:53 | 86.7 | 90.2 |
| 2015-01-01_01:09:54 | 86.6 | 90.3 |
| 2015-01-01_01:09:55 | 86.2 | 90.3 |
| 2015-01-01_01:09:56 | 86.7 | 90.3 |
| 2015-01-01_01:09:57 | 86.6 | 90.3 |
| 2015-01-01_01:09:58 | 86.5 | 90.3 |
| 2015-01-01_01:09:59 | 86.8 | 90.3 |
| 2015-01-01_01:10:00 | 86.4 | 90.3 |
| 2015-01-01_01:10:01 | 86.8 | 90.3 |
| 2015-01-01_01:10:02 | 86.5 | 90.3 |
| 2015-01-01_01:10:03 | 86.9 | 90.3 |
| 2015-01-01_01:10:04 | 86.7 | 90.3 |
| 2015-01-01_01:10:05 | 86.7 | 90.3 |
| 2015-01-01_01:10:06 | 87.1 | 90.3 |
| 2015-01-01_01:10:07 | 87.4 | 90.3 |
| 2015-01-01_01:10:08 | 87.6 | 90.3 |
| 2015-01-01_01:10:09 | 87.8 | 90.3 |
| 2015-01-01_01:10:10 | 87.6 | 90.3 |
| 2015-01-01_01:10:11 | 87.2 | 90.3 |
| 2015-01-01_01:10:12 | 87.2 | 90.3 |
| 2015-01-01_01:10:13 | 86.6 | 90.3 |
| 2015-01-01_01:10:14 | 87.1 | 90.3 |
| 2015-01-01_01:10:15 | 87 | 90.3 |
| 2015-01-01_01:10:16 | 87.1 | 90.3 |
| 2015-01-01_01:10:17 | 87 | 90.3 |
| 2015-01-01_01:10:18 | 87.2 | 90.3 |
| 2015-01-01_01:10:19 | 87 | 90.3 |
| 2015-01-01_01:10:20 | 87.1 | 90.3 |
| 2015-01-01_01:10:21 | 86.8 | 90.3 |
| 2015-01-01_01:10:22 | 88.2 | 90.3 |
| 2015-01-01_01:10:23 | 88.6 | 90.3 |
| 2015-01-01_01:10:24 | 88.6 | 90.3 |
| 2015-01-01_01:10:25 | 88.7 | 90.3 |
| 2015-01-01_01:10:26 | 88.6 | 90.4 |
| 2015-01-01_01:10:27 | 88.5 | 90.4 |
| 2015-01-01_01:10:28 | 88.4 | 90.4 |
| 2015-01-01_01:10:29 | 87.9 | 90.4 |
| 2015-01-01_01:10:30 | 88 | 90.4 |
| 2015-01-01_01:10:31 | 88.1 | 90.4 |
| 2015-01-01_01:10:32 | 88.1 | 90.4 |
| 2015-01-01_01:10:33 | 88.4 | 90.4 |
| 2015-01-01_01:10:34 | 88.1 | 90.3 |
| 2015-01-01_01:10:35 | 88 | 90.3 |
| 2015-01-01_01:10:36 | 88.2 | 90.3 |
| 2015-01-01_01:10:37 | 88.7 | 90.3 |
| 2015-01-01_01:10:38 | 89.2 | 90.3 |
| 2015-01-01_01:10:39 | 89.8 | 90.3 |
| 2015-01-01_01:10:40 | 90 | 90.3 |
| 2015-01-01_01:10:41 | 89.9 | 90.3 |
| 2015-01-01_01:10:42 | 89.9 | 90.5 |
| 2015-01-01_01:10:43 | 89.7 | 90.5 |
| 2015-01-01_01:10:44 | 89.6 | 90.5 |
| 2015-01-01_01:10:45 | 89.3 | 90.5 |
| 2015-01-01_01:10:46 | 89.2 | 90.5 |
| 2015-01-01_01:10:47 | 88.8 | 90.5 |
| 2015-01-01_01:10:48 | 88.7 | 90.5 |
| 2015-01-01_01:10:49 | 88.5 | 90.5 |
| 2015-01-01_01:10:50 | 88.7 | 90.5 |
| 2015-01-01_01:10:51 | 88.8 | 90.5 |
| 2015-01-01_01:10:52 | 88.8 | 90.5 |
| 2015-01-01_01:10:53 | 89 | 90.5 |
| 2015-01-01_01:10:54 | 89.3 | 90.5 |
| 2015-01-01_01:10:55 | 90 | 90.5 |
| 2015-01-01_01:10:56 | 90 | 90.5 |
| 2015-01-01_01:10:57 | 90.9 | 90.5 |
| 2015-01-01_01:10:58 | 91.4 | 90.9 |
| 2015-01-01_01:10:59 | 91.6 | 90.9 |
| 2015-01-01_01:11:00 | 91.9 | 90.9 |
| 2015-01-01_01:11:01 | 92.5 | 90.9 |
| 2015-01-01_01:11:02 | 92.6 | 90.9 |
| 2015-01-01_01:11:03 | 93.4 | 90.9 |
| 2015-01-01_01:11:04 | 93.7 | 90.9 |
| 2015-01-01_01:11:05 | 93.6 | 90.9 |
| 2015-01-01_01:11:06 | 93.3 | 91 |
| 2015-01-01_01:11:07 | 93.2 | 91 |
| 2015-01-01_01:11:08 | 92.8 | 91 |
| 2015-01-01_01:11:09 | 92.6 | 91 |
| 2015-01-01_01:11:10 | 92.3 | 91 |
| 2015-01-01_01:11:11 | 91.9 | 91 |
| 2015-01-01_01:11:12 | 91.6 | 91 |
| 2015-01-01_01:11:13 | 91.3 | 91 |
| 2015-01-01_01:11:14 | 90.9 | 90.8 |
| 2015-01-01_01:11:15 | 90 | 90.8 |
| 2015-01-01_01:11:16 | 90.2 | 90.8 |
| 2015-01-01_01:11:17 | 89.7 | 90.8 |
| 2015-01-01_01:11:18 | 89.3 | 90.8 |
| 2015-01-01_01:11:19 | 89.1 | 90.8 |
| 2015-01-01_01:11:20 | 89.1 | 90.8 |
| 2015-01-01_01:11:21 | 88.8 | 90.8 |
| 2015-01-01_01:11:22 | 89 | 90.8 |
| 2015-01-01_01:11:23 | 88.8 | 90.8 |
| 2015-01-01_01:11:24 | 88.6 | 90.8 |
| 2015-01-01_01:11:25 | 88.5 | 90.8 |
| 2015-01-01_01:11:26 | 88.1 | 90.8 |
| 2015-01-01_01:11:27 | 88.1 | 90.8 |
| 2015-01-01_01:11:28 | 88 | 90.8 |
| 2015-01-01_01:11:29 | 88 | 90.8 |
| 2015-01-01_01:11:30 | 88.3 | 90.8 |
| 2015-01-01_01:11:31 | 88.4 | 90.8 |
| 2015-01-01_01:11:32 | 88.2 | 90.8 |
| 2015-01-01_01:11:33 | 88.1 | 90.8 |
| 2015-01-01_01:11:34 | 87.8 | 90.8 |
| 2015-01-01_01:11:35 | 88 | 90.8 |
| 2015-01-01_01:11:36 | 88.1 | 90.8 |
| 2015-01-01_01:11:37 | 87.8 | 90.8 |
| 2015-01-01_01:11:38 | 87.8 | 90.6 |
| 2015-01-01_01:11:39 | 88.1 | 90.6 |
| 2015-01-01_01:11:40 | 87.8 | 90.6 |
| 2015-01-01_01:11:41 | 87.8 | 90.6 |
| 2015-01-01_01:11:42 | 87.7 | 90.6 |
| 2015-01-01_01:11:43 | 87.4 | 90.6 |
| 2015-01-01_01:11:44 | 87 | 90.6 |
| 2015-01-01_01:11:45 | 86.5 | 90.6 |
| 2015-01-01_01:11:46 | 87 | 90.4 |
| 2015-01-01_01:11:47 | 87 | 90.4 |
| 2015-01-01_01:11:48 | 87.5 | 90.4 |
| 2015-01-01_01:11:49 | 87.1 | 90.4 |
| 2015-01-01_01:11:50 | 87.4 | 90.4 |
| 2015-01-01_01:11:51 | 87.6 | 90.4 |
| 2015-01-01_01:11:52 | 87.7 | 90.4 |
| 2015-01-01_01:11:53 | 87.7 | 90.4 |
| 2015-01-01_01:11:54 | 87.9 | 90.1 |
| 2015-01-01_01:11:55 | 87.8 | 90.1 |
| 2015-01-01_01:11:56 | 87.7 | 90.1 |
| 2015-01-01_01:11:57 | 87.3 | 90.1 |
| 2015-01-01_01:11:58 | 87.7 | 90.1 |
| 2015-01-01_01:11:59 | 87.3 | 90.1 |
| 2015-01-01_01:12:00 | 87.6 | 90.1 |
| 2015-01-01_01:12:01 | 87.7 | 90.1 |
| 2015-01-01_01:12:02 | 87.6 | 89.7 |
| 2015-01-01_01:12:03 | 87.2 | 89.7 |
| 2015-01-01_01:12:04 | 86.9 | 89.7 |
| 2015-01-01_01:12:05 | 86.8 | 89.7 |
| 2015-01-01_01:12:06 | 86.5 | 89.7 |
| 2015-01-01_01:12:07 | 86.9 | 89.7 |
| 2015-01-01_01:12:08 | 86.6 | 89.7 |
| 2015-01-01_01:12:09 | 86.6 | 89.7 |
| 2015-01-01_01:12:10 | 86.8 | 89.5 |
| 2015-01-01_01:12:11 | 86.7 | 89.5 |
| 2015-01-01_01:12:12 | 86.2 | 89.5 |
| 2015-01-01_01:12:13 | 86.4 | 89.5 |
| 2015-01-01_01:12:14 | 86.3 | 89.5 |
| 2015-01-01_01:12:15 | 86.3 | 89.5 |
| 2015-01-01_01:12:16 | 86.3 | 89.5 |
| 2015-01-01_01:12:17 | 86.4 | 89.5 |
| 2015-01-01_01:12:18 | 86.4 | 89.2 |
| 2015-01-01_01:12:19 | 86.1 | 89.2 |
| 2015-01-01_01:12:20 | 86.1 | 89.2 |
| 2015-01-01_01:12:21 | 86 | 89.2 |
| 2015-01-01_01:12:22 | 85.8 | 89.2 |
| 2015-01-01_01:12:23 | 85.5 | 89.2 |
| 2015-01-01_01:12:24 | 85.4 | 89.2 |
| 2015-01-01_01:12:25 | 85.1 | 89.2 |
| 2015-01-01_01:12:26 | 84.8 | 89 |
| 2015-01-01_01:12:27 | 84.6 | 89 |
| 2015-01-01_01:12:28 | 84.4 | 89 |
| 2015-01-01_01:12:29 | 84.2 | 89 |
| 2015-01-01_01:12:30 | 84.2 | 89 |
| 2015-01-01_01:12:31 | 84 | 89 |
| 2015-01-01_01:12:32 | 84.4 | 89 |
| 2015-01-01_01:12:33 | 84.6 | 89 |
| 2015-01-01_01:12:34 | 84.5 | 88.8 |
| 2015-01-01_01:12:35 | 84.6 | 88.8 |
| 2015-01-01_01:12:36 | 84.6 | 88.8 |
| 2015-01-01_01:12:37 | 84.9 | 88.8 |
| 2015-01-01_01:12:38 | 84.9 | 88.8 |
| 2015-01-01_01:12:39 | 84.6 | 88.8 |
| 2015-01-01_01:12:40 | 84.5 | 88.8 |
| 2015-01-01_01:12:41 | 84.4 | 88.8 |
| 2015-01-01_01:12:42 | 84.6 | 88.6 |
| 2015-01-01_01:12:43 | 84.7 | 88.6 |
| 2015-01-01_01:12:44 | 85 | 88.6 |
| 2015-01-01_01:12:45 | 85 | 88.6 |
| 2015-01-01_01:12:46 | 84.7 | 88.6 |
| 2015-01-01_01:12:47 | 84.9 | 88.6 |
| 2015-01-01_01:12:48 | 84.7 | 88.6 |
| 2015-01-01_01:12:49 | 85 | 88.6 |
| 2015-01-01_01:12:50 | 84.9 | 88.3 |
| 2015-01-01_01:12:51 | 84.6 | 88.3 |
| 2015-01-01_01:12:52 | 84.7 | 88.3 |
| 2015-01-01_01:12:53 | 84.7 | 88.3 |
| 2015-01-01_01:12:54 | 84.4 | 88.3 |
| 2015-01-01_01:12:55 | 84.3 | 88.3 |
| 2015-01-01_01:12:56 | 84.3 | 88.3 |
| 2015-01-01_01:12:57 | 84.3 | 88.3 |
| 2015-01-01_01:12:58 | 84.7 | 88.1 |
| 2015-01-01_01:12:59 | 84.6 | 88.1 |
| 2015-01-01_01:13:00 | 84.3 | 88.1 |
| 2015-01-01_01:13:01 | 84.4 | 88.1 |
| 2015-01-01_01:13:02 | 84.7 | 88.1 |
| 2015-01-01_01:13:03 | 84.6 | 88.1 |
| 2015-01-01_01:13:04 | 84.8 | 88.1 |
| 2015-01-01_01:13:05 | 84.7 | 88.1 |
| 2015-01-01_01:13:06 | 84.9 | 87.9 |
| 2015-01-01_01:13:07 | 84.4 | 87.9 |
| 2015-01-01_01:13:08 | 84.7 | 87.9 |
| 2015-01-01_01:13:09 | 84.9 | 87.9 |
| 2015-01-01_01:13:10 | 84.9 | 87.9 |
| 2015-01-01_01:13:11 | 84.6 | 87.9 |
| 2015-01-01_01:13:12 | 84.5 | 87.9 |
| 2015-01-01_01:13:13 | 84.3 | 87.9 |
| 2015-01-01_01:13:14 | 84.2 | 87.7 |
| 2015-01-01_01:13:15 | 84.3 | 87.7 |
| 2015-01-01_01:13:16 | 84.3 | 87.7 |
| 2015-01-01_01:13:17 | 84.3 | 87.7 |
| 2015-01-01_01:13:18 | 84.1 | 87.7 |
| 2015-01-01_01:13:19 | 84.4 | 87.7 |
| 2015-01-01_01:13:20 | 84.3 | 87.7 |
| 2015-01-01_01:13:21 | 84.4 | 87.7 |
| 2015-01-01_01:13:22 | 84.8 | 87.5 |
| 2015-01-01_01:13:23 | 84.9 | 87.5 |
| 2015-01-01_01:13:24 | 84.8 | 87.5 |
| 2015-01-01_01:13:25 | 84.8 | 87.5 |
| 2015-01-01_01:13:26 | 84.8 | 87.5 |
| 2015-01-01_01:13:27 | 84.5 | 87.5 |
| 2015-01-01_01:13:28 | 84.4 | 87.5 |
| 2015-01-01_01:13:29 | 84.6 | 87.5 |
| 2015-01-01_01:13:30 | 84.3 | 87.3 |
| 2015-01-01_01:13:31 | 84.2 | 87.3 |
| 2015-01-01_01:13:32 | 84.1 | 87.3 |
| 2015-01-01_01:13:33 | 83.8 | 87.3 |
| 2015-01-01_01:13:34 | 83.9 | 87.3 |
| 2015-01-01_01:13:35 | 83.5 | 87.3 |
| 2015-01-01_01:13:36 | 83.6 | 87.3 |
| 2015-01-01_01:13:37 | 83.2 | 87.3 |
| 2015-01-01_01:13:38 | 83.1 | 87.2 |
| 2015-01-01_01:13:39 | 83.2 | 87.2 |
| 2015-01-01_01:13:40 | 83 | 87.2 |
| 2015-01-01_01:13:41 | 83.2 | 87.2 |
| 2015-01-01_01:13:42 | 83.2 | 87.2 |
| 2015-01-01_01:13:43 | 83.3 | 87.2 |
| 2015-01-01_01:13:44 | 83.3 | 87.2 |
| 2015-01-01_01:13:45 | 83.2 | 87.2 |
| 2015-01-01_01:13:46 | 83.5 | 87.2 |
| 2015-01-01_01:13:47 | 84.2 | 87.2 |
| 2015-01-01_01:13:48 | 83.9 | 87.2 |
| 2015-01-01_01:13:49 | 84.2 | 87.2 |
| 2015-01-01_01:13:50 | 84.1 | 87.2 |
| 2015-01-01_01:13:51 | 84.1 | 87.2 |
| 2015-01-01_01:13:52 | 84.4 | 87.2 |
| 2015-01-01_01:13:53 | 84.6 | 87.2 |
| 2015-01-01_01:13:54 | 84.4 | 87.1 |
| 2015-01-01_01:13:55 | 84.4 | 87.1 |
| 2015-01-01_01:13:56 | 84.7 | 87.1 |
| 2015-01-01_01:13:57 | 84.9 | 87.1 |
| 2015-01-01_01:13:58 | 84.9 | 87.1 |
| 2015-01-01_01:13:59 | 85.3 | 87.1 |
| 2015-01-01_01:14:00 | 85.5 | 87.1 |
| 2015-01-01_01:14:01 | 85.9 | 87.1 |
| 2015-01-01_01:14:02 | 85.9 | 86.9 |
| 2015-01-01_01:14:03 | 85.6 | 86.9 |
| 2015-01-01_01:14:04 | 85.6 | 86.9 |
| 2015-01-01_01:14:05 | 85.7 | 86.9 |
| 2015-01-01_01:14:06 | 85.5 | 86.9 |
| 2015-01-01_01:14:07 | 85.5 | 86.9 |
| 2015-01-01_01:14:08 | 85.4 | 86.9 |
| 2015-01-01_01:14:09 | 85.4 | 86.9 |
| 2015-01-01_01:14:10 | 85.6 | 86.6 |
| 2015-01-01_01:14:11 | 85.5 | 86.6 |
| 2015-01-01_01:14:12 | 85.8 | 86.6 |
| 2015-01-01_01:14:13 | 85.7 | 86.6 |
| 2015-01-01_01:14:14 | 86 | 86.6 |
| 2015-01-01_01:14:15 | 86 | 86.6 |
| 2015-01-01_01:14:16 | 85.6 | 86.6 |
| 2015-01-01_01:14:17 | 85.7 | 86.6 |
| 2015-01-01_01:14:18 | 85.7 | 86.3 |
| 2015-01-01_01:14:19 | 85.6 | 86.3 |
| 2015-01-01_01:14:20 | 85.8 | 86.3 |
| 2015-01-01_01:14:21 | 85.8 | 86.3 |
| 2015-01-01_01:14:22 | 85.6 | 86.3 |
| 2015-01-01_01:14:23 | 85.8 | 86.3 |
| 2015-01-01_01:14:24 | 85.7 | 86.3 |
| 2015-01-01_01:14:25 | 85.7 | 86.3 |
| 2015-01-01_01:14:26 | 85.8 | 86.2 |
| 2015-01-01_01:14:27 | 85.8 | 86.2 |
| 2015-01-01_01:14:28 | 85.9 | 86.2 |
| 2015-01-01_01:14:29 | 86 | 86.2 |
| 2015-01-01_01:14:30 | 85.9 | 86.2 |
| 2015-01-01_01:14:31 | 85.6 | 86.2 |
| 2015-01-01_01:14:32 | 86 | 86.2 |
| 2015-01-01_01:14:33 | 85.9 | 86.2 |
| 2015-01-01_01:14:34 | 85.6 | 86.2 |
| 2015-01-01_01:14:35 | 85.8 | 86.2 |
| 2015-01-01_01:14:36 | 85.7 | 86.2 |
| 2015-01-01_01:14:37 | 85.9 | 86.2 |
| 2015-01-01_01:14:38 | 85.8 | 86.2 |
| 2015-01-01_01:14:39 | 86.1 | 86.2 |
| 2015-01-01_01:14:40 | 86.2 | 86.2 |
| 2015-01-01_01:14:41 | 86.4 | 86.2 |
| 2015-01-01_01:14:42 | 86.2 | 85.8 |
| 2015-01-01_01:14:43 | 86.1 | 85.8 |
| 2015-01-01_01:14:44 | 86.5 | 85.8 |
| 2015-01-01_01:14:45 | 86 | 85.8 |
| 2015-01-01_01:14:46 | 86.2 | 85.8 |
| 2015-01-01_01:14:47 | 86.5 | 85.8 |
| 2015-01-01_01:14:48 | 86.5 | 85.8 |
| 2015-01-01_01:14:49 | 86.3 | 85.8 |
| 2015-01-01_01:14:50 | 86.6 | 85.6 |
| 2015-01-01_01:14:51 | 86.5 | 85.6 |
| 2015-01-01_01:14:52 | 86.8 | 85.6 |
| 2015-01-01_01:14:53 | 86.8 | 85.6 |
| 2015-01-01_01:14:54 | 86.7 | 85.6 |
| 2015-01-01_01:14:55 | 86.7 | 85.6 |
| 2015-01-01_01:14:56 | 86.7 | 85.6 |
| 2015-01-01_01:14:57 | 86.6 | 85.6 |
| 2015-01-01_01:14:58 | 86.8 | 85.4 |
| 2015-01-01_01:14:59 | 86.7 | 85.4 |
| 2015-01-01_01:15:00 | 86.6 | 85.4 |
| 2015-01-01_01:15:01 | 86.8 | 85.4 |
| 2015-01-01_01:15:02 | 86.9 | 85.4 |
| 2015-01-01_01:15:03 | 86.9 | 85.4 |
| 2015-01-01_01:15:04 | 86.8 | 85.4 |
| 2015-01-01_01:15:05 | 86.9 | 85.4 |
| 2015-01-01_01:15:06 | 87.1 | 85.1 |
| 2015-01-01_01:15:07 | 86.9 | 85.1 |
| 2015-01-01_01:15:08 | 86.9 | 85.1 |
| 2015-01-01_01:15:09 | 87 | 85.1 |
| 2015-01-01_01:15:10 | 86.9 | 85.1 |
| 2015-01-01_01:15:11 | 87.2 | 85.1 |
| 2015-01-01_01:15:12 | 86.7 | 85.1 |
| 2015-01-01_01:15:13 | 86.9 | 85.1 |
| 2015-01-01_01:15:14 | 87.1 | 85 |
| 2015-01-01_01:15:15 | 86.8 | 85 |
| 2015-01-01_01:15:16 | 87 | 85 |
| 2015-01-01_01:15:17 | 86.7 | 85 |
| 2015-01-01_01:15:18 | 87.1 | 85 |
| 2015-01-01_01:15:19 | 87.1 | 85 |
| 2015-01-01_01:15:20 | 87.3 | 85 |
| 2015-01-01_01:15:21 | 87.4 | 85 |
| 2015-01-01_01:15:22 | 87 | 84.8 |
| 2015-01-01_01:15:23 | 87 | 84.8 |
| 2015-01-01_01:15:24 | 87.1 | 84.8 |
| 2015-01-01_01:15:25 | 87.3 | 84.8 |
| 2015-01-01_01:15:26 | 87.1 | 84.8 |
| 2015-01-01_01:15:27 | 87.2 | 84.8 |
| 2015-01-01_01:15:28 | 87.3 | 84.8 |
| 2015-01-01_01:15:29 | 87.1 | 84.8 |
| 2015-01-01_01:15:30 | 87.6 | 84.8 |
| 2015-01-01_01:15:31 | 87.4 | 84.8 |
| 2015-01-01_01:15:32 | 87.1 | 84.8 |
| 2015-01-01_01:15:33 | 87.3 | 84.8 |
| 2015-01-01_01:15:34 | 87.5 | 84.8 |
| 2015-01-01_01:15:35 | 87.5 | 84.8 |
| 2015-01-01_01:15:36 | 87.5 | 84.8 |
| 2015-01-01_01:15:37 | 87.3 | 84.8 |
| 2015-01-01_01:15:38 | 87.2 | 84.8 |
| 2015-01-01_01:15:39 | 87.7 | 84.8 |
| 2015-01-01_01:15:40 | 87.4 | 84.8 |
| 2015-01-01_01:15:41 | 87.6 | 84.8 |
| 2015-01-01_01:15:42 | 87.4 | 84.8 |
| 2015-01-01_01:15:43 | 87.2 | 84.8 |
| 2015-01-01_01:15:44 | 87 | 84.8 |
| 2015-01-01_01:15:45 | 86.7 | 84.8 |
| 2015-01-01_01:15:46 | 86.4 | 84.7 |
| 2015-01-01_01:15:47 | 86.4 | 84.7 |
| 2015-01-01_01:15:48 | 86.6 | 84.7 |
| 2015-01-01_01:15:49 | 86.5 | 84.7 |
| 2015-01-01_01:15:50 | 86.4 | 84.7 |
| 2015-01-01_01:15:51 | 86.1 | 84.7 |
| 2015-01-01_01:15:52 | 85.4 | 84.7 |
| 2015-01-01_01:15:53 | 85.6 | 84.7 |
| 2015-01-01_01:15:54 | 85.4 | 84.8 |
| 2015-01-01_01:15:55 | 85.5 | 84.8 |
| 2015-01-01_01:15:56 | 85.4 | 84.8 |
| 2015-01-01_01:15:57 | 85.1 | 84.8 |
| 2015-01-01_01:15:58 | 85.7 | 84.8 |
| 2015-01-01_01:15:59 | 86.1 | 84.8 |
| 2015-01-01_01:16:00 | 86.2 | 84.8 |
| 2015-01-01_01:16:01 | 86.2 | 84.8 |
| 2015-01-01_01:16:02 | 86 | 84.8 |
| 2015-01-01_01:16:03 | 85.9 | 84.8 |
| 2015-01-01_01:16:04 | 85.8 | 84.8 |
| 2015-01-01_01:16:05 | 85.7 | 84.8 |
| 2015-01-01_01:16:06 | 85.5 | 84.8 |
| 2015-01-01_01:16:07 | 85.4 | 84.8 |
| 2015-01-01_01:16:08 | 85.3 | 84.8 |
| 2015-01-01_01:16:09 | 85 | 84.8 |
| 2015-01-01_01:16:10 | 84.9 | 84.8 |
| 2015-01-01_01:16:11 | 84.9 | 84.8 |
| 2015-01-01_01:16:12 | 84.7 | 84.8 |
| 2015-01-01_01:16:13 | 84.8 | 84.8 |
| 2015-01-01_01:16:14 | 84.9 | 84.8 |
| 2015-01-01_01:16:15 | 84.7 | 84.8 |
| 2015-01-01_01:16:16 | 84.7 | 84.8 |
| 2015-01-01_01:16:17 | 84.5 | 84.8 |
| 2015-01-01_01:16:18 | 84.4 | 84.8 |
| 2015-01-01_01:16:19 | 84.1 | 84.8 |
| 2015-01-01_01:16:20 | 83.9 | 84.8 |
| 2015-01-01_01:16:21 | 83.3 | 84.8 |
| 2015-01-01_01:16:22 | 83.9 | 84.8 |
| 2015-01-01_01:16:23 | 83.5 | 84.8 |
| 2015-01-01_01:16:24 | 83.5 | 84.8 |
| 2015-01-01_01:16:25 | 83.7 | 84.8 |
| 2015-01-01_01:16:26 | 83.6 | 85 |
| 2015-01-01_01:16:27 | 83.5 | 85 |
| 2015-01-01_01:16:28 | 83.6 | 85 |
| 2015-01-01_01:16:29 | 83.6 | 85 |
| 2015-01-01_01:16:30 | 83.8 | 85 |
| 2015-01-01_01:16:31 | 83.5 | 85 |
| 2015-01-01_01:16:32 | 83.3 | 85 |
| 2015-01-01_01:16:33 | 83.2 | 85 |
| 2015-01-01_01:16:34 | 83.3 | 85.1 |
| 2015-01-01_01:16:35 | 83.2 | 85.1 |
| 2015-01-01_01:16:36 | 83.1 | 85.1 |
| 2015-01-01_01:16:37 | 83 | 85.1 |
| 2015-01-01_01:16:38 | 83.1 | 85.1 |
| 2015-01-01_01:16:39 | 83.1 | 85.1 |
| 2015-01-01_01:16:40 | 82.9 | 85.1 |
| 2015-01-01_01:16:41 | 82.9 | 85.1 |
| 2015-01-01_01:16:42 | 82.7 | 85.1 |
| 2015-01-01_01:16:43 | 82.7 | 85.1 |
| 2015-01-01_01:16:44 | 82.7 | 85.1 |
| 2015-01-01_01:16:45 | 82.7 | 85.1 |
| 2015-01-01_01:16:46 | 82.9 | 85.1 |
| 2015-01-01_01:16:47 | 83.2 | 85.1 |
| 2015-01-01_01:16:48 | 83.5 | 85.1 |
| 2015-01-01_01:16:49 | 83.6 | 85.1 |
| 2015-01-01_01:16:50 | 84 | 85.3 |
| 2015-01-01_01:16:51 | 84.7 | 85.3 |
| 2015-01-01_01:16:52 | 84.5 | 85.3 |
| 2015-01-01_01:16:53 | 85.3 | 85.3 |
| 2015-01-01_01:16:54 | 85.4 | 85.3 |
| 2015-01-01_01:16:55 | 85.6 | 85.3 |
| 2015-01-01_01:16:56 | 86.1 | 85.3 |
| 2015-01-01_01:16:57 | 85.9 | 85.3 |
| 2015-01-01_01:16:58 | 86.1 | 85.3 |
| 2015-01-01_01:16:59 | 86.3 | 85.3 |
| 2015-01-01_01:17:00 | 86.1 | 85.3 |
| 2015-01-01_01:17:01 | 86.4 | 85.3 |
| 2015-01-01_01:17:02 | 86.4 | 85.3 |
| 2015-01-01_01:17:03 | 86.2 | 85.3 |
| 2015-01-01_01:17:04 | 86.5 | 85.3 |
| 2015-01-01_01:17:05 | 86.5 | 85.3 |
| 2015-01-01_01:17:06 | 86.8 | 85 |
| 2015-01-01_01:17:07 | 86.8 | 85 |
| 2015-01-01_01:17:08 | 86.6 | 85 |
| 2015-01-01_01:17:09 | 87 | 85 |
| 2015-01-01_01:17:10 | 86.9 | 85 |
| 2015-01-01_01:17:11 | 86.3 | 85 |
| 2015-01-01_01:17:12 | 87 | 85 |
| 2015-01-01_01:17:13 | 86.8 | 85 |
| 2015-01-01_01:17:14 | 86.5 | 84.7 |
| 2015-01-01_01:17:15 | 86.6 | 84.7 |
| 2015-01-01_01:17:16 | 86.5 | 84.7 |
| 2015-01-01_01:17:17 | 86.3 | 84.7 |
| 2015-01-01_01:17:18 | 86 | 84.7 |
| 2015-01-01_01:17:19 | 86 | 84.7 |
| 2015-01-01_01:17:20 | 85.6 | 84.7 |
| 2015-01-01_01:17:21 | 86.1 | 84.7 |
| 2015-01-01_01:17:22 | 86.1 | 84.5 |
| 2015-01-01_01:17:23 | 86.3 | 84.5 |
| 2015-01-01_01:17:24 | 86.5 | 84.5 |
| 2015-01-01_01:17:25 | 86.7 | 84.5 |
| 2015-01-01_01:17:26 | 86.7 | 84.5 |
| 2015-01-01_01:17:27 | 87 | 84.5 |
| 2015-01-01_01:17:28 | 86.9 | 84.5 |
| 2015-01-01_01:17:29 | 86.9 | 84.5 |
| 2015-01-01_01:17:30 | 86.8 | 84.3 |
| 2015-01-01_01:17:31 | 86.3 | 84.3 |
| 2015-01-01_01:17:32 | 86.1 | 84.3 |
| 2015-01-01_01:17:33 | 86.2 | 84.3 |
| 2015-01-01_01:17:34 | 86 | 84.3 |
| 2015-01-01_01:17:35 | 85.9 | 84.3 |
| 2015-01-01_01:17:36 | 85.6 | 84.3 |
| 2015-01-01_01:17:37 | 85.6 | 84.3 |
| 2015-01-01_01:17:38 | 85.7 | 84.3 |
| 2015-01-01_01:17:39 | 85.5 | 84.3 |
| 2015-01-01_01:17:40 | 85.6 | 84.3 |
| 2015-01-01_01:17:41 | 85.4 | 84.3 |
| 2015-01-01_01:17:42 | 85.4 | 84.3 |
| 2015-01-01_01:17:43 | 85.3 | 84.3 |
| 2015-01-01_01:17:44 | 85.2 | 84.3 |
| 2015-01-01_01:17:45 | 85.1 | 84.3 |
| 2015-01-01_01:17:46 | 84.8 | 84.2 |
| 2015-01-01_01:17:47 | 84.3 | 84.2 |
| 2015-01-01_01:17:48 | 84.3 | 84.2 |
| 2015-01-01_01:17:49 | 84.2 | 84.2 |
| 2015-01-01_01:17:50 | 84.2 | 84.2 |
| 2015-01-01_01:17:51 | 83.7 | 84.2 |
| 2015-01-01_01:17:52 | 84.2 | 84.2 |
| 2015-01-01_01:17:53 | 83.9 | 84.2 |
| 2015-01-01_01:17:54 | 84.3 | 84.3 |
| 2015-01-01_01:17:55 | 84.3 | 84.3 |
| 2015-01-01_01:17:56 | 84 | 84.3 |
| 2015-01-01_01:17:57 | 84.2 | 84.3 |
| 2015-01-01_01:17:58 | 84.3 | 84.3 |
| 2015-01-01_01:17:59 | 84.4 | 84.3 |
| 2015-01-01_01:18:00 | 84.2 | 84.3 |
| 2015-01-01_01:18:01 | 83.9 | 84.3 |
| 2015-01-01_01:18:02 | 83.6 | 84.4 |
| 2015-01-01_01:18:03 | 83.4 | 84.4 |
| 2015-01-01_01:18:04 | 83.3 | 84.4 |
| 2015-01-01_01:18:05 | 83.6 | 84.4 |
| 2015-01-01_01:18:06 | 84 | 84.4 |
| 2015-01-01_01:18:07 | 84.3 | 84.4 |
| 2015-01-01_01:18:08 | 84.4 | 84.4 |
| 2015-01-01_01:18:09 | 84.8 | 84.4 |
| 2015-01-01_01:18:10 | 84.8 | 84.5 |
| 2015-01-01_01:18:11 | 84.7 | 84.5 |
| 2015-01-01_01:18:12 | 85.2 | 84.5 |
| 2015-01-01_01:18:13 | 85.6 | 84.5 |
| 2015-01-01_01:18:14 | 85.7 | 84.5 |
| 2015-01-01_01:18:15 | 85 | 84.5 |
| 2015-01-01_01:18:16 | 85.7 | 84.5 |
| 2015-01-01_01:18:17 | 85.8 | 84.5 |
| 2015-01-01_01:18:18 | 85.8 | 84.3 |
| 2015-01-01_01:18:19 | 85.8 | 84.3 |
| 2015-01-01_01:18:20 | 85.9 | 84.3 |
| 2015-01-01_01:18:21 | 86 | 84.3 |
| 2015-01-01_01:18:22 | 85.9 | 84.3 |
| 2015-01-01_01:18:23 | 85.8 | 84.3 |
| 2015-01-01_01:18:24 | 85.6 | 84.3 |
| 2015-01-01_01:18:25 | 85.5 | 84.3 |
| 2015-01-01_01:18:26 | 85.4 | 84.1 |
| 2015-01-01_01:18:27 | 85 | 84.1 |
| 2015-01-01_01:18:28 | 84.9 | 84.1 |
| 2015-01-01_01:18:29 | 84.7 | 84.1 |
| 2015-01-01_01:18:30 | 85 | 84.1 |
| 2015-01-01_01:18:31 | 84.4 | 84.1 |
| 2015-01-01_01:18:32 | 84.5 | 84.1 |
| 2015-01-01_01:18:33 | 84.5 | 84.1 |
| 2015-01-01_01:18:34 | 84.5 | 84 |
| 2015-01-01_01:18:35 | 84.5 | 84 |
| 2015-01-01_01:18:36 | 84.2 | 84 |
| 2015-01-01_01:18:37 | 84.2 | 84 |
| 2015-01-01_01:18:38 | 84.2 | 84 |
| 2015-01-01_01:18:39 | 84.1 | 84 |
| 2015-01-01_01:18:40 | 83.8 | 84 |
| 2015-01-01_01:18:41 | 84.1 | 84 |
| 2015-01-01_01:18:42 | 84 | 84 |
| 2015-01-01_01:18:43 | 84.1 | 84 |
| 2015-01-01_01:18:44 | 84 | 84 |
| 2015-01-01_01:18:45 | 84.2 | 84 |
| 2015-01-01_01:18:46 | 84.2 | 84 |
| 2015-01-01_01:18:47 | 83.7 | 84 |
| 2015-01-01_01:18:48 | 83.8 | 84 |
| 2015-01-01_01:18:49 | 83.8 | 84 |
| 2015-01-01_01:18:50 | 84.1 | 83.9 |
| 2015-01-01_01:18:51 | 83.8 | 83.9 |
| 2015-01-01_01:18:52 | 83.8 | 83.9 |
| 2015-01-01_01:18:53 | 83.5 | 83.9 |
| 2015-01-01_01:18:54 | 83.5 | 83.9 |
| 2015-01-01_01:18:55 | 83.6 | 83.9 |
| 2015-01-01_01:18:56 | 83.6 | 83.9 |
| 2015-01-01_01:18:57 | 83.5 | 83.9 |
| 2015-01-01_01:18:58 | 83.2 | 83.9 |
| 2015-01-01_01:18:59 | 83.2 | 83.9 |
| 2015-01-01_01:19:00 | 83.3 | 83.9 |
| 2015-01-01_01:19:01 | 83.4 | 83.9 |
| 2015-01-01_01:19:02 | 83.5 | 83.9 |
| 2015-01-01_01:19:03 | 83.3 | 83.9 |
| 2015-01-01_01:19:04 | 83.1 | 83.9 |
| 2015-01-01_01:19:05 | 83.3 | 83.9 |
| 2015-01-01_01:19:06 | 82.9 | 83.9 |
| 2015-01-01_01:19:07 | 83.1 | 83.9 |
| 2015-01-01_01:19:08 | 82.8 | 83.9 |
| 2015-01-01_01:19:09 | 83.2 | 83.9 |
| 2015-01-01_01:19:10 | 83.2 | 83.9 |
| 2015-01-01_01:19:11 | 83.3 | 83.9 |
| 2015-01-01_01:19:12 | 83.2 | 83.9 |
| 2015-01-01_01:19:13 | 83 | 83.9 |
| 2015-01-01_01:19:14 | 82.9 | 83.9 |
| 2015-01-01_01:19:15 | 83.2 | 83.9 |
| 2015-01-01_01:19:16 | 83.1 | 83.9 |
| 2015-01-01_01:19:17 | 82.9 | 83.9 |
| 2015-01-01_01:19:18 | 82.7 | 83.9 |
| 2015-01-01_01:19:19 | 83 | 83.9 |
| 2015-01-01_01:19:20 | 83.3 | 83.9 |
| 2015-01-01_01:19:21 | 83 | 83.9 |
| 2015-01-01_01:19:22 | 83.3 | 83.9 |
| 2015-01-01_01:19:23 | 83.5 | 83.9 |
| 2015-01-01_01:19:24 | 83.5 | 83.9 |
| 2015-01-01_01:19:25 | 83.8 | 83.9 |
| 2015-01-01_01:19:26 | 83.6 | 83.9 |
| 2015-01-01_01:19:27 | 83.7 | 83.9 |
| 2015-01-01_01:19:28 | 83.8 | 83.9 |
| 2015-01-01_01:19:29 | 84 | 83.9 |
| 2015-01-01_01:19:30 | 84 | 83.6 |
| 2015-01-01_01:19:31 | 84.5 | 83.6 |
| 2015-01-01_01:19:32 | 84.7 | 83.6 |
| 2015-01-01_01:19:33 | 85.4 | 83.6 |
| 2015-01-01_01:19:34 | 85.4 | 83.6 |
| 2015-01-01_01:19:35 | 85.5 | 83.6 |
| 2015-01-01_01:19:36 | 85.8 | 83.6 |
| 2015-01-01_01:19:37 | 85.9 | 83.6 |
| 2015-01-01_01:19:38 | 85.8 | 83.5 |
| 2015-01-01_01:19:39 | 85.7 | 83.5 |
| 2015-01-01_01:19:40 | 85.5 | 83.5 |
| 2015-01-01_01:19:41 | 85.5 | 83.5 |
| 2015-01-01_01:19:42 | 85.4 | 83.5 |
| 2015-01-01_01:19:43 | 85.4 | 83.5 |
| 2015-01-01_01:19:44 | 85.8 | 83.5 |
| 2015-01-01_01:19:45 | 85.7 | 83.5 |
| 2015-01-01_01:19:46 | 85.9 | 83.2 |
| 2015-01-01_01:19:47 | 86 | 83.2 |
| 2015-01-01_01:19:48 | 85.9 | 83.2 |
| 2015-01-01_01:19:49 | 85.9 | 83.2 |
| 2015-01-01_01:19:50 | 85.7 | 83.2 |
| 2015-01-01_01:19:51 | 86 | 83.2 |
| 2015-01-01_01:19:52 | 86.1 | 83.2 |
| 2015-01-01_01:19:53 | 86.1 | 83.2 |
| 2015-01-01_01:19:54 | 86.2 | 83.2 |
| 2015-01-01_01:19:55 | 86.4 | 83.2 |
| 2015-01-01_01:19:56 | 86.4 | 83.2 |
| 2015-01-01_01:19:57 | 86.1 | 83.2 |
| 2015-01-01_01:19:58 | 86.2 | 83.2 |
| 2015-01-01_01:19:59 | 86.2 | 83.2 |
| 2015-01-01_01:20:00 | 86.5 | 83.2 |
| 2015-01-01_01:20:01 | 86.6 | 83.2 |
| 2015-01-01_01:20:02 | 86.8 | 83.1 |
| 2015-01-01_01:20:03 | 86.7 | 83.1 |
| 2015-01-01_01:20:04 | 86.4 | 83.1 |
| 2015-01-01_01:20:05 | 86.7 | 83.1 |
| 2015-01-01_01:20:06 | 86.8 | 83.1 |
| 2015-01-01_01:20:07 | 87.1 | 83.1 |
| 2015-01-01_01:20:08 | 86.9 | 83.1 |
| 2015-01-01_01:20:09 | 87.2 | 83.1 |
| 2015-01-01_01:20:10 | 87.1 | 83 |
| 2015-01-01_01:20:11 | 87.3 | 83 |
| 2015-01-01_01:20:12 | 87.3 | 83 |
| 2015-01-01_01:20:13 | 87.2 | 83 |
| 2015-01-01_01:20:14 | 87.4 | 83 |
| 2015-01-01_01:20:15 | 87.3 | 83 |
| 2015-01-01_01:20:16 | 86.8 | 83 |
| 2015-01-01_01:20:17 | 87.1 | 83 |
| 2015-01-01_01:20:18 | 86.8 | 83.1 |
| 2015-01-01_01:20:19 | 87 | 83.1 |
| 2015-01-01_01:20:20 | 87.1 | 83.1 |
| 2015-01-01_01:20:21 | 86.7 | 83.1 |
| 2015-01-01_01:20:22 | 86.6 | 83.1 |
| 2015-01-01_01:20:23 | 86.4 | 83.1 |
| 2015-01-01_01:20:24 | 86.1 | 83.1 |
| 2015-01-01_01:20:25 | 85.8 | 83.1 |
| 2015-01-01_01:20:26 | 85.9 | 83.1 |
| 2015-01-01_01:20:27 | 85.9 | 83.1 |
| 2015-01-01_01:20:28 | 86.1 | 83.1 |
| 2015-01-01_01:20:29 | 86.2 | 83.1 |
| 2015-01-01_01:20:30 | 86.3 | 83.1 |
| 2015-01-01_01:20:31 | 85.9 | 83.1 |
| 2015-01-01_01:20:32 | 85.9 | 83.1 |
| 2015-01-01_01:20:33 | 85.5 | 83.1 |
| 2015-01-01_01:20:34 | 85.4 | 83.3 |
| 2015-01-01_01:20:35 | 85 | 83.3 |
| 2015-01-01_01:20:36 | 85.3 | 83.3 |
| 2015-01-01_01:20:37 | 85.3 | 83.3 |
| 2015-01-01_01:20:38 | 85.5 | 83.3 |
| 2015-01-01_01:20:39 | 85.6 | 83.3 |
| 2015-01-01_01:20:40 | 85.5 | 83.3 |
| 2015-01-01_01:20:41 | 85.4 | 83.3 |
| 2015-01-01_01:20:42 | 85.3 | 83.3 |
| 2015-01-01_01:20:43 | 85.1 | 83.3 |
| 2015-01-01_01:20:44 | 85.1 | 83.3 |
| 2015-01-01_01:20:45 | 85.1 | 83.3 |
| 2015-01-01_01:20:46 | 84.9 | 83.3 |
| 2015-01-01_01:20:47 | 84.8 | 83.3 |
| 2015-01-01_01:20:48 | 84.6 | 83.3 |
| 2015-01-01_01:20:49 | 84.5 | 83.3 |
| 2015-01-01_01:20:50 | 83.9 | 83.5 |
| 2015-01-01_01:20:51 | 83.8 | 83.5 |
| 2015-01-01_01:20:52 | 83.8 | 83.5 |
| 2015-01-01_01:20:53 | 83.2 | 83.5 |
| 2015-01-01_01:20:54 | 83.4 | 83.5 |
| 2015-01-01_01:20:55 | 83.3 | 83.5 |
| 2015-01-01_01:20:56 | 83.7 | 83.5 |
| 2015-01-01_01:20:57 | 83.2 | 83.5 |
| 2015-01-01_01:20:58 | 83.7 | 83.6 |
| 2015-01-01_01:20:59 | 83.7 | 83.6 |
| 2015-01-01_01:21:00 | 83.7 | 83.6 |
| 2015-01-01_01:21:01 | 83.5 | 83.6 |
| 2015-01-01_01:21:02 | 83.7 | 83.6 |
| 2015-01-01_01:21:03 | 83.7 | 83.6 |
| 2015-01-01_01:21:04 | 83.3 | 83.6 |
| 2015-01-01_01:21:05 | 83.3 | 83.6 |
| 2015-01-01_01:21:06 | 83.3 | 83.7 |
| 2015-01-01_01:21:07 | 82.7 | 83.7 |
| 2015-01-01_01:21:08 | 82.9 | 83.7 |
| 2015-01-01_01:21:09 | 82.9 | 83.7 |
| 2015-01-01_01:21:10 | 82.5 | 83.7 |
| 2015-01-01_01:21:11 | 82.6 | 83.7 |
| 2015-01-01_01:21:12 | 82.7 | 83.7 |
| 2015-01-01_01:21:13 | 82.7 | 83.7 |
| 2015-01-01_01:21:14 | 82.4 | 83.8 |
| 2015-01-01_01:21:15 | 82.6 | 83.8 |
| 2015-01-01_01:21:16 | 82.3 | 83.8 |
| 2015-01-01_01:21:17 | 82.9 | 83.8 |
| 2015-01-01_01:21:18 | 82.5 | 83.8 |
| 2015-01-01_01:21:19 | 82.6 | 83.8 |
| 2015-01-01_01:21:20 | 82.4 | 83.8 |
| 2015-01-01_01:21:21 | 82.7 | 83.8 |
| 2015-01-01_01:21:22 | 82.7 | 83.8 |
| 2015-01-01_01:21:23 | 82.7 | 83.8 |
| 2015-01-01_01:21:24 | 82.6 | 83.8 |
| 2015-01-01_01:21:25 | 82.2 | 83.8 |
| 2015-01-01_01:21:26 | 82.7 | 83.8 |
| 2015-01-01_01:21:27 | 82.8 | 83.8 |
| 2015-01-01_01:21:28 | 82.4 | 83.8 |
| 2015-01-01_01:21:29 | 82.7 | 83.8 |
| 2015-01-01_01:21:30 | 82.5 | 83.9 |
| 2015-01-01_01:21:31 | 82.5 | 83.9 |
| 2015-01-01_01:21:32 | 82.6 | 83.9 |
| 2015-01-01_01:21:33 | 82.5 | 83.9 |
| 2015-01-01_01:21:34 | 82.7 | 83.9 |
| 2015-01-01_01:21:35 | 82.7 | 83.9 |
| 2015-01-01_01:21:36 | 82.8 | 83.9 |
| 2015-01-01_01:21:37 | 82.8 | 83.9 |
| 2015-01-01_01:21:38 | 82.9 | 83.9 |
| 2015-01-01_01:21:39 | 82.9 | 83.9 |
| 2015-01-01_01:21:40 | 82.9 | 83.9 |
| 2015-01-01_01:21:41 | 83 | 83.9 |
| 2015-01-01_01:21:42 | 83.3 | 83.9 |
| 2015-01-01_01:21:43 | 83.1 | 83.9 |
| 2015-01-01_01:21:44 | 83.5 | 83.9 |
| 2015-01-01_01:21:45 | 83.4 | 83.9 |
| 2015-01-01_01:21:46 | 83.7 | 83.8 |
| 2015-01-01_01:21:47 | 83.7 | 83.8 |
| 2015-01-01_01:21:48 | 83.9 | 83.8 |
| 2015-01-01_01:21:49 | 83.9 | 83.8 |
| 2015-01-01_01:21:50 | 83.5 | 83.8 |
| 2015-01-01_01:21:51 | 83.7 | 83.8 |
| 2015-01-01_01:21:52 | 83.9 | 83.8 |
| 2015-01-01_01:21:53 | 83.7 | 83.8 |
| 2015-01-01_01:21:54 | 84 | 83.6 |
| 2015-01-01_01:21:55 | 84.1 | 83.6 |
| 2015-01-01_01:21:56 | 84.2 | 83.6 |
| 2015-01-01_01:21:57 | 84.2 | 83.6 |
| 2015-01-01_01:21:58 | 84.3 | 83.6 |
| 2015-01-01_01:21:59 | 84.2 | 83.6 |
| 2015-01-01_01:22:00 | 84.3 | 83.6 |
| 2015-01-01_01:22:01 | 84.2 | 83.6 |
| 2015-01-01_01:22:02 | 85 | 83.4 |
| 2015-01-01_01:22:03 | 84.9 | 83.4 |
| 2015-01-01_01:22:04 | 85 | 83.4 |
| 2015-01-01_01:22:05 | 84.8 | 83.4 |
| 2015-01-01_01:22:06 | 84.8 | 83.4 |
| 2015-01-01_01:22:07 | 84.7 | 83.4 |
| 2015-01-01_01:22:08 | 84.5 | 83.4 |
| 2015-01-01_01:22:09 | 84.4 | 83.4 |
| 2015-01-01_01:22:10 | 83.9 | 83.1 |
| 2015-01-01_01:22:11 | 84 | 83.1 |
| 2015-01-01_01:22:12 | 83.8 | 83.1 |
| 2015-01-01_01:22:13 | 84.2 | 83.1 |
| 2015-01-01_01:22:14 | 84.3 | 83.1 |
| 2015-01-01_01:22:15 | 84.2 | 83.1 |
| 2015-01-01_01:22:16 | 84.1 | 83.1 |
| 2015-01-01_01:22:17 | 84.7 | 83.1 |
| 2015-01-01_01:22:18 | 84.8 | 83 |
| 2015-01-01_01:22:19 | 84.8 | 83 |
| 2015-01-01_01:22:20 | 84.7 | 83 |
| 2015-01-01_01:22:21 | 84.6 | 83 |
| 2015-01-01_01:22:22 | 84.6 | 83 |
| 2015-01-01_01:22:23 | 84.5 | 83 |
| 2015-01-01_01:22:24 | 84.3 | 83 |
| 2015-01-01_01:22:25 | 84.2 | 83 |
| 2015-01-01_01:22:26 | 84.1 | 82.8 |
| 2015-01-01_01:22:27 | 84 | 82.8 |
| 2015-01-01_01:22:28 | 83.9 | 82.8 |
| 2015-01-01_01:22:29 | 83.7 | 82.8 |
| 2015-01-01_01:22:30 | 82.9 | 82.8 |
| 2015-01-01_01:22:31 | 83.3 | 82.8 |
| 2015-01-01_01:22:32 | 83.3 | 82.8 |
| 2015-01-01_01:22:33 | 83.3 | 82.8 |
| 2015-01-01_01:22:34 | 83.4 | 82.8 |
| 2015-01-01_01:22:35 | 83.5 | 82.8 |
| 2015-01-01_01:22:36 | 83.5 | 82.8 |
| 2015-01-01_01:22:37 | 83.4 | 82.8 |
| 2015-01-01_01:22:38 | 83.6 | 82.8 |
| 2015-01-01_01:22:39 | 83.5 | 82.8 |
| 2015-01-01_01:22:40 | 83.6 | 82.8 |
| 2015-01-01_01:22:41 | 83.5 | 82.8 |
| 2015-01-01_01:22:42 | 83.6 | 82.8 |
| 2015-01-01_01:22:43 | 83.8 | 82.8 |
| 2015-01-01_01:22:44 | 83.8 | 82.8 |
| 2015-01-01_01:22:45 | 83.8 | 82.8 |
| 2015-01-01_01:22:46 | 83.7 | 82.8 |
| 2015-01-01_01:22:47 | 83.6 | 82.8 |
| 2015-01-01_01:22:48 | 83.5 | 82.8 |
| 2015-01-01_01:22:49 | 83.5 | 82.8 |
| 2015-01-01_01:22:50 | 83.4 | 82.5 |
| 2015-01-01_01:22:51 | 83.6 | 82.5 |
| 2015-01-01_01:22:52 | 83.7 | 82.5 |
| 2015-01-01_01:22:53 | 83.5 | 82.5 |
| 2015-01-01_01:22:54 | 83.4 | 82.5 |
| 2015-01-01_01:22:55 | 83.4 | 82.5 |
| 2015-01-01_01:22:56 | 83.3 | 82.5 |
| 2015-01-01_01:22:57 | 83 | 82.5 |
| 2015-01-01_01:22:58 | 82.4 | 82.3 |
| 2015-01-01_01:22:59 | 82.6 | 82.3 |
| 2015-01-01_01:23:00 | 82.4 | 82.3 |
| 2015-01-01_01:23:01 | 82.4 | 82.3 |
| 2015-01-01_01:23:02 | 82.2 | 82.3 |
| 2015-01-01_01:23:03 | 82.1 | 82.3 |
| 2015-01-01_01:23:04 | 82 | 82.3 |
| 2015-01-01_01:23:05 | 82.4 | 82.3 |
| 2015-01-01_01:23:06 | 82.1 | 82.3 |
| 2015-01-01_01:23:07 | 82.4 | 82.3 |
| 2015-01-01_01:23:08 | 82.4 | 82.3 |
| 2015-01-01_01:23:09 | 82.5 | 82.3 |
| 2015-01-01_01:23:10 | 82.4 | 82.3 |
| 2015-01-01_01:23:11 | 82.1 | 82.3 |
| 2015-01-01_01:23:12 | 82.4 | 82.3 |
| 2015-01-01_01:23:13 | 82.4 | 82.3 |
| 2015-01-01_01:23:14 | 82.4 | 82.3 |
| 2015-01-01_01:23:15 | 82.4 | 82.3 |
| 2015-01-01_01:23:16 | 82.7 | 82.3 |
| 2015-01-01_01:23:17 | 82.8 | 82.3 |
| 2015-01-01_01:23:18 | 82.7 | 82.3 |
| 2015-01-01_01:23:19 | 83.2 | 82.3 |
| 2015-01-01_01:23:20 | 83.2 | 82.3 |
| 2015-01-01_01:23:21 | 83.1 | 82.3 |
| 2015-01-01_01:23:22 | 83 | 82.3 |
| 2015-01-01_01:23:23 | 83.3 | 82.3 |
| 2015-01-01_01:23:24 | 83.5 | 82.3 |
| 2015-01-01_01:23:25 | 83.5 | 82.3 |
| 2015-01-01_01:23:26 | 83.1 | 82.3 |
| 2015-01-01_01:23:27 | 83.6 | 82.3 |
| 2015-01-01_01:23:28 | 83.3 | 82.3 |
| 2015-01-01_01:23:29 | 83.4 | 82.3 |
| 2015-01-01_01:23:30 | 83.5 | 82.2 |
| 2015-01-01_01:23:31 | 83.6 | 82.2 |
| 2015-01-01_01:23:32 | 83.7 | 82.2 |
| 2015-01-01_01:23:33 | 84.1 | 82.2 |
| 2015-01-01_01:23:34 | 83.8 | 82.2 |
| 2015-01-01_01:23:35 | 83.4 | 82.2 |
| 2015-01-01_01:23:36 | 83.9 | 82.2 |
| 2015-01-01_01:23:37 | 83.6 | 82.2 |
| 2015-01-01_01:23:38 | 83.5 | 82 |
| 2015-01-01_01:23:39 | 83.7 | 82 |
| 2015-01-01_01:23:40 | 83.8 | 82 |
| 2015-01-01_01:23:41 | 83.7 | 82 |
| 2015-01-01_01:23:42 | 83.8 | 82 |
| 2015-01-01_01:23:43 | 83.7 | 82 |
| 2015-01-01_01:23:44 | 83.9 | 82 |
| 2015-01-01_01:23:45 | 83.9 | 82 |
| 2015-01-01_01:23:46 | 83.9 | 82 |
| 2015-01-01_01:23:47 | 83.9 | 82 |
| 2015-01-01_01:23:48 | 83.6 | 82 |
| 2015-01-01_01:23:49 | 83.9 | 82 |
| 2015-01-01_01:23:50 | 83.5 | 82 |
| 2015-01-01_01:23:51 | 83.8 | 82 |
| 2015-01-01_01:23:52 | 83.8 | 82 |
| 2015-01-01_01:23:53 | 83.7 | 82 |
| 2015-01-01_01:23:54 | 83.8 | 81.7 |
| 2015-01-01_01:23:55 | 83.7 | 81.7 |
| 2015-01-01_01:23:56 | 83.5 | 81.7 |
| 2015-01-01_01:23:57 | 83.5 | 81.7 |
| 2015-01-01_01:23:58 | 82.9 | 81.7 |
| 2015-01-01_01:23:59 | 82.6 | 81.7 |
| 2015-01-01_01:24:00 | 82.6 | 81.7 |
| 2015-01-01_01:24:01 | 82.7 | 81.7 |
| 2015-01-01_01:24:02 | 82.5 | 81.6 |
| 2015-01-01_01:24:03 | 82.8 | 81.6 |
| 2015-01-01_01:24:04 | 82.4 | 81.6 |
| 2015-01-01_01:24:05 | 82.6 | 81.6 |
| 2015-01-01_01:24:06 | 82.3 | 81.6 |
| 2015-01-01_01:24:07 | 82.7 | 81.6 |
| 2015-01-01_01:24:08 | 82.6 | 81.6 |
| 2015-01-01_01:24:09 | 82.6 | 81.6 |
| 2015-01-01_01:24:10 | 82.7 | 81.6 |
| 2015-01-01_01:24:11 | 82.7 | 81.6 |
| 2015-01-01_01:24:12 | 82.8 | 81.6 |
| 2015-01-01_01:24:13 | 82.8 | 81.6 |
| 2015-01-01_01:24:14 | 82.3 | 81.6 |
| 2015-01-01_01:24:15 | 82.6 | 81.6 |
| 2015-01-01_01:24:16 | 82.8 | 81.6 |
| 2015-01-01_01:24:17 | 82.8 | 81.6 |
| 2015-01-01_01:24:18 | 82.9 | 81.6 |
| 2015-01-01_01:24:19 | 82.7 | 81.6 |
| 2015-01-01_01:24:20 | 82.4 | 81.6 |
| 2015-01-01_01:24:21 | 82.6 | 81.6 |
| 2015-01-01_01:24:22 | 82.7 | 81.6 |
| 2015-01-01_01:24:23 | 82.7 | 81.6 |
| 2015-01-01_01:24:24 | 82.6 | 81.6 |
| 2015-01-01_01:24:25 | 82.7 | 81.6 |
| 2015-01-01_01:24:26 | 82.4 | 81.5 |
| 2015-01-01_01:24:27 | 82.6 | 81.5 |
| 2015-01-01_01:24:28 | 82.3 | 81.5 |
| 2015-01-01_01:24:29 | 82.4 | 81.5 |
| 2015-01-01_01:24:30 | 82.3 | 81.5 |
| 2015-01-01_01:24:31 | 82.2 | 81.5 |
| 2015-01-01_01:24:32 | 82.5 | 81.5 |
| 2015-01-01_01:24:33 | 82.3 | 81.5 |
| 2015-01-01_01:24:34 | 82.1 | 81.5 |
| 2015-01-01_01:24:35 | 82.3 | 81.5 |
| 2015-01-01_01:24:36 | 82.3 | 81.5 |
| 2015-01-01_01:24:37 | 82.2 | 81.5 |
| 2015-01-01_01:24:38 | 82 | 81.5 |
| 2015-01-01_01:24:39 | 82.3 | 81.5 |
| 2015-01-01_01:24:40 | 82.1 | 81.5 |
| 2015-01-01_01:24:41 | 82.2 | 81.5 |
| 2015-01-01_01:24:42 | 82.1 | 81.5 |
| 2015-01-01_01:24:43 | 82.1 | 81.5 |
| 2015-01-01_01:24:44 | 82 | 81.5 |
| 2015-01-01_01:24:45 | 81.9 | 81.5 |
| 2015-01-01_01:24:46 | 82.2 | 81.5 |
| 2015-01-01_01:24:47 | 81.8 | 81.5 |
| 2015-01-01_01:24:48 | 81.7 | 81.5 |
| 2015-01-01_01:24:49 | 81.3 | 81.5 |
| 2015-01-01_01:24:50 | 81.1 | 81.9 |
| 2015-01-01_01:24:51 | 80.7 | 81.9 |
| 2015-01-01_01:24:52 | 81 | 81.9 |
| 2015-01-01_01:24:53 | 81 | 81.9 |
| 2015-01-01_01:24:54 | 81 | 81.9 |
| 2015-01-01_01:24:55 | 81.2 | 81.9 |
| 2015-01-01_01:24:56 | 80.7 | 81.9 |
| 2015-01-01_01:24:57 | 80.9 | 81.9 |
| 2015-01-01_01:24:58 | 80.6 | 82.2 |
| 2015-01-01_01:24:59 | 81.3 | 82.2 |
| 2015-01-01_01:25:00 | 81.1 | 82.2 |
| 2015-01-01_01:25:01 | 81.4 | 82.2 |
| 2015-01-01_01:25:02 | 81.3 | 82.2 |
| 2015-01-01_01:25:03 | 81.9 | 82.2 |
| 2015-01-01_01:25:04 | 81.9 | 82.2 |
| 2015-01-01_01:25:05 | 82 | 82.2 |
| 2015-01-01_01:25:06 | 82.3 | 82.5 |
| 2015-01-01_01:25:07 | 82.3 | 82.5 |
| 2015-01-01_01:25:08 | 82.3 | 82.5 |
| 2015-01-01_01:25:09 | 82 | 82.5 |
| 2015-01-01_01:25:10 | 82.2 | 82.5 |
| 2015-01-01_01:25:11 | 82.5 | 82.5 |
| 2015-01-01_01:25:12 | 82.3 | 82.5 |
| 2015-01-01_01:25:13 | 82.7 | 82.5 |
| 2015-01-01_01:25:14 | 82.9 | 82.5 |
| 2015-01-01_01:25:15 | 82.9 | 82.5 |
| 2015-01-01_01:25:16 | 83.2 | 82.5 |
| 2015-01-01_01:25:17 | 82.9 | 82.5 |
| 2015-01-01_01:25:18 | 83.1 | 82.5 |
| 2015-01-01_01:25:19 | 83.2 | 82.5 |
| 2015-01-01_01:25:20 | 83.2 | 82.5 |
| 2015-01-01_01:25:21 | 83.2 | 82.5 |
| 2015-01-01_01:25:22 | 83.3 | 82.5 |
| 2015-01-01_01:25:23 | 83.6 | 82.5 |
| 2015-01-01_01:25:24 | 83.6 | 82.5 |
| 2015-01-01_01:25:25 | 83.5 | 82.5 |
| 2015-01-01_01:25:26 | 83.5 | 82.5 |
| 2015-01-01_01:25:27 | 83.6 | 82.5 |
| 2015-01-01_01:25:28 | 83.4 | 82.5 |
| 2015-01-01_01:25:29 | 83.5 | 82.5 |
| 2015-01-01_01:25:30 | 83.7 | 83.3 |
| 2015-01-01_01:25:31 | 83.4 | 83.3 |
| 2015-01-01_01:25:32 | 83.2 | 83.3 |
| 2015-01-01_01:25:33 | 83.3 | 83.3 |
| 2015-01-01_01:25:34 | 83.4 | 83.3 |
| 2015-01-01_01:25:35 | 83.3 | 83.3 |
| 2015-01-01_01:25:36 | 83 | 83.3 |
| 2015-01-01_01:25:37 | 82.7 | 83.3 |
| 2015-01-01_01:25:38 | 82.6 | 83.4 |
| 2015-01-01_01:25:39 | 82.9 | 83.4 |
| 2015-01-01_01:25:40 | 82.7 | 83.4 |
| 2015-01-01_01:25:41 | 82.7 | 83.4 |
| 2015-01-01_01:25:42 | 82.3 | 83.4 |
| 2015-01-01_01:25:43 | 82.7 | 83.4 |
| 2015-01-01_01:25:44 | 82.6 | 83.4 |
| 2015-01-01_01:25:45 | 82.6 | 83.4 |
| 2015-01-01_01:25:46 | 82.8 | 83.5 |
| 2015-01-01_01:25:47 | 83 | 83.5 |
| 2015-01-01_01:25:48 | 82.8 | 83.5 |
| 2015-01-01_01:25:49 | 82.9 | 83.5 |
| 2015-01-01_01:25:50 | 83.3 | 83.5 |
| 2015-01-01_01:25:51 | 83.3 | 83.5 |
| 2015-01-01_01:25:52 | 83.4 | 83.5 |
| 2015-01-01_01:25:53 | 83.2 | 83.5 |
| 2015-01-01_01:25:54 | 82.8 | 83.5 |
| 2015-01-01_01:25:55 | 83.2 | 83.5 |
| 2015-01-01_01:25:56 | 83.7 | 83.5 |
| 2015-01-01_01:25:57 | 83.7 | 83.5 |
| 2015-01-01_01:25:58 | 83.7 | 83.5 |
| 2015-01-01_01:25:59 | 83.5 | 83.5 |
| 2015-01-01_01:26:00 | 83.7 | 83.5 |
| 2015-01-01_01:26:01 | 83.7 | 83.5 |
| 2015-01-01_01:26:02 | 83.2 | 83.4 |
| 2015-01-01_01:26:03 | 83.3 | 83.4 |
| 2015-01-01_01:26:04 | 83.4 | 83.4 |
| 2015-01-01_01:26:05 | 83.4 | 83.4 |
| 2015-01-01_01:26:06 | 83.2 | 83.4 |
| 2015-01-01_01:26:07 | 83 | 83.4 |
| 2015-01-01_01:26:08 | 83.4 | 83.4 |
| 2015-01-01_01:26:09 | 83.1 | 83.4 |
| 2015-01-01_01:26:10 | 83 | 83.3 |
| 2015-01-01_01:26:11 | 83.1 | 83.3 |
| 2015-01-01_01:26:12 | 83.2 | 83.3 |
| 2015-01-01_01:26:13 | 83.1 | 83.3 |
| 2015-01-01_01:26:14 | 83.2 | 83.3 |
| 2015-01-01_01:26:15 | 83.2 | 83.3 |
| 2015-01-01_01:26:16 | 83 | 83.3 |
| 2015-01-01_01:26:17 | 83 | 83.3 |
| 2015-01-01_01:26:18 | 83.2 | 83.1 |
| 2015-01-01_01:26:19 | 83.3 | 83.1 |
| 2015-01-01_01:26:20 | 83.3 | 83.1 |
| 2015-01-01_01:26:21 | 83 | 83.1 |
| 2015-01-01_01:26:22 | 83.1 | 83.1 |
| 2015-01-01_01:26:23 | 82.9 | 83.1 |
| 2015-01-01_01:26:24 | 82.9 | 83.1 |
| 2015-01-01_01:26:25 | 82.7 | 83.1 |
| 2015-01-01_01:26:26 | 82.7 | 83.1 |
| 2015-01-01_01:26:27 | 82.7 | 83.1 |
| 2015-01-01_01:26:28 | 82.9 | 83.1 |
| 2015-01-01_01:26:29 | 82.7 | 83.1 |
| 2015-01-01_01:26:30 | 83.2 | 83.1 |
| 2015-01-01_01:26:31 | 82.8 | 83.1 |
| 2015-01-01_01:26:32 | 82.9 | 83.1 |
| 2015-01-01_01:26:33 | 82.9 | 83.1 |
| 2015-01-01_01:26:34 | 82.8 | 83 |
| 2015-01-01_01:26:35 | 82.4 | 83 |
| 2015-01-01_01:26:36 | 82.7 | 83 |
| 2015-01-01_01:26:37 | 82.3 | 83 |
| 2015-01-01_01:26:38 | 82.4 | 83 |
| 2015-01-01_01:26:39 | 82.4 | 83 |
| 2015-01-01_01:26:40 | 82.2 | 83 |
| 2015-01-01_01:26:41 | 82.2 | 83 |
| 2015-01-01_01:26:42 | 82.6 | 82.9 |
| 2015-01-01_01:26:43 | 82.8 | 82.9 |
| 2015-01-01_01:26:44 | 82.4 | 82.9 |
| 2015-01-01_01:26:45 | 83.1 | 82.9 |
| 2015-01-01_01:26:46 | 82.9 | 82.9 |
| 2015-01-01_01:26:47 | 83.3 | 82.9 |
| 2015-01-01_01:26:48 | 83.1 | 82.9 |
| 2015-01-01_01:26:49 | 83.1 | 82.9 |
| 2015-01-01_01:26:50 | 83.2 | 82.9 |
| 2015-01-01_01:26:51 | 83.4 | 82.9 |
| 2015-01-01_01:26:52 | 83 | 82.9 |
| 2015-01-01_01:26:53 | 83.1 | 82.9 |
| 2015-01-01_01:26:54 | 83.5 | 82.9 |
| 2015-01-01_01:26:55 | 83.8 | 82.9 |
| 2015-01-01_01:26:56 | 83.5 | 82.9 |
| 2015-01-01_01:26:57 | 83.9 | 82.9 |
| 2015-01-01_01:26:58 | 84 | 83 |
| 2015-01-01_01:26:59 | 84.3 | 83 |
| 2015-01-01_01:27:00 | 84.5 | 83 |
| 2015-01-01_01:27:01 | 84.5 | 83 |
| 2015-01-01_01:27:02 | 84.5 | 83 |
| 2015-01-01_01:27:03 | 84.1 | 83 |
| 2015-01-01_01:27:04 | 83.7 | 83 |
| 2015-01-01_01:27:05 | 84 | 83 |
| 2015-01-01_01:27:06 | 84 | 83 |
| 2015-01-01_01:27:07 | 83.8 | 83 |
| 2015-01-01_01:27:08 | 84.1 | 83 |
| 2015-01-01_01:27:09 | 84 | 83 |
| 2015-01-01_01:27:10 | 83.7 | 83 |
| 2015-01-01_01:27:11 | 83.8 | 83 |
| 2015-01-01_01:27:12 | 83.9 | 83 |
| 2015-01-01_01:27:13 | 83.7 | 83 |
| 2015-01-01_01:27:14 | 83.5 | 83.2 |
| 2015-01-01_01:27:15 | 83.5 | 83.2 |
| 2015-01-01_01:27:16 | 83.4 | 83.2 |
| 2015-01-01_01:27:17 | 83.3 | 83.2 |
| 2015-01-01_01:27:18 | 83.2 | 83.2 |
| 2015-01-01_01:27:19 | 83.1 | 83.2 |
| 2015-01-01_01:27:20 | 82.9 | 83.2 |
| 2015-01-01_01:27:21 | 83 | 83.2 |
| 2015-01-01_01:27:22 | 82.7 | 83.5 |
| 2015-01-01_01:27:23 | 82.3 | 83.5 |
| 2015-01-01_01:27:24 | 82.5 | 83.5 |
| 2015-01-01_01:27:25 | 82.4 | 83.5 |
| 2015-01-01_01:27:26 | 82.4 | 83.5 |
| 2015-01-01_01:27:27 | 82.1 | 83.5 |
| 2015-01-01_01:27:28 | 82 | 83.5 |
| 2015-01-01_01:27:29 | 81.7 | 83.5 |
| 2015-01-01_01:27:30 | 82.2 | 83.6 |
| 2015-01-01_01:27:31 | 81.8 | 83.6 |
| 2015-01-01_01:27:32 | 81.9 | 83.6 |
| 2015-01-01_01:27:33 | 82 | 83.6 |
| 2015-01-01_01:27:34 | 82.5 | 83.6 |
| 2015-01-01_01:27:35 | 82.4 | 83.6 |
| 2015-01-01_01:27:36 | 82.5 | 83.6 |
| 2015-01-01_01:27:37 | 82.4 | 83.6 |
| 2015-01-01_01:27:38 | 82.6 | 83.9 |
| 2015-01-01_01:27:39 | 82.5 | 83.9 |
| 2015-01-01_01:27:40 | 82.4 | 83.9 |
| 2015-01-01_01:27:41 | 82.3 | 83.9 |
| 2015-01-01_01:27:42 | 82.2 | 83.9 |
| 2015-01-01_01:27:43 | 82.4 | 83.9 |
| 2015-01-01_01:27:44 | 82.8 | 83.9 |
| 2015-01-01_01:27:45 | 82.8 | 83.9 |
| 2015-01-01_01:27:46 | 82.6 | 83.9 |
| 2015-01-01_01:27:47 | 82.8 | 83.9 |
| 2015-01-01_01:27:48 | 83.1 | 83.9 |
| 2015-01-01_01:27:49 | 82.9 | 83.9 |
| 2015-01-01_01:27:50 | 82.7 | 83.9 |
| 2015-01-01_01:27:51 | 83.4 | 83.9 |
| 2015-01-01_01:27:52 | 83 | 83.9 |
| 2015-01-01_01:27:53 | 83.2 | 83.9 |
| 2015-01-01_01:27:54 | 83.5 | 84 |
| 2015-01-01_01:27:55 | 83.7 | 84 |
| 2015-01-01_01:27:56 | 83.8 | 84 |
| 2015-01-01_01:27:57 | 84.3 | 84 |
| 2015-01-01_01:27:58 | 84.9 | 84 |
| 2015-01-01_01:27:59 | 84.9 | 84 |
| 2015-01-01_01:28:00 | 85.4 | 84 |
| 2015-01-01_01:28:01 | 85.5 | 84 |
| 2015-01-01_01:28:02 | 86.1 | 83.8 |
| 2015-01-01_01:28:03 | 86.6 | 83.8 |
| 2015-01-01_01:28:04 | 86.2 | 83.8 |
| 2015-01-01_01:28:05 | 86.9 | 83.8 |
| 2015-01-01_01:28:06 | 87 | 83.8 |
| 2015-01-01_01:28:07 | 87 | 83.8 |
| 2015-01-01_01:28:08 | 86.5 | 83.8 |
| 2015-01-01_01:28:09 | 86.7 | 83.8 |
| 2015-01-01_01:28:10 | 86.3 | 83.6 |
| 2015-01-01_01:28:11 | 86 | 83.6 |
| 2015-01-01_01:28:12 | 85.8 | 83.6 |
| 2015-01-01_01:28:13 | 85.3 | 83.6 |
| 2015-01-01_01:28:14 | 85.4 | 83.6 |
| 2015-01-01_01:28:15 | 85.3 | 83.6 |
| 2015-01-01_01:28:16 | 85.4 | 83.6 |
| 2015-01-01_01:28:17 | 85.2 | 83.6 |
| 2015-01-01_01:28:18 | 85.2 | 83.5 |
| 2015-01-01_01:28:19 | 85.6 | 83.5 |
| 2015-01-01_01:28:20 | 85.1 | 83.5 |
| 2015-01-01_01:28:21 | 85.4 | 83.5 |
| 2015-01-01_01:28:22 | 85.3 | 83.5 |
| 2015-01-01_01:28:23 | 85 | 83.5 |
| 2015-01-01_01:28:24 | 84.8 | 83.5 |
| 2015-01-01_01:28:25 | 84.9 | 83.5 |
| 2015-01-01_01:28:26 | 85.1 | 83.5 |
| 2015-01-01_01:28:27 | 85 | 83.5 |
| 2015-01-01_01:28:28 | 84.6 | 83.5 |
| 2015-01-01_01:28:29 | 85 | 83.5 |
| 2015-01-01_01:28:30 | 85.1 | 83.5 |
| 2015-01-01_01:28:31 | 85 | 83.5 |
| 2015-01-01_01:28:32 | 84.4 | 83.5 |
| 2015-01-01_01:28:33 | 84.6 | 83.5 |
| 2015-01-01_01:28:34 | 84.8 | 83.6 |
| 2015-01-01_01:28:35 | 84.7 | 83.6 |
| 2015-01-01_01:28:36 | 84.9 | 83.6 |
| 2015-01-01_01:28:37 | 84.9 | 83.6 |
| 2015-01-01_01:28:38 | 84.9 | 83.6 |
| 2015-01-01_01:28:39 | 84.9 | 83.6 |
| 2015-01-01_01:28:40 | 84.7 | 83.6 |
| 2015-01-01_01:28:41 | 84.6 | 83.6 |
| 2015-01-01_01:28:42 | 84.7 | 83.8 |
| 2015-01-01_01:28:43 | 84.6 | 83.8 |
| 2015-01-01_01:28:44 | 84.5 | 83.8 |
| 2015-01-01_01:28:45 | 84.4 | 83.8 |
| 2015-01-01_01:28:46 | 84.5 | 83.8 |
| 2015-01-01_01:28:47 | 84.5 | 83.8 |
| 2015-01-01_01:28:48 | 84.7 | 83.8 |
| 2015-01-01_01:28:49 | 84.8 | 83.8 |
| 2015-01-01_01:28:50 | 84.3 | 83.8 |
| 2015-01-01_01:28:51 | 84.1 | 83.8 |
| 2015-01-01_01:28:52 | 84.2 | 83.8 |
| 2015-01-01_01:28:53 | 84.1 | 83.8 |
| 2015-01-01_01:28:54 | 83.6 | 83.8 |
| 2015-01-01_01:28:55 | 83.7 | 83.8 |
| 2015-01-01_01:28:56 | 83.9 | 83.8 |
| 2015-01-01_01:28:57 | 83.7 | 83.8 |
| 2015-01-01_01:28:58 | 84 | 83.8 |
| 2015-01-01_01:28:59 | 83.9 | 83.8 |
| 2015-01-01_01:29:00 | 83.7 | 83.8 |
| 2015-01-01_01:29:01 | 83.7 | 83.8 |
| 2015-01-01_01:29:02 | 83.4 | 83.8 |
| 2015-01-01_01:29:03 | 83.4 | 83.8 |
| 2015-01-01_01:29:04 | 83.3 | 83.8 |
| 2015-01-01_01:29:05 | 83.1 | 83.8 |
| 2015-01-01_01:29:06 | 82.6 | 83.8 |
| 2015-01-01_01:29:07 | 82.7 | 83.8 |
| 2015-01-01_01:29:08 | 82.7 | 83.8 |
| 2015-01-01_01:29:09 | 82.6 | 83.8 |
| 2015-01-01_01:29:10 | 82.6 | 83.8 |
| 2015-01-01_01:29:11 | 82.3 | 83.8 |
| 2015-01-01_01:29:12 | 82.5 | 83.8 |
| 2015-01-01_01:29:13 | 82.4 | 83.8 |
| 2015-01-01_01:29:14 | 82.3 | 83.8 |
| 2015-01-01_01:29:15 | 82 | 83.8 |
| 2015-01-01_01:29:16 | 82 | 83.8 |
| 2015-01-01_01:29:17 | 82.5 | 83.8 |
| 2015-01-01_01:29:18 | 82.1 | 83.8 |
| 2015-01-01_01:29:19 | 82.3 | 83.8 |
| 2015-01-01_01:29:20 | 82.5 | 83.8 |
| 2015-01-01_01:29:21 | 82.2 | 83.8 |
| 2015-01-01_01:29:22 | 82.4 | 83.8 |
| 2015-01-01_01:29:23 | 82.2 | 83.8 |
| 2015-01-01_01:29:24 | 82.2 | 83.8 |
| 2015-01-01_01:29:25 | 82.5 | 83.8 |
| 2015-01-01_01:29:26 | 82.4 | 83.8 |
| 2015-01-01_01:29:27 | 82.4 | 83.8 |
| 2015-01-01_01:29:28 | 82.3 | 83.8 |
| 2015-01-01_01:29:29 | 82.5 | 83.8 |
| 2015-01-01_01:29:30 | 82.7 | 83.8 |
| 2015-01-01_01:29:31 | 82.7 | 83.8 |
| 2015-01-01_01:29:32 | 82.5 | 83.8 |
| 2015-01-01_01:29:33 | 82.8 | 83.8 |
| 2015-01-01_01:29:34 | 82.8 | 83.8 |
| 2015-01-01_01:29:35 | 82.8 | 83.8 |
| 2015-01-01_01:29:36 | 82.8 | 83.8 |
| 2015-01-01_01:29:37 | 82.6 | 83.8 |
| 2015-01-01_01:29:38 | 82.6 | 83.7 |
| 2015-01-01_01:29:39 | 82.4 | 83.7 |
| 2015-01-01_01:29:40 | 82.4 | 83.7 |
| 2015-01-01_01:29:41 | 82.4 | 83.7 |
| 2015-01-01_01:29:42 | 82.4 | 83.7 |
| 2015-01-01_01:29:43 | 82.3 | 83.7 |
| 2015-01-01_01:29:44 | 82.1 | 83.7 |
| 2015-01-01_01:29:45 | 82.1 | 83.7 |
| 2015-01-01_01:29:46 | 82 | 83.6 |
| 2015-01-01_01:29:47 | 82 | 83.6 |
| 2015-01-01_01:29:48 | 82 | 83.6 |
| 2015-01-01_01:29:49 | 82 | 83.6 |
| 2015-01-01_01:29:50 | 82 | 83.6 |
| 2015-01-01_01:29:51 | 82 | 83.6 |
| 2015-01-01_01:29:52 | 82.1 | 83.6 |
| 2015-01-01_01:29:53 | 81.9 | 83.6 |
| 2015-01-01_01:29:54 | 82.1 | 83.6 |
| 2015-01-01_01:29:55 | 82.1 | 83.6 |
| 2015-01-01_01:29:56 | 82 | 83.6 |
| 2015-01-01_01:29:57 | 81.8 | 83.6 |
| 2015-01-01_01:29:58 | 82 | 83.6 |
| 2015-01-01_01:29:59 | 82.1 | 83.6 |
| 2015-01-01_01:30:00 | 82.3 | 83.6 |
| 2015-01-01_01:30:01 | 82.2 | 83.6 |
| 2015-01-01_01:30:02 | 82.2 | 83.9 |
| 2015-01-01_01:30:03 | 82 | 83.9 |
| 2015-01-01_01:30:04 | 82.1 | 83.9 |
| 2015-01-01_01:30:05 | 82.3 | 83.9 |
| 2015-01-01_01:30:06 | 82.1 | 83.9 |
| 2015-01-01_01:30:07 | 82.1 | 83.9 |
| 2015-01-01_01:30:08 | 81.8 | 83.9 |
| 2015-01-01_01:30:09 | 82.2 | 83.9 |
| 2015-01-01_01:30:10 | 81.9 | 84.2 |
| 2015-01-01_01:30:11 | 81.8 | 84.2 |
| 2015-01-01_01:30:12 | 81.9 | 84.2 |
| 2015-01-01_01:30:13 | 82.1 | 84.2 |
| 2015-01-01_01:30:14 | 81.8 | 84.2 |
| 2015-01-01_01:30:15 | 81.8 | 84.2 |
| 2015-01-01_01:30:16 | 81.9 | 84.2 |
| 2015-01-01_01:30:17 | 81.8 | 84.2 |
| 2015-01-01_01:30:18 | 81.8 | 84.5 |
| 2015-01-01_01:30:19 | 82 | 84.5 |
| 2015-01-01_01:30:20 | 82.2 | 84.5 |
| 2015-01-01_01:30:21 | 82 | 84.5 |
| 2015-01-01_01:30:22 | 82.3 | 84.5 |
| 2015-01-01_01:30:23 | 82.3 | 84.5 |
| 2015-01-01_01:30:24 | 82.4 | 84.5 |
| 2015-01-01_01:30:25 | 82.3 | 84.5 |
| 2015-01-01_01:30:26 | 82.4 | 84.5 |
| 2015-01-01_01:30:27 | 82.7 | 84.5 |
| 2015-01-01_01:30:28 | 82.8 | 84.5 |
| 2015-01-01_01:30:29 | 82.9 | 84.5 |
| 2015-01-01_01:30:30 | 83.2 | 84.5 |
| 2015-01-01_01:30:31 | 83.5 | 84.5 |
| 2015-01-01_01:30:32 | 83.6 | 84.5 |
| 2015-01-01_01:30:33 | 83.9 | 84.5 |
| 2015-01-01_01:30:34 | 83.9 | 84.8 |
| 2015-01-01_01:30:35 | 84.2 | 84.8 |
| 2015-01-01_01:30:36 | 84.1 | 84.8 |
| 2015-01-01_01:30:37 | 84.2 | 84.8 |
| 2015-01-01_01:30:38 | 84.4 | 84.8 |
| 2015-01-01_01:30:39 | 84.6 | 84.8 |
| 2015-01-01_01:30:40 | 84.6 | 84.8 |
| 2015-01-01_01:30:41 | 84.7 | 84.8 |
| 2015-01-01_01:30:42 | 84.6 | 85 |
| 2015-01-01_01:30:43 | 84.6 | 85 |
| 2015-01-01_01:30:44 | 84.4 | 85 |
| 2015-01-01_01:30:45 | 84.2 | 85 |
| 2015-01-01_01:30:46 | 84.1 | 85 |
| 2015-01-01_01:30:47 | 84 | 85 |
| 2015-01-01_01:30:48 | 84.2 | 85 |
| 2015-01-01_01:30:49 | 84.2 | 85 |
| 2015-01-01_01:30:50 | 84.3 | 85.2 |
| 2015-01-01_01:30:51 | 84.3 | 85.2 |
| 2015-01-01_01:30:52 | 84.4 | 85.2 |
| 2015-01-01_01:30:53 | 84.5 | 85.2 |
| 2015-01-01_01:30:54 | 84.3 | 85.2 |
| 2015-01-01_01:30:55 | 84.4 | 85.2 |
| 2015-01-01_01:30:56 | 84.4 | 85.2 |
| 2015-01-01_01:30:57 | 84.2 | 85.2 |
| 2015-01-01_01:30:58 | 84.2 | 85.4 |
| 2015-01-01_01:30:59 | 84.7 | 85.4 |
| 2015-01-01_01:31:00 | 84.9 | 85.4 |
| 2015-01-01_01:31:01 | 85.3 | 85.4 |
| 2015-01-01_01:31:02 | 85.4 | 85.4 |
| 2015-01-01_01:31:03 | 85.6 | 85.4 |
| 2015-01-01_01:31:04 | 85.8 | 85.4 |
| 2015-01-01_01:31:05 | 85.8 | 85.4 |
| 2015-01-01_01:31:06 | 86 | 85.5 |
| 2015-01-01_01:31:07 | 85.8 | 85.5 |
| 2015-01-01_01:31:08 | 86.2 | 85.5 |
| 2015-01-01_01:31:09 | 86.1 | 85.5 |
| 2015-01-01_01:31:10 | 86.2 | 85.5 |
| 2015-01-01_01:31:11 | 86.4 | 85.5 |
| 2015-01-01_01:31:12 | 86.8 | 85.5 |
| 2015-01-01_01:31:13 | 86.8 | 85.5 |
| 2015-01-01_01:31:14 | 86.5 | 85.5 |
| 2015-01-01_01:31:15 | 86.8 | 85.5 |
| 2015-01-01_01:31:16 | 86.4 | 85.5 |
| 2015-01-01_01:31:17 | 86.7 | 85.5 |
| 2015-01-01_01:31:18 | 86.6 | 85.5 |
| 2015-01-01_01:31:19 | 86.8 | 85.5 |
| 2015-01-01_01:31:20 | 86.7 | 85.5 |
| 2015-01-01_01:31:21 | 86.7 | 85.5 |
| 2015-01-01_01:31:22 | 86.7 | 85.3 |
| 2015-01-01_01:31:23 | 86.4 | 85.3 |
| 2015-01-01_01:31:24 | 86.8 | 85.3 |
| 2015-01-01_01:31:25 | 86.6 | 85.3 |
| 2015-01-01_01:31:26 | 86.5 | 85.3 |
| 2015-01-01_01:31:27 | 86.4 | 85.3 |
| 2015-01-01_01:31:28 | 86.2 | 85.3 |
| 2015-01-01_01:31:29 | 86.1 | 85.3 |
| 2015-01-01_01:31:30 | 86 | 85.3 |
| 2015-01-01_01:31:31 | 85.8 | 85.3 |
| 2015-01-01_01:31:32 | 85.8 | 85.3 |
| 2015-01-01_01:31:33 | 85.7 | 85.3 |
| 2015-01-01_01:31:34 | 85.7 | 85.3 |
| 2015-01-01_01:31:35 | 85.6 | 85.3 |
| 2015-01-01_01:31:36 | 85.4 | 85.3 |
| 2015-01-01_01:31:37 | 85.3 | 85.3 |
| 2015-01-01_01:31:38 | 85.4 | 85.2 |
| 2015-01-01_01:31:39 | 85.1 | 85.2 |
| 2015-01-01_01:31:40 | 85.2 | 85.2 |
| 2015-01-01_01:31:41 | 85.4 | 85.2 |
| 2015-01-01_01:31:42 | 85.2 | 85.2 |
| 2015-01-01_01:31:43 | 85.4 | 85.2 |
| 2015-01-01_01:31:44 | 85.4 | 85.2 |
| 2015-01-01_01:31:45 | 85.4 | 85.2 |
| 2015-01-01_01:31:46 | 85.4 | 85.3 |
| 2015-01-01_01:31:47 | 84.8 | 85.3 |
| 2015-01-01_01:31:48 | 85.1 | 85.3 |
| 2015-01-01_01:31:49 | 85.2 | 85.3 |
| 2015-01-01_01:31:50 | 85.2 | 85.3 |
| 2015-01-01_01:31:51 | 84.8 | 85.3 |
| 2015-01-01_01:31:52 | 85.2 | 85.3 |
| 2015-01-01_01:31:53 | 84.7 | 85.3 |
| 2015-01-01_01:31:54 | 84.7 | 85.7 |
| 2015-01-01_01:31:55 | 84.9 | 85.7 |
| 2015-01-01_01:31:56 | 84.7 | 85.7 |
| 2015-01-01_01:31:57 | 85.1 | 85.7 |
| 2015-01-01_01:31:58 | 84.9 | 85.7 |
| 2015-01-01_01:31:59 | 85.3 | 85.7 |
| 2015-01-01_01:32:00 | 85.3 | 85.7 |
| 2015-01-01_01:32:01 | 85.7 | 85.7 |
| 2015-01-01_01:32:02 | 85.7 | 86 |
| 2015-01-01_01:32:03 | 85.6 | 86 |
| 2015-01-01_01:32:04 | 85.4 | 86 |
| 2015-01-01_01:32:05 | 85.3 | 86 |
| 2015-01-01_01:32:06 | 85.2 | 86 |
| 2015-01-01_01:32:07 | 85.6 | 86 |
| 2015-01-01_01:32:08 | 85.7 | 86 |
| 2015-01-01_01:32:09 | 86 | 86 |
| 2015-01-01_01:32:10 | 86.5 | 86.2 |
| 2015-01-01_01:32:11 | 86.3 | 86.2 |
| 2015-01-01_01:32:12 | 86.7 | 86.2 |
| 2015-01-01_01:32:13 | 86.8 | 86.2 |
| 2015-01-01_01:32:14 | 86.9 | 86.2 |
| 2015-01-01_01:32:15 | 86.8 | 86.2 |
| 2015-01-01_01:32:16 | 86.9 | 86.2 |
| 2015-01-01_01:32:17 | 87.1 | 86.2 |
| 2015-01-01_01:32:18 | 87.2 | 86.3 |
| 2015-01-01_01:32:19 | 87.2 | 86.3 |
| 2015-01-01_01:32:20 | 87.4 | 86.3 |
| 2015-01-01_01:32:21 | 87.2 | 86.3 |
| 2015-01-01_01:32:22 | 87.2 | 86.3 |
| 2015-01-01_01:32:23 | 87.4 | 86.3 |
| 2015-01-01_01:32:24 | 87.4 | 86.3 |
| 2015-01-01_01:32:25 | 87.8 | 86.3 |
| 2015-01-01_01:32:26 | 87.7 | 86.3 |
| 2015-01-01_01:32:27 | 87.9 | 86.3 |
| 2015-01-01_01:32:28 | 87.6 | 86.3 |
| 2015-01-01_01:32:29 | 87.7 | 86.3 |
| 2015-01-01_01:32:30 | 87.8 | 86.3 |
| 2015-01-01_01:32:31 | 87.9 | 86.3 |
| 2015-01-01_01:32:32 | 87.6 | 86.3 |
| 2015-01-01_01:32:33 | 87.6 | 86.3 |
| 2015-01-01_01:32:34 | 87.6 | 86.1 |
| 2015-01-01_01:32:35 | 87.8 | 86.1 |
| 2015-01-01_01:32:36 | 87.9 | 86.1 |
| 2015-01-01_01:32:37 | 87.5 | 86.1 |
| 2015-01-01_01:32:38 | 87.8 | 86.1 |
| 2015-01-01_01:32:39 | 87.5 | 86.1 |
| 2015-01-01_01:32:40 | 87.7 | 86.1 |
| 2015-01-01_01:32:41 | 87.4 | 86.1 |
| 2015-01-01_01:32:42 | 87.6 | 85.9 |
| 2015-01-01_01:32:43 | 87.6 | 85.9 |
| 2015-01-01_01:32:44 | 87.1 | 85.9 |
| 2015-01-01_01:32:45 | 87.8 | 85.9 |
| 2015-01-01_01:32:46 | 87.6 | 85.9 |
| 2015-01-01_01:32:47 | 87.8 | 85.9 |
| 2015-01-01_01:32:48 | 87.4 | 85.9 |
| 2015-01-01_01:32:49 | 87.8 | 85.9 |
| 2015-01-01_01:32:50 | 87.4 | 85.8 |
| 2015-01-01_01:32:51 | 87.5 | 85.8 |
| 2015-01-01_01:32:52 | 87.6 | 85.8 |
| 2015-01-01_01:32:53 | 87.7 | 85.8 |
| 2015-01-01_01:32:54 | 87.7 | 85.8 |
| 2015-01-01_01:32:55 | 87.9 | 85.8 |
| 2015-01-01_01:32:56 | 87.7 | 85.8 |
| 2015-01-01_01:32:57 | 87.4 | 85.8 |
| 2015-01-01_01:32:58 | 87.6 | 85.8 |
| 2015-01-01_01:32:59 | 87.6 | 85.8 |
| 2015-01-01_01:33:00 | 87.8 | 85.8 |
| 2015-01-01_01:33:01 | 87.9 | 85.8 |
| 2015-01-01_01:33:02 | 87.5 | 85.8 |
| 2015-01-01_01:33:03 | 87.6 | 85.8 |
| 2015-01-01_01:33:04 | 87.7 | 85.8 |
| 2015-01-01_01:33:05 | 87.7 | 85.8 |
| 2015-01-01_01:33:06 | 87.8 | 85.9 |
| 2015-01-01_01:33:07 | 87.7 | 85.9 |
| 2015-01-01_01:33:08 | 87.6 | 85.9 |
| 2015-01-01_01:33:09 | 87.5 | 85.9 |
| 2015-01-01_01:33:10 | 87.3 | 85.9 |
| 2015-01-01_01:33:11 | 86.8 | 85.9 |
| 2015-01-01_01:33:12 | 86.9 | 85.9 |
| 2015-01-01_01:33:13 | 86.6 | 85.9 |
| 2015-01-01_01:33:14 | 86.7 | 86 |
| 2015-01-01_01:33:15 | 86.3 | 86 |
| 2015-01-01_01:33:16 | 86.8 | 86 |
| 2015-01-01_01:33:17 | 86.7 | 86 |
| 2015-01-01_01:33:18 | 86.8 | 86 |
| 2015-01-01_01:33:19 | 86.7 | 86 |
| 2015-01-01_01:33:20 | 86.4 | 86 |
| 2015-01-01_01:33:21 | 87 | 86 |
| 2015-01-01_01:33:22 | 87.1 | 86 |
| 2015-01-01_01:33:23 | 87.3 | 86 |
| 2015-01-01_01:33:24 | 87.1 | 86 |
| 2015-01-01_01:33:25 | 87.3 | 86 |
| 2015-01-01_01:33:26 | 87.7 | 86 |
| 2015-01-01_01:33:27 | 87.7 | 86 |
| 2015-01-01_01:33:28 | 87.9 | 86 |
| 2015-01-01_01:33:29 | 87.9 | 86 |
| 2015-01-01_01:33:30 | 88.4 | 85.7 |
| 2015-01-01_01:33:31 | 88.4 | 85.7 |
| 2015-01-01_01:33:32 | 88.4 | 85.7 |
| 2015-01-01_01:33:33 | 88.5 | 85.7 |
| 2015-01-01_01:33:34 | 88.9 | 85.7 |
| 2015-01-01_01:33:35 | 88.9 | 85.7 |
| 2015-01-01_01:33:36 | 88.9 | 85.7 |
| 2015-01-01_01:33:37 | 89 | 85.7 |
| 2015-01-01_01:33:38 | 89.3 | 85.5 |
| 2015-01-01_01:33:39 | 89.2 | 85.5 |
| 2015-01-01_01:33:40 | 89.6 | 85.5 |
| 2015-01-01_01:33:41 | 89.2 | 85.5 |
| 2015-01-01_01:33:42 | 89.4 | 85.5 |
| 2015-01-01_01:33:43 | 89.6 | 85.5 |
| 2015-01-01_01:33:44 | 89.4 | 85.5 |
| 2015-01-01_01:33:45 | 89.7 | 85.5 |
| 2015-01-01_01:33:46 | 89.6 | 85.4 |
| 2015-01-01_01:33:47 | 89.6 | 85.4 |
| 2015-01-01_01:33:48 | 89.7 | 85.4 |
| 2015-01-01_01:33:49 | 89.6 | 85.4 |
| 2015-01-01_01:33:50 | 89.6 | 85.4 |
| 2015-01-01_01:33:51 | 90 | 85.4 |
| 2015-01-01_01:33:52 | 90.1 | 85.4 |
| 2015-01-01_01:33:53 | 89.8 | 85.4 |
| 2015-01-01_01:33:54 | 89.5 | 85.4 |
| 2015-01-01_01:33:55 | 89.7 | 85.4 |
| 2015-01-01_01:33:56 | 89.2 | 85.4 |
| 2015-01-01_01:33:57 | 89.1 | 85.4 |
| 2015-01-01_01:33:58 | 88.7 | 85.4 |
| 2015-01-01_01:33:59 | 88.9 | 85.4 |
| 2015-01-01_01:34:00 | 88.5 | 85.4 |
| 2015-01-01_01:34:01 | 88.4 | 85.4 |
| 2015-01-01_01:34:02 | 88.4 | 85.5 |
| 2015-01-01_01:34:03 | 88.4 | 85.5 |
| 2015-01-01_01:34:04 | 88.5 | 85.5 |
| 2015-01-01_01:34:05 | 88.5 | 85.5 |
| 2015-01-01_01:34:06 | 88.4 | 85.5 |
| 2015-01-01_01:34:07 | 88.6 | 85.5 |
| 2015-01-01_01:34:08 | 88.5 | 85.5 |
| 2015-01-01_01:34:09 | 88.1 | 85.5 |
| 2015-01-01_01:34:10 | 88.8 | 85.7 |
| 2015-01-01_01:34:11 | 88.9 | 85.7 |
| 2015-01-01_01:34:12 | 88.6 | 85.7 |
| 2015-01-01_01:34:13 | 88.4 | 85.7 |
| 2015-01-01_01:34:14 | 88.4 | 85.7 |
| 2015-01-01_01:34:15 | 88.3 | 85.7 |
| 2015-01-01_01:34:16 | 88.2 | 85.7 |
| 2015-01-01_01:34:17 | 88.4 | 85.7 |
| 2015-01-01_01:34:18 | 88.4 | 85.8 |
| 2015-01-01_01:34:19 | 88.5 | 85.8 |
| 2015-01-01_01:34:20 | 88.6 | 85.8 |
| 2015-01-01_01:34:21 | 88.1 | 85.8 |
| 2015-01-01_01:34:22 | 88.1 | 85.8 |
| 2015-01-01_01:34:23 | 88.2 | 85.8 |
| 2015-01-01_01:34:24 | 88.4 | 85.8 |
| 2015-01-01_01:34:25 | 88.8 | 85.8 |
| 2015-01-01_01:34:26 | 88.8 | 86 |
| 2015-01-01_01:34:27 | 88.8 | 86 |
| 2015-01-01_01:34:28 | 88.6 | 86 |
| 2015-01-01_01:34:29 | 88.5 | 86 |
| 2015-01-01_01:34:30 | 88.1 | 86 |
| 2015-01-01_01:34:31 | 88 | 86 |
| 2015-01-01_01:34:32 | 87.9 | 86 |
| 2015-01-01_01:34:33 | 87.7 | 86 |
| 2015-01-01_01:34:34 | 87.6 | 86.2 |
| 2015-01-01_01:34:35 | 87.6 | 86.2 |
| 2015-01-01_01:34:36 | 88 | 86.2 |
| 2015-01-01_01:34:37 | 87.8 | 86.2 |
| 2015-01-01_01:34:38 | 88.1 | 86.2 |
| 2015-01-01_01:34:39 | 88.9 | 86.2 |
| 2015-01-01_01:34:40 | 88.5 | 86.2 |
| 2015-01-01_01:34:41 | 89.4 | 86.2 |
| 2015-01-01_01:34:42 | 89.4 | 86.6 |
| 2015-01-01_01:34:43 | 89.4 | 86.6 |
| 2015-01-01_01:34:44 | 89.5 | 86.6 |
| 2015-01-01_01:34:45 | 89.6 | 86.6 |
| 2015-01-01_01:34:46 | 89.7 | 86.6 |
| 2015-01-01_01:34:47 | 89.5 | 86.6 |
| 2015-01-01_01:34:48 | 89.6 | 86.6 |
| 2015-01-01_01:34:49 | 89.5 | 86.6 |
| 2015-01-01_01:34:50 | 89.6 | 86.8 |
| 2015-01-01_01:34:51 | 89.7 | 86.8 |
| 2015-01-01_01:34:52 | 89.8 | 86.8 |
| 2015-01-01_01:34:53 | 89.5 | 86.8 |
| 2015-01-01_01:34:54 | 89.2 | 86.8 |
| 2015-01-01_01:34:55 | 88.8 | 86.8 |
| 2015-01-01_01:34:56 | 89.2 | 86.8 |
| 2015-01-01_01:34:57 | 89.3 | 86.8 |
| 2015-01-01_01:34:58 | 89.2 | 86.8 |
| 2015-01-01_01:34:59 | 89.1 | 86.8 |
| 2015-01-01_01:35:00 | 89.1 | 86.8 |
| 2015-01-01_01:35:01 | 89.2 | 86.8 |
| 2015-01-01_01:35:02 | 89 | 86.8 |
| 2015-01-01_01:35:03 | 89.2 | 86.8 |
| 2015-01-01_01:35:04 | 89.1 | 86.8 |
| 2015-01-01_01:35:05 | 89.1 | 86.8 |
| 2015-01-01_01:35:06 | 89 | 86.9 |
| 2015-01-01_01:35:07 | 89.2 | 86.9 |
| 2015-01-01_01:35:08 | 89 | 86.9 |
| 2015-01-01_01:35:09 | 89.2 | 86.9 |
| 2015-01-01_01:35:10 | 89.1 | 86.9 |
| 2015-01-01_01:35:11 | 89.1 | 86.9 |
| 2015-01-01_01:35:12 | 89.3 | 86.9 |
| 2015-01-01_01:35:13 | 88.6 | 86.9 |
| 2015-01-01_01:35:14 | 89.4 | 87.1 |
| 2015-01-01_01:35:15 | 89.3 | 87.1 |
| 2015-01-01_01:35:16 | 88.6 | 87.1 |
| 2015-01-01_01:35:17 | 88.9 | 87.1 |
| 2015-01-01_01:35:18 | 89.3 | 87.1 |
| 2015-01-01_01:35:19 | 89.4 | 87.1 |
| 2015-01-01_01:35:20 | 89.4 | 87.1 |
| 2015-01-01_01:35:21 | 89.7 | 87.1 |
| 2015-01-01_01:35:22 | 89.1 | 87.1 |
| 2015-01-01_01:35:23 | 88.8 | 87.1 |
| 2015-01-01_01:35:24 | 88.7 | 87.1 |
| 2015-01-01_01:35:25 | 88.6 | 87.1 |
| 2015-01-01_01:35:26 | 88.9 | 87.1 |
| 2015-01-01_01:35:27 | 88.9 | 87.1 |
| 2015-01-01_01:35:28 | 88.7 | 87.1 |
| 2015-01-01_01:35:29 | 88.9 | 87.1 |
| 2015-01-01_01:35:30 | 89.1 | 87.3 |
| 2015-01-01_01:35:31 | 88.9 | 87.3 |
| 2015-01-01_01:35:32 | 88.9 | 87.3 |
| 2015-01-01_01:35:33 | 89.1 | 87.3 |
| 2015-01-01_01:35:34 | 89.1 | 87.3 |
| 2015-01-01_01:35:35 | 88.9 | 87.3 |
| 2015-01-01_01:35:36 | 88.9 | 87.3 |
| 2015-01-01_01:35:37 | 89.1 | 87.3 |
| 2015-01-01_01:35:38 | 88.9 | 87.3 |
| 2015-01-01_01:35:39 | 89 | 87.3 |
| 2015-01-01_01:35:40 | 89.7 | 87.3 |
| 2015-01-01_01:35:41 | 89.2 | 87.3 |
| 2015-01-01_01:35:42 | 89.4 | 87.3 |
| 2015-01-01_01:35:43 | 89.1 | 87.3 |
| 2015-01-01_01:35:44 | 88.8 | 87.3 |
| 2015-01-01_01:35:45 | 89 | 87.3 |
| 2015-01-01_01:35:46 | 88.9 | 87.3 |
| 2015-01-01_01:35:47 | 88.8 | 87.3 |
| 2015-01-01_01:35:48 | 88.5 | 87.3 |
| 2015-01-01_01:35:49 | 88.4 | 87.3 |
| 2015-01-01_01:35:50 | 88.6 | 87.3 |
| 2015-01-01_01:35:51 | 88.5 | 87.3 |
| 2015-01-01_01:35:52 | 88.4 | 87.3 |
| 2015-01-01_01:35:53 | 88.1 | 87.3 |
| 2015-01-01_01:35:54 | 87.6 | 87.4 |
| 2015-01-01_01:35:55 | 87.3 | 87.4 |
| 2015-01-01_01:35:56 | 87.6 | 87.4 |
| 2015-01-01_01:35:57 | 87.3 | 87.4 |
| 2015-01-01_01:35:58 | 86.8 | 87.4 |
| 2015-01-01_01:35:59 | 86.5 | 87.4 |
| 2015-01-01_01:36:00 | 86.7 | 87.4 |
| 2015-01-01_01:36:01 | 86.6 | 87.4 |
| 2015-01-01_01:36:02 | 86.5 | 87.4 |
| 2015-01-01_01:36:03 | 86.4 | 87.4 |
| 2015-01-01_01:36:04 | 86 | 87.4 |
| 2015-01-01_01:36:05 | 85.9 | 87.4 |
| 2015-01-01_01:36:06 | 85.4 | 87.4 |
| 2015-01-01_01:36:07 | 85.6 | 87.4 |
| 2015-01-01_01:36:08 | 85.7 | 87.4 |
| 2015-01-01_01:36:09 | 85.7 | 87.4 |
| 2015-01-01_01:36:10 | 85.6 | 87.4 |
| 2015-01-01_01:36:11 | 86 | 87.4 |
| 2015-01-01_01:36:12 | 85.9 | 87.4 |
| 2015-01-01_01:36:13 | 85.7 | 87.4 |
| 2015-01-01_01:36:14 | 86.3 | 87.4 |
| 2015-01-01_01:36:15 | 85.9 | 87.4 |
| 2015-01-01_01:36:16 | 86 | 87.4 |
| 2015-01-01_01:36:17 | 85.8 | 87.4 |
| 2015-01-01_01:36:18 | 86.2 | 87.2 |
| 2015-01-01_01:36:19 | 86.2 | 87.2 |
| 2015-01-01_01:36:20 | 86.1 | 87.2 |
| 2015-01-01_01:36:21 | 86.2 | 87.2 |
| 2015-01-01_01:36:22 | 86.1 | 87.2 |
| 2015-01-01_01:36:23 | 86.2 | 87.2 |
| 2015-01-01_01:36:24 | 86.1 | 87.2 |
| 2015-01-01_01:36:25 | 86.5 | 87.2 |
| 2015-01-01_01:36:26 | 86.3 | 87 |
| 2015-01-01_01:36:27 | 86.1 | 87 |
| 2015-01-01_01:36:28 | 86.4 | 87 |
| 2015-01-01_01:36:29 | 86.6 | 87 |
| 2015-01-01_01:36:30 | 86.5 | 87 |
| 2015-01-01_01:36:31 | 86.6 | 87 |
| 2015-01-01_01:36:32 | 86.9 | 87 |
| 2015-01-01_01:36:33 | 86.9 | 87 |
| 2015-01-01_01:36:34 | 86.4 | 86.8 |
| 2015-01-01_01:36:35 | 86.4 | 86.8 |
| 2015-01-01_01:36:36 | 86.7 | 86.8 |
| 2015-01-01_01:36:37 | 86.6 | 86.8 |
| 2015-01-01_01:36:38 | 86.5 | 86.8 |
| 2015-01-01_01:36:39 | 86.7 | 86.8 |
| 2015-01-01_01:36:40 | 86.6 | 86.8 |
| 2015-01-01_01:36:41 | 86.5 | 86.8 |
| 2015-01-01_01:36:42 | 86.2 | 86.6 |
| 2015-01-01_01:36:43 | 86.6 | 86.6 |
| 2015-01-01_01:36:44 | 86.4 | 86.6 |
| 2015-01-01_01:36:45 | 86.3 | 86.6 |
| 2015-01-01_01:36:46 | 86.4 | 86.6 |
| 2015-01-01_01:36:47 | 86.5 | 86.6 |
| 2015-01-01_01:36:48 | 86.4 | 86.6 |
| 2015-01-01_01:36:49 | 86.3 | 86.6 |
| 2015-01-01_01:36:50 | 86.5 | 86.5 |
| 2015-01-01_01:36:51 | 86.5 | 86.5 |
| 2015-01-01_01:36:52 | 86.5 | 86.5 |
| 2015-01-01_01:36:53 | 86.3 | 86.5 |
| 2015-01-01_01:36:54 | 86 | 86.5 |
| 2015-01-01_01:36:55 | 86 | 86.5 |
| 2015-01-01_01:36:56 | 86 | 86.5 |
| 2015-01-01_01:36:57 | 85.8 | 86.5 |
| 2015-01-01_01:36:58 | 85.6 | 86.5 |
| 2015-01-01_01:36:59 | 85.5 | 86.5 |
| 2015-01-01_01:37:00 | 85.3 | 86.5 |
| 2015-01-01_01:37:01 | 85.1 | 86.5 |
| 2015-01-01_01:37:02 | 85.1 | 86.5 |
| 2015-01-01_01:37:03 | 84.7 | 86.5 |
| 2015-01-01_01:37:04 | 84.9 | 86.5 |
| 2015-01-01_01:37:05 | 85 | 86.5 |
| 2015-01-01_01:37:06 | 85.1 | 86.4 |
| 2015-01-01_01:37:07 | 85.1 | 86.4 |
| 2015-01-01_01:37:08 | 85.1 | 86.4 |
| 2015-01-01_01:37:09 | 85.2 | 86.4 |
| 2015-01-01_01:37:10 | 84.9 | 86.4 |
| 2015-01-01_01:37:11 | 85.3 | 86.4 |
| 2015-01-01_01:37:12 | 85.2 | 86.4 |
| 2015-01-01_01:37:13 | 85.1 | 86.4 |
| 2015-01-01_01:37:14 | 85.2 | 86.8 |
| 2015-01-01_01:37:15 | 85.2 | 86.8 |
| 2015-01-01_01:37:16 | 85.1 | 86.8 |
| 2015-01-01_01:37:17 | 85.2 | 86.8 |
| 2015-01-01_01:37:18 | 85.2 | 86.8 |
| 2015-01-01_01:37:19 | 85.1 | 86.8 |
| 2015-01-01_01:37:20 | 85.2 | 86.8 |
| 2015-01-01_01:37:21 | 85.3 | 86.8 |
| 2015-01-01_01:37:22 | 85.3 | 87.3 |
| 2015-01-01_01:37:23 | 85.2 | 87.3 |
| 2015-01-01_01:37:24 | 85.1 | 87.3 |
| 2015-01-01_01:37:25 | 85.1 | 87.3 |
| 2015-01-01_01:37:26 | 85.3 | 87.3 |
| 2015-01-01_01:37:27 | 85.1 | 87.3 |
| 2015-01-01_01:37:28 | 85 | 87.3 |
| 2015-01-01_01:37:29 | 84.9 | 87.3 |
| 2015-01-01_01:37:30 | 85.1 | 87.7 |
| 2015-01-01_01:37:31 | 84.8 | 87.7 |
| 2015-01-01_01:37:32 | 85.2 | 87.7 |
| 2015-01-01_01:37:33 | 85 | 87.7 |
| 2015-01-01_01:37:34 | 85 | 87.7 |
| 2015-01-01_01:37:35 | 85.2 | 87.7 |
| 2015-01-01_01:37:36 | 85.1 | 87.7 |
| 2015-01-01_01:37:37 | 85 | 87.7 |
| 2015-01-01_01:37:38 | 84.7 | 88 |
| 2015-01-01_01:37:39 | 84.8 | 88 |
| 2015-01-01_01:37:40 | 84.9 | 88 |
| 2015-01-01_01:37:41 | 84.9 | 88 |
| 2015-01-01_01:37:42 | 84.6 | 88 |
| 2015-01-01_01:37:43 | 84.7 | 88 |
| 2015-01-01_01:37:44 | 84.7 | 88 |
| 2015-01-01_01:37:45 | 84.3 | 88 |
| 2015-01-01_01:37:46 | 84.8 | 88.3 |
| 2015-01-01_01:37:47 | 85.2 | 88.3 |
| 2015-01-01_01:37:48 | 85 | 88.3 |
| 2015-01-01_01:37:49 | 85.6 | 88.3 |
| 2015-01-01_01:37:50 | 85.6 | 88.3 |
| 2015-01-01_01:37:51 | 85.8 | 88.3 |
| 2015-01-01_01:37:52 | 86 | 88.3 |
| 2015-01-01_01:37:53 | 85.6 | 88.3 |
| 2015-01-01_01:37:54 | 86.3 | 88.5 |
| 2015-01-01_01:37:55 | 86.3 | 88.5 |
| 2015-01-01_01:37:56 | 86.4 | 88.5 |
| 2015-01-01_01:37:57 | 86.7 | 88.5 |
| 2015-01-01_01:37:58 | 86.4 | 88.5 |
| 2015-01-01_01:37:59 | 86.8 | 88.5 |
| 2015-01-01_01:38:00 | 87.2 | 88.5 |
| 2015-01-01_01:38:01 | 87.1 | 88.5 |
| 2015-01-01_01:38:02 | 87.2 | 88.6 |
| 2015-01-01_01:38:03 | 87.5 | 88.6 |
| 2015-01-01_01:38:04 | 87.1 | 88.6 |
| 2015-01-01_01:38:05 | 87.9 | 88.6 |
| 2015-01-01_01:38:06 | 88.2 | 88.6 |
| 2015-01-01_01:38:07 | 88.1 | 88.6 |
| 2015-01-01_01:38:08 | 88.6 | 88.6 |
| 2015-01-01_01:38:09 | 88.8 | 88.6 |
| 2015-01-01_01:38:10 | 88.8 | 88.6 |
| 2015-01-01_01:38:11 | 88.6 | 88.6 |
| 2015-01-01_01:38:12 | 89.1 | 88.6 |
| 2015-01-01_01:38:13 | 88.8 | 88.6 |
| 2015-01-01_01:38:14 | 88.9 | 88.6 |
| 2015-01-01_01:38:15 | 89.4 | 88.6 |
| 2015-01-01_01:38:16 | 89.4 | 88.6 |
| 2015-01-01_01:38:17 | 89.3 | 88.6 |
| 2015-01-01_01:38:18 | 89 | 88.8 |
| 2015-01-01_01:38:19 | 89.1 | 88.8 |
| 2015-01-01_01:38:20 | 89.1 | 88.8 |
| 2015-01-01_01:38:21 | 88.9 | 88.8 |
| 2015-01-01_01:38:22 | 88.9 | 88.8 |
| 2015-01-01_01:38:23 | 89 | 88.8 |
| 2015-01-01_01:38:24 | 88.7 | 88.8 |
| 2015-01-01_01:38:25 | 88.9 | 88.8 |
| 2015-01-01_01:38:26 | 88.8 | 88.8 |
| 2015-01-01_01:38:27 | 88.4 | 88.8 |
| 2015-01-01_01:38:28 | 88.8 | 88.8 |
| 2015-01-01_01:38:29 | 88.5 | 88.8 |
| 2015-01-01_01:38:30 | 88.4 | 88.8 |
| 2015-01-01_01:38:31 | 88.3 | 88.8 |
| 2015-01-01_01:38:32 | 88.4 | 88.8 |
| 2015-01-01_01:38:33 | 88.3 | 88.8 |
| 2015-01-01_01:38:34 | 88.5 | 88.6 |
| 2015-01-01_01:38:35 | 88.5 | 88.6 |
| 2015-01-01_01:38:36 | 88.5 | 88.6 |
| 2015-01-01_01:38:37 | 88.5 | 88.6 |
| 2015-01-01_01:38:38 | 88.9 | 88.6 |
| 2015-01-01_01:38:39 | 89.1 | 88.6 |
| 2015-01-01_01:38:40 | 89.1 | 88.6 |
| 2015-01-01_01:38:41 | 88.8 | 88.6 |
| 2015-01-01_01:38:42 | 88.9 | 88.4 |
| 2015-01-01_01:38:43 | 88.8 | 88.4 |
| 2015-01-01_01:38:44 | 88.7 | 88.4 |
| 2015-01-01_01:38:45 | 89 | 88.4 |
| 2015-01-01_01:38:46 | 88.9 | 88.4 |
| 2015-01-01_01:38:47 | 88.8 | 88.4 |
| 2015-01-01_01:38:48 | 88.6 | 88.4 |
| 2015-01-01_01:38:49 | 88.3 | 88.4 |
| 2015-01-01_01:38:50 | 88.2 | 88.2 |
| 2015-01-01_01:38:51 | 87.9 | 88.2 |
| 2015-01-01_01:38:52 | 87.9 | 88.2 |
| 2015-01-01_01:38:53 | 87.6 | 88.2 |
| 2015-01-01_01:38:54 | 87.6 | 88.2 |
| 2015-01-01_01:38:55 | 87.4 | 88.2 |
| 2015-01-01_01:38:56 | 87.4 | 88.2 |
| 2015-01-01_01:38:57 | 87.1 | 88.2 |
| 2015-01-01_01:38:58 | 86.6 | 88.1 |
| 2015-01-01_01:38:59 | 86.7 | 88.1 |
| 2015-01-01_01:39:00 | 86.6 | 88.1 |
| 2015-01-01_01:39:01 | 86.7 | 88.1 |
| 2015-01-01_01:39:02 | 86.5 | 88.1 |
| 2015-01-01_01:39:03 | 86.7 | 88.1 |
| 2015-01-01_01:39:04 | 86.7 | 88.1 |
| 2015-01-01_01:39:05 | 86.7 | 88.1 |
| 2015-01-01_01:39:06 | 86.9 | 88.1 |
| 2015-01-01_01:39:07 | 87 | 88.1 |
| 2015-01-01_01:39:08 | 86.6 | 88.1 |
| 2015-01-01_01:39:09 | 86.9 | 88.1 |
| 2015-01-01_01:39:10 | 86.6 | 88.1 |
| 2015-01-01_01:39:11 | 86.9 | 88.1 |
| 2015-01-01_01:39:12 | 86.7 | 88.1 |
| 2015-01-01_01:39:13 | 86.9 | 88.1 |
| 2015-01-01_01:39:14 | 86.9 | 88.3 |
| 2015-01-01_01:39:15 | 86.6 | 88.3 |
| 2015-01-01_01:39:16 | 86.5 | 88.3 |
| 2015-01-01_01:39:17 | 86.7 | 88.3 |
| 2015-01-01_01:39:18 | 86.5 | 88.3 |
| 2015-01-01_01:39:19 | 86.6 | 88.3 |
| 2015-01-01_01:39:20 | 86.7 | 88.3 |
| 2015-01-01_01:39:21 | 86.7 | 88.3 |
| 2015-01-01_01:39:22 | 86.7 | 88.7 |
| 2015-01-01_01:39:23 | 86.6 | 88.7 |
| 2015-01-01_01:39:24 | 86.3 | 88.7 |
| 2015-01-01_01:39:25 | 86.2 | 88.7 |
| 2015-01-01_01:39:26 | 85.9 | 88.7 |
| 2015-01-01_01:39:27 | 86 | 88.7 |
| 2015-01-01_01:39:28 | 85.8 | 88.7 |
| 2015-01-01_01:39:29 | 85.9 | 88.7 |
| 2015-01-01_01:39:30 | 85.9 | 89.1 |
| 2015-01-01_01:39:31 | 86.4 | 89.1 |
| 2015-01-01_01:39:32 | 86.5 | 89.1 |
| 2015-01-01_01:39:33 | 86.3 | 89.1 |
| 2015-01-01_01:39:34 | 86.5 | 89.1 |
| 2015-01-01_01:39:35 | 86.4 | 89.1 |
| 2015-01-01_01:39:36 | 86.9 | 89.1 |
| 2015-01-01_01:39:37 | 86.8 | 89.1 |
| 2015-01-01_01:39:38 | 86.8 | 89.3 |
| 2015-01-01_01:39:39 | 87.1 | 89.3 |
| 2015-01-01_01:39:40 | 87.4 | 89.3 |
| 2015-01-01_01:39:41 | 87.4 | 89.3 |
| 2015-01-01_01:39:42 | 87.7 | 89.3 |
| 2015-01-01_01:39:43 | 87.7 | 89.3 |
| 2015-01-01_01:39:44 | 87.6 | 89.3 |
| 2015-01-01_01:39:45 | 87.9 | 89.3 |
| 2015-01-01_01:39:46 | 88.2 | 89.6 |
| 2015-01-01_01:39:47 | 88.3 | 89.6 |
| 2015-01-01_01:39:48 | 88.6 | 89.6 |
| 2015-01-01_01:39:49 | 88.5 | 89.6 |
| 2015-01-01_01:39:50 | 88.8 | 89.6 |
| 2015-01-01_01:39:51 | 88.9 | 89.6 |
| 2015-01-01_01:39:52 | 88.7 | 89.6 |
| 2015-01-01_01:39:53 | 88.7 | 89.6 |
| 2015-01-01_01:39:54 | 89.1 | 89.7 |
| 2015-01-01_01:39:55 | 88.9 | 89.7 |
| 2015-01-01_01:39:56 | 89.2 | 89.7 |
| 2015-01-01_01:39:57 | 89.4 | 89.7 |
| 2015-01-01_01:39:58 | 88.1 | 89.7 |
| 2015-01-01_01:39:59 | 89 | 89.7 |
| 2015-01-01_01:40:00 | 89.2 | 89.7 |
| 2015-01-01_01:40:01 | 89.2 | 89.7 |
| 2015-01-01_01:40:02 | 89.4 | 89.8 |
| 2015-01-01_01:40:03 | 89.3 | 89.8 |
| 2015-01-01_01:40:04 | 89.2 | 89.8 |
| 2015-01-01_01:40:05 | 89.2 | 89.8 |
| 2015-01-01_01:40:06 | 89.3 | 89.8 |
| 2015-01-01_01:40:07 | 89.3 | 89.8 |
| 2015-01-01_01:40:08 | 89.8 | 89.8 |
| 2015-01-01_01:40:09 | 89.6 | 89.8 |
| 2015-01-01_01:40:10 | 89.4 | 89.9 |
| 2015-01-01_01:40:11 | 89.5 | 89.9 |
| 2015-01-01_01:40:12 | 89.4 | 89.9 |
| 2015-01-01_01:40:13 | 89.1 | 89.9 |
| 2015-01-01_01:40:14 | 89.3 | 89.9 |
| 2015-01-01_01:40:15 | 89.3 | 89.9 |
| 2015-01-01_01:40:16 | 89.3 | 89.9 |
| 2015-01-01_01:40:17 | 89.5 | 89.9 |
| 2015-01-01_01:40:18 | 89.7 | 90 |
| 2015-01-01_01:40:19 | 89.7 | 90 |
| 2015-01-01_01:40:20 | 89.7 | 90 |
| 2015-01-01_01:40:21 | 89.8 | 90 |
| 2015-01-01_01:40:22 | 89.7 | 90 |
| 2015-01-01_01:40:23 | 89.7 | 90 |
| 2015-01-01_01:40:24 | 90 | 90 |
| 2015-01-01_01:40:25 | 89.9 | 90 |
| 2015-01-01_01:40:26 | 89.8 | 90 |
| 2015-01-01_01:40:27 | 89.8 | 90 |
| 2015-01-01_01:40:28 | 89.6 | 90 |
| 2015-01-01_01:40:29 | 89.5 | 90 |
| 2015-01-01_01:40:30 | 89.2 | 90 |
| 2015-01-01_01:40:31 | 89.2 | 90 |
| 2015-01-01_01:40:32 | 88.9 | 90 |
| 2015-01-01_01:40:33 | 88.9 | 90 |
| 2015-01-01_01:40:34 | 88.8 | 90 |
| 2015-01-01_01:40:35 | 88.7 | 90 |
| 2015-01-01_01:40:36 | 88.7 | 90 |
| 2015-01-01_01:40:37 | 88.6 | 90 |
| 2015-01-01_01:40:38 | 88.3 | 90 |
| 2015-01-01_01:40:39 | 88.2 | 90 |
| 2015-01-01_01:40:40 | 87.8 | 90 |
| 2015-01-01_01:40:41 | 88.3 | 90 |
| 2015-01-01_01:40:42 | 88.2 | 90 |
| 2015-01-01_01:40:43 | 88.1 | 90 |
| 2015-01-01_01:40:44 | 88.1 | 90 |
| 2015-01-01_01:40:45 | 88.2 | 90 |
| 2015-01-01_01:40:46 | 88 | 90 |
| 2015-01-01_01:40:47 | 88.1 | 90 |
| 2015-01-01_01:40:48 | 88.1 | 90 |
| 2015-01-01_01:40:49 | 88 | 90 |
| 2015-01-01_01:40:50 | 88 | 90.1 |
| 2015-01-01_01:40:51 | 88.2 | 90.1 |
| 2015-01-01_01:40:52 | 88.1 | 90.1 |
| 2015-01-01_01:40:53 | 88 | 90.1 |
| 2015-01-01_01:40:54 | 88.2 | 90.1 |
| 2015-01-01_01:40:55 | 88.2 | 90.1 |
| 2015-01-01_01:40:56 | 88.1 | 90.1 |
| 2015-01-01_01:40:57 | 88.1 | 90.1 |
| 2015-01-01_01:40:58 | 87.9 | 90.3 |
| 2015-01-01_01:40:59 | 88.1 | 90.3 |
| 2015-01-01_01:41:00 | 87.9 | 90.3 |
| 2015-01-01_01:41:01 | 87.9 | 90.3 |
| 2015-01-01_01:41:02 | 87.8 | 90.3 |
| 2015-01-01_01:41:03 | 88 | 90.3 |
| 2015-01-01_01:41:04 | 88 | 90.3 |
| 2015-01-01_01:41:05 | 87.9 | 90.3 |
| 2015-01-01_01:41:06 | 87.6 | 90.4 |
| 2015-01-01_01:41:07 | 87.9 | 90.4 |
| 2015-01-01_01:41:08 | 87.9 | 90.4 |
| 2015-01-01_01:41:09 | 87.9 | 90.4 |
| 2015-01-01_01:41:10 | 87.8 | 90.4 |
| 2015-01-01_01:41:11 | 87.6 | 90.4 |
| 2015-01-01_01:41:12 | 87.8 | 90.4 |
| 2015-01-01_01:41:13 | 87.6 | 90.4 |
| 2015-01-01_01:41:14 | 87.8 | 90.5 |
| 2015-01-01_01:41:15 | 87.6 | 90.5 |
| 2015-01-01_01:41:16 | 87.6 | 90.5 |
| 2015-01-01_01:41:17 | 87.7 | 90.5 |
| 2015-01-01_01:41:18 | 87.6 | 90.5 |
| 2015-01-01_01:41:19 | 87.7 | 90.5 |
| 2015-01-01_01:41:20 | 87.6 | 90.5 |
| 2015-01-01_01:41:21 | 87.4 | 90.5 |
| 2015-01-01_01:41:22 | 87.8 | 90.5 |
| 2015-01-01_01:41:23 | 87.6 | 90.5 |
| 2015-01-01_01:41:24 | 87.4 | 90.5 |
| 2015-01-01_01:41:25 | 87.8 | 90.5 |
| 2015-01-01_01:41:26 | 87.4 | 90.5 |
| 2015-01-01_01:41:27 | 87.7 | 90.5 |
| 2015-01-01_01:41:28 | 87.8 | 90.5 |
| 2015-01-01_01:41:29 | 87.4 | 90.5 |
| 2015-01-01_01:41:30 | 87.6 | 90.6 |
| 2015-01-01_01:41:31 | 87.7 | 90.6 |
| 2015-01-01_01:41:32 | 87.8 | 90.6 |
| 2015-01-01_01:41:33 | 87.6 | 90.6 |
| 2015-01-01_01:41:34 | 87.4 | 90.6 |
| 2015-01-01_01:41:35 | 87.3 | 90.6 |
| 2015-01-01_01:41:36 | 87.8 | 90.6 |
| 2015-01-01_01:41:37 | 87.6 | 90.6 |
| 2015-01-01_01:41:38 | 87.6 | 90.7 |
| 2015-01-01_01:41:39 | 87.8 | 90.7 |
| 2015-01-01_01:41:40 | 88 | 90.7 |
| 2015-01-01_01:41:41 | 87.9 | 90.7 |
| 2015-01-01_01:41:42 | 87.5 | 90.7 |
| 2015-01-01_01:41:43 | 88.1 | 90.7 |
| 2015-01-01_01:41:44 | 87.7 | 90.7 |
| 2015-01-01_01:41:45 | 87.7 | 90.7 |
| 2015-01-01_01:41:46 | 87.5 | 90.8 |
| 2015-01-01_01:41:47 | 88.4 | 90.8 |
| 2015-01-01_01:41:48 | 88.4 | 90.8 |
| 2015-01-01_01:41:49 | 88.9 | 90.8 |
| 2015-01-01_01:41:50 | 89.1 | 90.8 |
| 2015-01-01_01:41:51 | 88.7 | 90.8 |
| 2015-01-01_01:41:52 | 89.7 | 90.8 |
| 2015-01-01_01:41:53 | 89.7 | 90.8 |
| 2015-01-01_01:41:54 | 90.6 | 91 |
| 2015-01-01_01:41:55 | 90.9 | 91 |
| 2015-01-01_01:41:56 | 91 | 91 |
| 2015-01-01_01:41:57 | 91.6 | 91 |
| 2015-01-01_01:41:58 | 91.5 | 91 |
| 2015-01-01_01:41:59 | 92 | 91 |
| 2015-01-01_01:42:00 | 92.1 | 91 |
| 2015-01-01_01:42:01 | 92.5 | 91 |
| 2015-01-01_01:42:02 | 92.6 | 91.1 |
| 2015-01-01_01:42:03 | 92.4 | 91.1 |
| 2015-01-01_01:42:04 | 92.6 | 91.1 |
| 2015-01-01_01:42:05 | 92.1 | 91.1 |
| 2015-01-01_01:42:06 | 92.6 | 91.1 |
| 2015-01-01_01:42:07 | 92.5 | 91.1 |
| 2015-01-01_01:42:08 | 92.6 | 91.1 |
| 2015-01-01_01:42:09 | 92.7 | 91.1 |
| 2015-01-01_01:42:10 | 92.4 | 90.9 |
| 2015-01-01_01:42:11 | 92 | 90.9 |
| 2015-01-01_01:42:12 | 92.1 | 90.9 |
| 2015-01-01_01:42:13 | 91.7 | 90.9 |
| 2015-01-01_01:42:14 | 91.7 | 90.9 |
| 2015-01-01_01:42:15 | 91.6 | 90.9 |
| 2015-01-01_01:42:16 | 91 | 90.9 |
| 2015-01-01_01:42:17 | 90.8 | 90.9 |
| 2015-01-01_01:42:18 | 90.7 | 90.6 |
| 2015-01-01_01:42:19 | 90.5 | 90.6 |
| 2015-01-01_01:42:20 | 90.3 | 90.6 |
| 2015-01-01_01:42:21 | 90.8 | 90.6 |
| 2015-01-01_01:42:22 | 90.8 | 90.6 |
| 2015-01-01_01:42:23 | 90.7 | 90.6 |
| 2015-01-01_01:42:24 | 90.5 | 90.6 |
| 2015-01-01_01:42:25 | 90.5 | 90.6 |
| 2015-01-01_01:42:26 | 90.4 | 90.3 |
| 2015-01-01_01:42:27 | 90.2 | 90.3 |
| 2015-01-01_01:42:28 | 89.6 | 90.3 |
| 2015-01-01_01:42:29 | 89.9 | 90.3 |
| 2015-01-01_01:42:30 | 89.8 | 90.3 |
| 2015-01-01_01:42:31 | 89.5 | 90.3 |
| 2015-01-01_01:42:32 | 89.6 | 90.3 |
| 2015-01-01_01:42:33 | 89.3 | 90.3 |
| 2015-01-01_01:42:34 | 88.9 | 90 |
| 2015-01-01_01:42:35 | 89.2 | 90 |
| 2015-01-01_01:42:36 | 89.1 | 90 |
| 2015-01-01_01:42:37 | 88.8 | 90 |
| 2015-01-01_01:42:38 | 88.9 | 90 |
| 2015-01-01_01:42:39 | 88.6 | 90 |
| 2015-01-01_01:42:40 | 88.5 | 90 |
| 2015-01-01_01:42:41 | 88.4 | 90 |
| 2015-01-01_01:42:42 | 88.1 | 89.9 |
| 2015-01-01_01:42:43 | 88 | 89.9 |
| 2015-01-01_01:42:44 | 87.8 | 89.9 |
| 2015-01-01_01:42:45 | 87.6 | 89.9 |
| 2015-01-01_01:42:46 | 88 | 89.9 |
| 2015-01-01_01:42:47 | 87.8 | 89.9 |
| 2015-01-01_01:42:48 | 87.8 | 89.9 |
| 2015-01-01_01:42:49 | 87.5 | 89.9 |
| 2015-01-01_01:42:50 | 87.5 | 89.8 |
| 2015-01-01_01:42:51 | 87.3 | 89.8 |
| 2015-01-01_01:42:52 | 87.4 | 89.8 |
| 2015-01-01_01:42:53 | 87.1 | 89.8 |
| 2015-01-01_01:42:54 | 87.4 | 89.8 |
| 2015-01-01_01:42:55 | 87.3 | 89.8 |
| 2015-01-01_01:42:56 | 86.7 | 89.8 |
| 2015-01-01_01:42:57 | 86.6 | 89.8 |
| 2015-01-01_01:42:58 | 86.7 | 89.8 |
| 2015-01-01_01:42:59 | 87 | 89.8 |
| 2015-01-01_01:43:00 | 87.3 | 89.8 |
| 2015-01-01_01:43:01 | 87.4 | 89.8 |
| 2015-01-01_01:43:02 | 87.6 | 89.8 |
| 2015-01-01_01:43:03 | 87.5 | 89.8 |
| 2015-01-01_01:43:04 | 88 | 89.8 |
| 2015-01-01_01:43:05 | 88.3 | 89.8 |
| 2015-01-01_01:43:06 | 88.5 | 89.8 |
| 2015-01-01_01:43:07 | 88.5 | 89.8 |
| 2015-01-01_01:43:08 | 88.5 | 89.8 |
| 2015-01-01_01:43:09 | 88.1 | 89.8 |
| 2015-01-01_01:43:10 | 88.4 | 89.8 |
| 2015-01-01_01:43:11 | 88.4 | 89.8 |
| 2015-01-01_01:43:12 | 88.4 | 89.8 |
| 2015-01-01_01:43:13 | 88.4 | 89.8 |
| 2015-01-01_01:43:14 | 88.3 | 89.7 |
| 2015-01-01_01:43:15 | 88.2 | 89.7 |
| 2015-01-01_01:43:16 | 87.8 | 89.7 |
| 2015-01-01_01:43:17 | 88 | 89.7 |
| 2015-01-01_01:43:18 | 87.4 | 89.7 |
| 2015-01-01_01:43:19 | 88 | 89.7 |
| 2015-01-01_01:43:20 | 88.2 | 89.7 |
| 2015-01-01_01:43:21 | 88.2 | 89.7 |
| 2015-01-01_01:43:22 | 88.3 | 89.6 |
| 2015-01-01_01:43:23 | 88.4 | 89.6 |
| 2015-01-01_01:43:24 | 88.4 | 89.6 |
| 2015-01-01_01:43:25 | 88.5 | 89.6 |
| 2015-01-01_01:43:26 | 88.6 | 89.6 |
| 2015-01-01_01:43:27 | 88.4 | 89.6 |
| 2015-01-01_01:43:28 | 88.4 | 89.6 |
| 2015-01-01_01:43:29 | 88.5 | 89.6 |
| 2015-01-01_01:43:30 | 88.7 | 90 |
| 2015-01-01_01:43:31 | 88.5 | 90 |
| 2015-01-01_01:43:32 | 88.4 | 90 |
| 2015-01-01_01:43:33 | 88.6 | 90 |
| 2015-01-01_01:43:34 | 88.7 | 90 |
| 2015-01-01_01:43:35 | 88.7 | 90 |
| 2015-01-01_01:43:36 | 88.7 | 90 |
| 2015-01-01_01:43:37 | 88.4 | 90 |
| 2015-01-01_01:43:38 | 88.5 | 90.5 |
| 2015-01-01_01:43:39 | 88.5 | 90.5 |
| 2015-01-01_01:43:40 | 88.4 | 90.5 |
| 2015-01-01_01:43:41 | 88.3 | 90.5 |
| 2015-01-01_01:43:42 | 88.5 | 90.5 |
| 2015-01-01_01:43:43 | 88.4 | 90.5 |
| 2015-01-01_01:43:44 | 88.5 | 90.5 |
| 2015-01-01_01:43:45 | 88.5 | 90.5 |
| 2015-01-01_01:43:46 | 88.3 | 90.9 |
| 2015-01-01_01:43:47 | 88.3 | 90.9 |
| 2015-01-01_01:43:48 | 88.1 | 90.9 |
| 2015-01-01_01:43:49 | 88.4 | 90.9 |
| 2015-01-01_01:43:50 | 88.3 | 90.9 |
| 2015-01-01_01:43:51 | 88.4 | 90.9 |
| 2015-01-01_01:43:52 | 88.4 | 90.9 |
| 2015-01-01_01:43:53 | 87.9 | 90.9 |
| 2015-01-01_01:43:54 | 88.3 | 91.1 |
| 2015-01-01_01:43:55 | 88.2 | 91.1 |
| 2015-01-01_01:43:56 | 88.1 | 91.1 |
| 2015-01-01_01:43:57 | 88.3 | 91.1 |
| 2015-01-01_01:43:58 | 88.2 | 91.1 |
| 2015-01-01_01:43:59 | 88.1 | 91.1 |
| 2015-01-01_01:44:00 | 87.9 | 91.1 |
| 2015-01-01_01:44:01 | 88.3 | 91.1 |
| 2015-01-01_01:44:02 | 88 | 91.3 |
| 2015-01-01_01:44:03 | 87.4 | 91.3 |
| 2015-01-01_01:44:04 | 88.1 | 91.3 |
| 2015-01-01_01:44:05 | 87.4 | 91.3 |
| 2015-01-01_01:44:06 | 88.2 | 91.3 |
| 2015-01-01_01:44:07 | 88.5 | 91.3 |
| 2015-01-01_01:44:08 | 88.5 | 91.3 |
| 2015-01-01_01:44:09 | 88.7 | 91.3 |
| 2015-01-01_01:44:10 | 89.3 | 91.3 |
| 2015-01-01_01:44:11 | 89.7 | 91.3 |
| 2015-01-01_01:44:12 | 90 | 91.3 |
| 2015-01-01_01:44:13 | 90.2 | 91.3 |
| 2015-01-01_01:44:14 | 90.6 | 91.3 |
| 2015-01-01_01:44:15 | 91.2 | 91.3 |
| 2015-01-01_01:44:16 | 91.4 | 91.3 |
| 2015-01-01_01:44:17 | 91.9 | 91.3 |
| 2015-01-01_01:44:18 | 92.1 | 91.6 |
| 2015-01-01_01:44:19 | 92.3 | 91.6 |
| 2015-01-01_01:44:20 | 92.1 | 91.6 |
| 2015-01-01_01:44:21 | 92.1 | 91.6 |
| 2015-01-01_01:44:22 | 92.1 | 91.6 |
| 2015-01-01_01:44:23 | 91.8 | 91.6 |
| 2015-01-01_01:44:24 | 91.6 | 91.6 |
| 2015-01-01_01:44:25 | 91.7 | 91.6 |
| 2015-01-01_01:44:26 | 91.3 | 91.3 |
| 2015-01-01_01:44:27 | 91.3 | 91.3 |
| 2015-01-01_01:44:28 | 91.1 | 91.3 |
| 2015-01-01_01:44:29 | 91.4 | 91.3 |
| 2015-01-01_01:44:30 | 91.2 | 91.3 |
| 2015-01-01_01:44:31 | 91 | 91.3 |
| 2015-01-01_01:44:32 | 91.3 | 91.3 |
| 2015-01-01_01:44:33 | 90.9 | 91.3 |
| 2015-01-01_01:44:34 | 91 | 91.1 |
| 2015-01-01_01:44:35 | 90.9 | 91.1 |
| 2015-01-01_01:44:36 | 90.9 | 91.1 |
| 2015-01-01_01:44:37 | 90.9 | 91.1 |
| 2015-01-01_01:44:38 | 91 | 91.1 |
| 2015-01-01_01:44:39 | 91.2 | 91.1 |
| 2015-01-01_01:44:40 | 91.1 | 91.1 |
| 2015-01-01_01:44:41 | 91.2 | 91.1 |
| 2015-01-01_01:44:42 | 90.9 | 90.9 |
| 2015-01-01_01:44:43 | 90.9 | 90.9 |
| 2015-01-01_01:44:44 | 90.9 | 90.9 |
| 2015-01-01_01:44:45 | 90.4 | 90.9 |
| 2015-01-01_01:44:46 | 90.7 | 90.9 |
| 2015-01-01_01:44:47 | 90.6 | 90.9 |
| 2015-01-01_01:44:48 | 90.5 | 90.9 |
| 2015-01-01_01:44:49 | 90.3 | 90.9 |
| 2015-01-01_01:44:50 | 90.2 | 90.9 |
| 2015-01-01_01:44:51 | 89.8 | 90.9 |
| 2015-01-01_01:44:52 | 90.2 | 90.9 |
| 2015-01-01_01:44:53 | 89.7 | 90.9 |
| 2015-01-01_01:44:54 | 90 | 90.9 |
| 2015-01-01_01:44:55 | 90.2 | 90.9 |
| 2015-01-01_01:44:56 | 90.2 | 90.9 |
| 2015-01-01_01:44:57 | 90.2 | 90.9 |
| 2015-01-01_01:44:58 | 90.1 | 91.2 |
| 2015-01-01_01:44:59 | 90 | 91.2 |
| 2015-01-01_01:45:00 | 90.3 | 91.2 |
| 2015-01-01_01:45:01 | 90.3 | 91.2 |
| 2015-01-01_01:45:02 | 90.2 | 91.2 |
| 2015-01-01_01:45:03 | 89.9 | 91.2 |
| 2015-01-01_01:45:04 | 89.9 | 91.2 |
| 2015-01-01_01:45:05 | 90 | 91.2 |
| 2015-01-01_01:45:06 | 89.7 | 91.3 |
| 2015-01-01_01:45:07 | 89.7 | 91.3 |
| 2015-01-01_01:45:08 | 89.7 | 91.3 |
| 2015-01-01_01:45:09 | 89.5 | 91.3 |
| 2015-01-01_01:45:10 | 90.2 | 91.3 |
| 2015-01-01_01:45:11 | 89.8 | 91.3 |
| 2015-01-01_01:45:12 | 90 | 91.3 |
| 2015-01-01_01:45:13 | 89.8 | 91.3 |
| 2015-01-01_01:45:14 | 89.6 | 91.3 |
| 2015-01-01_01:45:15 | 89.6 | 91.3 |
| 2015-01-01_01:45:16 | 89.2 | 91.3 |
| 2015-01-01_01:45:17 | 89.3 | 91.3 |
| 2015-01-01_01:45:18 | 89.4 | 91.3 |
| 2015-01-01_01:45:19 | 89 | 91.3 |
| 2015-01-01_01:45:20 | 89.2 | 91.3 |
| 2015-01-01_01:45:21 | 88.8 | 91.3 |
| 2015-01-01_01:45:22 | 88.7 | 91.3 |
| 2015-01-01_01:45:23 | 88.9 | 91.3 |
| 2015-01-01_01:45:24 | 88.7 | 91.3 |
| 2015-01-01_01:45:25 | 89.1 | 91.3 |
| 2015-01-01_01:45:26 | 89 | 91.3 |
| 2015-01-01_01:45:27 | 89.2 | 91.3 |
| 2015-01-01_01:45:28 | 89.1 | 91.3 |
| 2015-01-01_01:45:29 | 89.1 | 91.3 |
| 2015-01-01_01:45:30 | 89.2 | 91.4 |
| 2015-01-01_01:45:31 | 89 | 91.4 |
| 2015-01-01_01:45:32 | 88.9 | 91.4 |
| 2015-01-01_01:45:33 | 88.8 | 91.4 |
| 2015-01-01_01:45:34 | 88.4 | 91.4 |
| 2015-01-01_01:45:35 | 88.5 | 91.4 |
| 2015-01-01_01:45:36 | 88.9 | 91.4 |
| 2015-01-01_01:45:37 | 88.7 | 91.4 |
| 2015-01-01_01:45:38 | 88.8 | 91.5 |
| 2015-01-01_01:45:39 | 88.9 | 91.5 |
| 2015-01-01_01:45:40 | 88.8 | 91.5 |
| 2015-01-01_01:45:41 | 88.6 | 91.5 |
| 2015-01-01_01:45:42 | 88.9 | 91.5 |
| 2015-01-01_01:45:43 | 89 | 91.5 |
| 2015-01-01_01:45:44 | 88.5 | 91.5 |
| 2015-01-01_01:45:45 | 88.7 | 91.5 |
| 2015-01-01_01:45:46 | 89.1 | 91.8 |
| 2015-01-01_01:45:47 | 88.8 | 91.8 |
| 2015-01-01_01:45:48 | 88.9 | 91.8 |
| 2015-01-01_01:45:49 | 88.9 | 91.8 |
| 2015-01-01_01:45:50 | 89 | 91.8 |
| 2015-01-01_01:45:51 | 88.8 | 91.8 |
| 2015-01-01_01:45:52 | 88.9 | 91.8 |
| 2015-01-01_01:45:53 | 89 | 91.8 |
| 2015-01-01_01:45:54 | 88.8 | 91.9 |
| 2015-01-01_01:45:55 | 88.9 | 91.9 |
| 2015-01-01_01:45:56 | 88.7 | 91.9 |
| 2015-01-01_01:45:57 | 88.7 | 91.9 |
| 2015-01-01_01:45:58 | 88.9 | 91.9 |
| 2015-01-01_01:45:59 | 88.7 | 91.9 |
| 2015-01-01_01:46:00 | 88.9 | 91.9 |
| 2015-01-01_01:46:01 | 88.7 | 91.9 |
| 2015-01-01_01:46:02 | 88.4 | 92.1 |
| 2015-01-01_01:46:03 | 88.9 | 92.1 |
| 2015-01-01_01:46:04 | 88.6 | 92.1 |
| 2015-01-01_01:46:05 | 88.9 | 92.1 |
| 2015-01-01_01:46:06 | 88.6 | 92.1 |
| 2015-01-01_01:46:07 | 88.9 | 92.1 |
| 2015-01-01_01:46:08 | 88.8 | 92.1 |
| 2015-01-01_01:46:09 | 88.8 | 92.1 |
| 2015-01-01_01:46:10 | 88.6 | 92.3 |
| 2015-01-01_01:46:11 | 88.9 | 92.3 |
| 2015-01-01_01:46:12 | 88.7 | 92.3 |
| 2015-01-01_01:46:13 | 88.7 | 92.3 |
| 2015-01-01_01:46:14 | 88.5 | 92.3 |
| 2015-01-01_01:46:15 | 89 | 92.3 |
| 2015-01-01_01:46:16 | 88.9 | 92.3 |